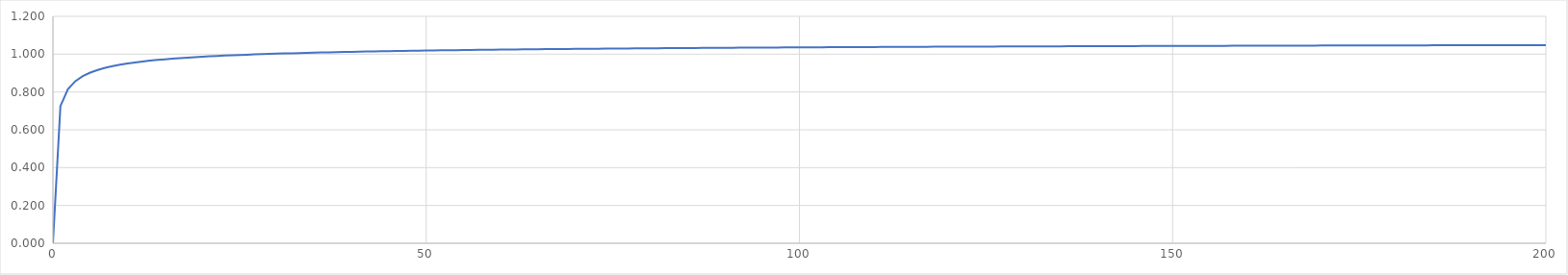
| Category | Series 0 |
|---|---|
| 1e-08 | 0 |
| 1.0 | 0.725 |
| 2.0 | 0.814 |
| 3.0 | 0.857 |
| 4.0 | 0.884 |
| 5.0 | 0.903 |
| 6.0 | 0.917 |
| 7.0 | 0.928 |
| 8.0 | 0.937 |
| 9.0 | 0.944 |
| 10.0 | 0.951 |
| 11.0 | 0.956 |
| 12.0 | 0.961 |
| 13.0 | 0.966 |
| 14.0 | 0.969 |
| 15.0 | 0.973 |
| 16.0 | 0.976 |
| 17.0 | 0.979 |
| 18.0 | 0.982 |
| 19.0 | 0.984 |
| 20.0 | 0.986 |
| 21.0 | 0.988 |
| 22.0 | 0.99 |
| 23.0 | 0.992 |
| 24.0 | 0.994 |
| 25.0 | 0.996 |
| 26.0 | 0.997 |
| 27.0 | 0.999 |
| 28.0 | 1 |
| 29.0 | 1.001 |
| 30.0 | 1.003 |
| 31.0 | 1.004 |
| 32.0 | 1.005 |
| 33.0 | 1.006 |
| 34.0 | 1.007 |
| 35.0 | 1.008 |
| 36.0 | 1.009 |
| 37.0 | 1.01 |
| 38.0 | 1.011 |
| 39.0 | 1.012 |
| 40.0 | 1.012 |
| 41.0 | 1.013 |
| 42.0 | 1.014 |
| 43.0 | 1.015 |
| 44.0 | 1.015 |
| 45.0 | 1.016 |
| 46.0 | 1.017 |
| 47.0 | 1.017 |
| 48.0 | 1.018 |
| 49.0 | 1.018 |
| 50.0 | 1.019 |
| 51.0 | 1.02 |
| 52.0 | 1.02 |
| 53.0 | 1.021 |
| 54.0 | 1.021 |
| 55.0 | 1.022 |
| 56.0 | 1.022 |
| 57.0 | 1.023 |
| 58.0 | 1.023 |
| 59.0 | 1.024 |
| 60.0 | 1.024 |
| 61.0 | 1.024 |
| 62.0 | 1.025 |
| 63.0 | 1.025 |
| 64.0 | 1.026 |
| 65.0 | 1.026 |
| 66.0 | 1.026 |
| 67.0 | 1.027 |
| 68.0 | 1.027 |
| 69.0 | 1.028 |
| 70.0 | 1.028 |
| 71.0 | 1.028 |
| 72.0 | 1.029 |
| 73.0 | 1.029 |
| 74.0 | 1.029 |
| 75.0 | 1.03 |
| 76.0 | 1.03 |
| 77.0 | 1.03 |
| 78.0 | 1.031 |
| 79.0 | 1.031 |
| 80.0 | 1.031 |
| 81.0 | 1.031 |
| 82.0 | 1.032 |
| 83.0 | 1.032 |
| 84.0 | 1.032 |
| 85.0 | 1.032 |
| 86.0 | 1.033 |
| 87.0 | 1.033 |
| 88.0 | 1.033 |
| 89.0 | 1.033 |
| 90.0 | 1.034 |
| 91.0 | 1.034 |
| 92.0 | 1.034 |
| 93.0 | 1.034 |
| 94.0 | 1.035 |
| 95.0 | 1.035 |
| 96.0 | 1.035 |
| 97.0 | 1.035 |
| 98.0 | 1.036 |
| 99.0 | 1.036 |
| 100.0 | 1.036 |
| 101.0 | 1.036 |
| 102.0 | 1.036 |
| 103.0 | 1.037 |
| 104.0 | 1.037 |
| 105.0 | 1.037 |
| 106.0 | 1.037 |
| 107.0 | 1.037 |
| 108.0 | 1.037 |
| 109.0 | 1.038 |
| 110.0 | 1.038 |
| 111.0 | 1.038 |
| 112.0 | 1.038 |
| 113.0 | 1.038 |
| 114.0 | 1.039 |
| 115.0 | 1.039 |
| 116.0 | 1.039 |
| 117.0 | 1.039 |
| 118.0 | 1.039 |
| 119.0 | 1.039 |
| 120.0 | 1.04 |
| 121.0 | 1.04 |
| 122.0 | 1.04 |
| 123.0 | 1.04 |
| 124.0 | 1.04 |
| 125.0 | 1.04 |
| 126.0 | 1.04 |
| 127.0 | 1.041 |
| 128.0 | 1.041 |
| 129.0 | 1.041 |
| 130.0 | 1.041 |
| 131.0 | 1.041 |
| 132.0 | 1.041 |
| 133.0 | 1.041 |
| 134.0 | 1.042 |
| 135.0 | 1.042 |
| 136.0 | 1.042 |
| 137.0 | 1.042 |
| 138.0 | 1.042 |
| 139.0 | 1.042 |
| 140.0 | 1.042 |
| 141.0 | 1.042 |
| 142.0 | 1.043 |
| 143.0 | 1.043 |
| 144.0 | 1.043 |
| 145.0 | 1.043 |
| 146.0 | 1.043 |
| 147.0 | 1.043 |
| 148.0 | 1.043 |
| 149.0 | 1.043 |
| 150.0 | 1.044 |
| 151.0 | 1.044 |
| 152.0 | 1.044 |
| 153.0 | 1.044 |
| 154.0 | 1.044 |
| 155.0 | 1.044 |
| 156.0 | 1.044 |
| 157.0 | 1.044 |
| 158.0 | 1.044 |
| 159.0 | 1.044 |
| 160.0 | 1.045 |
| 161.0 | 1.045 |
| 162.0 | 1.045 |
| 163.0 | 1.045 |
| 164.0 | 1.045 |
| 165.0 | 1.045 |
| 166.0 | 1.045 |
| 167.0 | 1.045 |
| 168.0 | 1.045 |
| 169.0 | 1.045 |
| 170.0 | 1.046 |
| 171.0 | 1.046 |
| 172.0 | 1.046 |
| 173.0 | 1.046 |
| 174.0 | 1.046 |
| 175.0 | 1.046 |
| 176.0 | 1.046 |
| 177.0 | 1.046 |
| 178.0 | 1.046 |
| 179.0 | 1.046 |
| 180.0 | 1.046 |
| 181.0 | 1.047 |
| 182.0 | 1.047 |
| 183.0 | 1.047 |
| 184.0 | 1.047 |
| 185.0 | 1.047 |
| 186.0 | 1.047 |
| 187.0 | 1.047 |
| 188.0 | 1.047 |
| 189.0 | 1.047 |
| 190.0 | 1.047 |
| 191.0 | 1.047 |
| 192.0 | 1.047 |
| 193.0 | 1.048 |
| 194.0 | 1.048 |
| 195.0 | 1.048 |
| 196.0 | 1.048 |
| 197.0 | 1.048 |
| 198.0 | 1.048 |
| 199.0 | 1.048 |
| 200.0 | 1.048 |
| 201.0 | 1.048 |
| 202.0 | 1.048 |
| 203.0 | 1.048 |
| 204.0 | 1.048 |
| 205.0 | 1.048 |
| 206.0 | 1.048 |
| 207.0 | 1.049 |
| 208.0 | 1.049 |
| 209.0 | 1.049 |
| 210.0 | 1.049 |
| 211.0 | 1.049 |
| 212.0 | 1.049 |
| 213.0 | 1.049 |
| 214.0 | 1.049 |
| 215.0 | 1.049 |
| 216.0 | 1.049 |
| 217.0 | 1.049 |
| 218.0 | 1.049 |
| 219.0 | 1.049 |
| 220.0 | 1.049 |
| 221.0 | 1.049 |
| 222.0 | 1.05 |
| 223.0 | 1.05 |
| 224.0 | 1.05 |
| 225.0 | 1.05 |
| 226.0 | 1.05 |
| 227.0 | 1.05 |
| 228.0 | 1.05 |
| 229.0 | 1.05 |
| 230.0 | 1.05 |
| 231.0 | 1.05 |
| 232.0 | 1.05 |
| 233.0 | 1.05 |
| 234.0 | 1.05 |
| 235.0 | 1.05 |
| 236.0 | 1.05 |
| 237.0 | 1.05 |
| 238.0 | 1.051 |
| 239.0 | 1.051 |
| 240.0 | 1.051 |
| 241.0 | 1.051 |
| 242.0 | 1.051 |
| 243.0 | 1.051 |
| 244.0 | 1.051 |
| 245.0 | 1.051 |
| 246.0 | 1.051 |
| 247.0 | 1.051 |
| 248.0 | 1.051 |
| 249.0 | 1.051 |
| 250.0 | 1.051 |
| 251.0 | 1.051 |
| 252.0 | 1.051 |
| 253.0 | 1.051 |
| 254.0 | 1.051 |
| 255.0 | 1.051 |
| 256.0 | 1.051 |
| 257.0 | 1.052 |
| 258.0 | 1.052 |
| 259.0 | 1.052 |
| 260.0 | 1.052 |
| 261.0 | 1.052 |
| 262.0 | 1.052 |
| 263.0 | 1.052 |
| 264.0 | 1.052 |
| 265.0 | 1.052 |
| 266.0 | 1.052 |
| 267.0 | 1.052 |
| 268.0 | 1.052 |
| 269.0 | 1.052 |
| 270.0 | 1.052 |
| 271.0 | 1.052 |
| 272.0 | 1.052 |
| 273.0 | 1.052 |
| 274.0 | 1.052 |
| 275.0 | 1.052 |
| 276.0 | 1.052 |
| 277.0 | 1.052 |
| 278.0 | 1.053 |
| 279.0 | 1.053 |
| 280.0 | 1.053 |
| 281.0 | 1.053 |
| 282.0 | 1.053 |
| 283.0 | 1.053 |
| 284.0 | 1.053 |
| 285.0 | 1.053 |
| 286.0 | 1.053 |
| 287.0 | 1.053 |
| 288.0 | 1.053 |
| 289.0 | 1.053 |
| 290.0 | 1.053 |
| 291.0 | 1.053 |
| 292.0 | 1.053 |
| 293.0 | 1.053 |
| 294.0 | 1.053 |
| 295.0 | 1.053 |
| 296.0 | 1.053 |
| 297.0 | 1.053 |
| 298.0 | 1.053 |
| 299.0 | 1.053 |
| 300.0 | 1.053 |
| 301.0 | 1.054 |
| 302.0 | 1.054 |
| 303.0 | 1.054 |
| 304.0 | 1.054 |
| 305.0 | 1.054 |
| 306.0 | 1.054 |
| 307.0 | 1.054 |
| 308.0 | 1.054 |
| 309.0 | 1.054 |
| 310.0 | 1.054 |
| 311.0 | 1.054 |
| 312.0 | 1.054 |
| 313.0 | 1.054 |
| 314.0 | 1.054 |
| 315.0 | 1.054 |
| 316.0 | 1.054 |
| 317.0 | 1.054 |
| 318.0 | 1.054 |
| 319.0 | 1.054 |
| 320.0 | 1.054 |
| 321.0 | 1.054 |
| 322.0 | 1.054 |
| 323.0 | 1.054 |
| 324.0 | 1.054 |
| 325.0 | 1.054 |
| 326.0 | 1.054 |
| 327.0 | 1.054 |
| 328.0 | 1.055 |
| 329.0 | 1.055 |
| 330.0 | 1.055 |
| 331.0 | 1.055 |
| 332.0 | 1.055 |
| 333.0 | 1.055 |
| 334.0 | 1.055 |
| 335.0 | 1.055 |
| 336.0 | 1.055 |
| 337.0 | 1.055 |
| 338.0 | 1.055 |
| 339.0 | 1.055 |
| 340.0 | 1.055 |
| 341.0 | 1.055 |
| 342.0 | 1.055 |
| 343.0 | 1.055 |
| 344.0 | 1.055 |
| 345.0 | 1.055 |
| 346.0 | 1.055 |
| 347.0 | 1.055 |
| 348.0 | 1.055 |
| 349.0 | 1.055 |
| 350.0 | 1.055 |
| 351.0 | 1.055 |
| 352.0 | 1.055 |
| 353.0 | 1.055 |
| 354.0 | 1.055 |
| 355.0 | 1.055 |
| 356.0 | 1.055 |
| 357.0 | 1.055 |
| 358.0 | 1.056 |
| 359.0 | 1.056 |
| 360.0 | 1.056 |
| 361.0 | 1.056 |
| 362.0 | 1.056 |
| 363.0 | 1.056 |
| 364.0 | 1.056 |
| 365.0 | 1.056 |
| 366.0 | 1.056 |
| 367.0 | 1.056 |
| 368.0 | 1.056 |
| 369.0 | 1.056 |
| 370.0 | 1.056 |
| 371.0 | 1.056 |
| 372.0 | 1.056 |
| 373.0 | 1.056 |
| 374.0 | 1.056 |
| 375.0 | 1.056 |
| 376.0 | 1.056 |
| 377.0 | 1.056 |
| 378.0 | 1.056 |
| 379.0 | 1.056 |
| 380.0 | 1.056 |
| 381.0 | 1.056 |
| 382.0 | 1.056 |
| 383.0 | 1.056 |
| 384.0 | 1.056 |
| 385.0 | 1.056 |
| 386.0 | 1.056 |
| 387.0 | 1.056 |
| 388.0 | 1.056 |
| 389.0 | 1.056 |
| 390.0 | 1.056 |
| 391.0 | 1.056 |
| 392.0 | 1.056 |
| 393.0 | 1.057 |
| 394.0 | 1.057 |
| 395.0 | 1.057 |
| 396.0 | 1.057 |
| 397.0 | 1.057 |
| 398.0 | 1.057 |
| 399.0 | 1.057 |
| 400.0 | 1.057 |
| 401.0 | 1.057 |
| 402.0 | 1.057 |
| 403.0 | 1.057 |
| 404.0 | 1.057 |
| 405.0 | 1.057 |
| 406.0 | 1.057 |
| 407.0 | 1.057 |
| 408.0 | 1.057 |
| 409.0 | 1.057 |
| 410.0 | 1.057 |
| 411.0 | 1.057 |
| 412.0 | 1.057 |
| 413.0 | 1.057 |
| 414.0 | 1.057 |
| 415.0 | 1.057 |
| 416.0 | 1.057 |
| 417.0 | 1.057 |
| 418.0 | 1.057 |
| 419.0 | 1.057 |
| 420.0 | 1.057 |
| 421.0 | 1.057 |
| 422.0 | 1.057 |
| 423.0 | 1.057 |
| 424.0 | 1.057 |
| 425.0 | 1.057 |
| 426.0 | 1.057 |
| 427.0 | 1.057 |
| 428.0 | 1.057 |
| 429.0 | 1.057 |
| 430.0 | 1.057 |
| 431.0 | 1.057 |
| 432.0 | 1.057 |
| 433.0 | 1.058 |
| 434.0 | 1.058 |
| 435.0 | 1.058 |
| 436.0 | 1.058 |
| 437.0 | 1.058 |
| 438.0 | 1.058 |
| 439.0 | 1.058 |
| 440.0 | 1.058 |
| 441.0 | 1.058 |
| 442.0 | 1.058 |
| 443.0 | 1.058 |
| 444.0 | 1.058 |
| 445.0 | 1.058 |
| 446.0 | 1.058 |
| 447.0 | 1.058 |
| 448.0 | 1.058 |
| 449.0 | 1.058 |
| 450.0 | 1.058 |
| 451.0 | 1.058 |
| 452.0 | 1.058 |
| 453.0 | 1.058 |
| 454.0 | 1.058 |
| 455.0 | 1.058 |
| 456.0 | 1.058 |
| 457.0 | 1.058 |
| 458.0 | 1.058 |
| 459.0 | 1.058 |
| 460.0 | 1.058 |
| 461.0 | 1.058 |
| 462.0 | 1.058 |
| 463.0 | 1.058 |
| 464.0 | 1.058 |
| 465.0 | 1.058 |
| 466.0 | 1.058 |
| 467.0 | 1.058 |
| 468.0 | 1.058 |
| 469.0 | 1.058 |
| 470.0 | 1.058 |
| 471.0 | 1.058 |
| 472.0 | 1.058 |
| 473.0 | 1.058 |
| 474.0 | 1.058 |
| 475.0 | 1.058 |
| 476.0 | 1.058 |
| 477.0 | 1.058 |
| 478.0 | 1.058 |
| 479.0 | 1.059 |
| 480.0 | 1.059 |
| 481.0 | 1.059 |
| 482.0 | 1.059 |
| 483.0 | 1.059 |
| 484.0 | 1.059 |
| 485.0 | 1.059 |
| 486.0 | 1.059 |
| 487.0 | 1.059 |
| 488.0 | 1.059 |
| 489.0 | 1.059 |
| 490.0 | 1.059 |
| 491.0 | 1.059 |
| 492.0 | 1.059 |
| 493.0 | 1.059 |
| 494.0 | 1.059 |
| 495.0 | 1.059 |
| 496.0 | 1.059 |
| 497.0 | 1.059 |
| 498.0 | 1.059 |
| 499.0 | 1.059 |
| 500.0 | 1.059 |
| 501.0 | 1.059 |
| 502.0 | 1.059 |
| 503.0 | 1.059 |
| 504.0 | 1.059 |
| 505.0 | 1.059 |
| 506.0 | 1.059 |
| 507.0 | 1.059 |
| 508.0 | 1.059 |
| 509.0 | 1.059 |
| 510.0 | 1.059 |
| 511.0 | 1.059 |
| 512.0 | 1.059 |
| 513.0 | 1.059 |
| 514.0 | 1.059 |
| 515.0 | 1.059 |
| 516.0 | 1.059 |
| 517.0 | 1.059 |
| 518.0 | 1.059 |
| 519.0 | 1.059 |
| 520.0 | 1.059 |
| 521.0 | 1.059 |
| 522.0 | 1.059 |
| 523.0 | 1.059 |
| 524.0 | 1.059 |
| 525.0 | 1.059 |
| 526.0 | 1.059 |
| 527.0 | 1.059 |
| 528.0 | 1.059 |
| 529.0 | 1.059 |
| 530.0 | 1.059 |
| 531.0 | 1.059 |
| 532.0 | 1.059 |
| 533.0 | 1.06 |
| 534.0 | 1.06 |
| 535.0 | 1.06 |
| 536.0 | 1.06 |
| 537.0 | 1.06 |
| 538.0 | 1.06 |
| 539.0 | 1.06 |
| 540.0 | 1.06 |
| 541.0 | 1.06 |
| 542.0 | 1.06 |
| 543.0 | 1.06 |
| 544.0 | 1.06 |
| 545.0 | 1.06 |
| 546.0 | 1.06 |
| 547.0 | 1.06 |
| 548.0 | 1.06 |
| 549.0 | 1.06 |
| 550.0 | 1.06 |
| 551.0 | 1.06 |
| 552.0 | 1.06 |
| 553.0 | 1.06 |
| 554.0 | 1.06 |
| 555.0 | 1.06 |
| 556.0 | 1.06 |
| 557.0 | 1.06 |
| 558.0 | 1.06 |
| 559.0 | 1.06 |
| 560.0 | 1.06 |
| 561.0 | 1.06 |
| 562.0 | 1.06 |
| 563.0 | 1.06 |
| 564.0 | 1.06 |
| 565.0 | 1.06 |
| 566.0 | 1.06 |
| 567.0 | 1.06 |
| 568.0 | 1.06 |
| 569.0 | 1.06 |
| 570.0 | 1.06 |
| 571.0 | 1.06 |
| 572.0 | 1.06 |
| 573.0 | 1.06 |
| 574.0 | 1.06 |
| 575.0 | 1.06 |
| 576.0 | 1.06 |
| 577.0 | 1.06 |
| 578.0 | 1.06 |
| 579.0 | 1.06 |
| 580.0 | 1.06 |
| 581.0 | 1.06 |
| 582.0 | 1.06 |
| 583.0 | 1.06 |
| 584.0 | 1.06 |
| 585.0 | 1.06 |
| 586.0 | 1.06 |
| 587.0 | 1.06 |
| 588.0 | 1.06 |
| 589.0 | 1.06 |
| 590.0 | 1.06 |
| 591.0 | 1.06 |
| 592.0 | 1.06 |
| 593.0 | 1.06 |
| 594.0 | 1.06 |
| 595.0 | 1.06 |
| 596.0 | 1.061 |
| 597.0 | 1.061 |
| 598.0 | 1.061 |
| 599.0 | 1.061 |
| 600.0 | 1.061 |
| 601.0 | 1.061 |
| 602.0 | 1.061 |
| 603.0 | 1.061 |
| 604.0 | 1.061 |
| 605.0 | 1.061 |
| 606.0 | 1.061 |
| 607.0 | 1.061 |
| 608.0 | 1.061 |
| 609.0 | 1.061 |
| 610.0 | 1.061 |
| 611.0 | 1.061 |
| 612.0 | 1.061 |
| 613.0 | 1.061 |
| 614.0 | 1.061 |
| 615.0 | 1.061 |
| 616.0 | 1.061 |
| 617.0 | 1.061 |
| 618.0 | 1.061 |
| 619.0 | 1.061 |
| 620.0 | 1.061 |
| 621.0 | 1.061 |
| 622.0 | 1.061 |
| 623.0 | 1.061 |
| 624.0 | 1.061 |
| 625.0 | 1.061 |
| 626.0 | 1.061 |
| 627.0 | 1.061 |
| 628.0 | 1.061 |
| 629.0 | 1.061 |
| 630.0 | 1.061 |
| 631.0 | 1.061 |
| 632.0 | 1.061 |
| 633.0 | 1.061 |
| 634.0 | 1.061 |
| 635.0 | 1.061 |
| 636.0 | 1.061 |
| 637.0 | 1.061 |
| 638.0 | 1.061 |
| 639.0 | 1.061 |
| 640.0 | 1.061 |
| 641.0 | 1.061 |
| 642.0 | 1.061 |
| 643.0 | 1.061 |
| 644.0 | 1.061 |
| 645.0 | 1.061 |
| 646.0 | 1.061 |
| 647.0 | 1.061 |
| 648.0 | 1.061 |
| 649.0 | 1.061 |
| 650.0 | 1.061 |
| 651.0 | 1.061 |
| 652.0 | 1.061 |
| 653.0 | 1.061 |
| 654.0 | 1.061 |
| 655.0 | 1.061 |
| 656.0 | 1.061 |
| 657.0 | 1.061 |
| 658.0 | 1.061 |
| 659.0 | 1.061 |
| 660.0 | 1.061 |
| 661.0 | 1.061 |
| 662.0 | 1.061 |
| 663.0 | 1.061 |
| 664.0 | 1.061 |
| 665.0 | 1.061 |
| 666.0 | 1.061 |
| 667.0 | 1.061 |
| 668.0 | 1.061 |
| 669.0 | 1.061 |
| 670.0 | 1.061 |
| 671.0 | 1.061 |
| 672.0 | 1.062 |
| 673.0 | 1.062 |
| 674.0 | 1.062 |
| 675.0 | 1.062 |
| 676.0 | 1.062 |
| 677.0 | 1.062 |
| 678.0 | 1.062 |
| 679.0 | 1.062 |
| 680.0 | 1.062 |
| 681.0 | 1.062 |
| 682.0 | 1.062 |
| 683.0 | 1.062 |
| 684.0 | 1.062 |
| 685.0 | 1.062 |
| 686.0 | 1.062 |
| 687.0 | 1.062 |
| 688.0 | 1.062 |
| 689.0 | 1.062 |
| 690.0 | 1.062 |
| 691.0 | 1.062 |
| 692.0 | 1.062 |
| 693.0 | 1.062 |
| 694.0 | 1.062 |
| 695.0 | 1.062 |
| 696.0 | 1.062 |
| 697.0 | 1.062 |
| 698.0 | 1.062 |
| 699.0 | 1.062 |
| 700.0 | 1.062 |
| 701.0 | 1.062 |
| 702.0 | 1.062 |
| 703.0 | 1.062 |
| 704.0 | 1.062 |
| 705.0 | 1.062 |
| 706.0 | 1.062 |
| 707.0 | 1.062 |
| 708.0 | 1.062 |
| 709.0 | 1.062 |
| 710.0 | 1.062 |
| 711.0 | 1.062 |
| 712.0 | 1.062 |
| 713.0 | 1.062 |
| 714.0 | 1.062 |
| 715.0 | 1.062 |
| 716.0 | 1.062 |
| 717.0 | 1.062 |
| 718.0 | 1.062 |
| 719.0 | 1.062 |
| 720.0 | 1.062 |
| 721.0 | 1.062 |
| 722.0 | 1.062 |
| 723.0 | 1.062 |
| 724.0 | 1.062 |
| 725.0 | 1.062 |
| 726.0 | 1.062 |
| 727.0 | 1.062 |
| 728.0 | 1.062 |
| 729.0 | 1.062 |
| 730.0 | 1.062 |
| 731.0 | 1.062 |
| 732.0 | 1.062 |
| 733.0 | 1.062 |
| 734.0 | 1.062 |
| 735.0 | 1.062 |
| 736.0 | 1.062 |
| 737.0 | 1.062 |
| 738.0 | 1.062 |
| 739.0 | 1.062 |
| 740.0 | 1.062 |
| 741.0 | 1.062 |
| 742.0 | 1.062 |
| 743.0 | 1.062 |
| 744.0 | 1.062 |
| 745.0 | 1.062 |
| 746.0 | 1.062 |
| 747.0 | 1.062 |
| 748.0 | 1.062 |
| 749.0 | 1.062 |
| 750.0 | 1.062 |
| 751.0 | 1.062 |
| 752.0 | 1.062 |
| 753.0 | 1.062 |
| 754.0 | 1.062 |
| 755.0 | 1.062 |
| 756.0 | 1.062 |
| 757.0 | 1.062 |
| 758.0 | 1.062 |
| 759.0 | 1.062 |
| 760.0 | 1.062 |
| 761.0 | 1.062 |
| 762.0 | 1.062 |
| 763.0 | 1.063 |
| 764.0 | 1.063 |
| 765.0 | 1.063 |
| 766.0 | 1.063 |
| 767.0 | 1.063 |
| 768.0 | 1.063 |
| 769.0 | 1.063 |
| 770.0 | 1.063 |
| 771.0 | 1.063 |
| 772.0 | 1.063 |
| 773.0 | 1.063 |
| 774.0 | 1.063 |
| 775.0 | 1.063 |
| 776.0 | 1.063 |
| 777.0 | 1.063 |
| 778.0 | 1.063 |
| 779.0 | 1.063 |
| 780.0 | 1.063 |
| 781.0 | 1.063 |
| 782.0 | 1.063 |
| 783.0 | 1.063 |
| 784.0 | 1.063 |
| 785.0 | 1.063 |
| 786.0 | 1.063 |
| 787.0 | 1.063 |
| 788.0 | 1.063 |
| 789.0 | 1.063 |
| 790.0 | 1.063 |
| 791.0 | 1.063 |
| 792.0 | 1.063 |
| 793.0 | 1.063 |
| 794.0 | 1.063 |
| 795.0 | 1.063 |
| 796.0 | 1.063 |
| 797.0 | 1.063 |
| 798.0 | 1.063 |
| 799.0 | 1.063 |
| 800.0 | 1.063 |
| 801.0 | 1.063 |
| 802.0 | 1.063 |
| 803.0 | 1.063 |
| 804.0 | 1.063 |
| 805.0 | 1.063 |
| 806.0 | 1.063 |
| 807.0 | 1.063 |
| 808.0 | 1.063 |
| 809.0 | 1.063 |
| 810.0 | 1.063 |
| 811.0 | 1.063 |
| 812.0 | 1.063 |
| 813.0 | 1.063 |
| 814.0 | 1.063 |
| 815.0 | 1.063 |
| 816.0 | 1.063 |
| 817.0 | 1.063 |
| 818.0 | 1.063 |
| 819.0 | 1.063 |
| 820.0 | 1.063 |
| 821.0 | 1.063 |
| 822.0 | 1.063 |
| 823.0 | 1.063 |
| 824.0 | 1.063 |
| 825.0 | 1.063 |
| 826.0 | 1.063 |
| 827.0 | 1.063 |
| 828.0 | 1.063 |
| 829.0 | 1.063 |
| 830.0 | 1.063 |
| 831.0 | 1.063 |
| 832.0 | 1.063 |
| 833.0 | 1.063 |
| 834.0 | 1.063 |
| 835.0 | 1.063 |
| 836.0 | 1.063 |
| 837.0 | 1.063 |
| 838.0 | 1.063 |
| 839.0 | 1.063 |
| 840.0 | 1.063 |
| 841.0 | 1.063 |
| 842.0 | 1.063 |
| 843.0 | 1.063 |
| 844.0 | 1.063 |
| 845.0 | 1.063 |
| 846.0 | 1.063 |
| 847.0 | 1.063 |
| 848.0 | 1.063 |
| 849.0 | 1.063 |
| 850.0 | 1.063 |
| 851.0 | 1.063 |
| 852.0 | 1.063 |
| 853.0 | 1.063 |
| 854.0 | 1.063 |
| 855.0 | 1.063 |
| 856.0 | 1.063 |
| 857.0 | 1.063 |
| 858.0 | 1.063 |
| 859.0 | 1.063 |
| 860.0 | 1.063 |
| 861.0 | 1.063 |
| 862.0 | 1.063 |
| 863.0 | 1.063 |
| 864.0 | 1.063 |
| 865.0 | 1.063 |
| 866.0 | 1.063 |
| 867.0 | 1.063 |
| 868.0 | 1.063 |
| 869.0 | 1.063 |
| 870.0 | 1.063 |
| 871.0 | 1.063 |
| 872.0 | 1.063 |
| 873.0 | 1.064 |
| 874.0 | 1.064 |
| 875.0 | 1.064 |
| 876.0 | 1.064 |
| 877.0 | 1.064 |
| 878.0 | 1.064 |
| 879.0 | 1.064 |
| 880.0 | 1.064 |
| 881.0 | 1.064 |
| 882.0 | 1.064 |
| 883.0 | 1.064 |
| 884.0 | 1.064 |
| 885.0 | 1.064 |
| 886.0 | 1.064 |
| 887.0 | 1.064 |
| 888.0 | 1.064 |
| 889.0 | 1.064 |
| 890.0 | 1.064 |
| 891.0 | 1.064 |
| 892.0 | 1.064 |
| 893.0 | 1.064 |
| 894.0 | 1.064 |
| 895.0 | 1.064 |
| 896.0 | 1.064 |
| 897.0 | 1.064 |
| 898.0 | 1.064 |
| 899.0 | 1.064 |
| 900.0 | 1.064 |
| 901.0 | 1.064 |
| 902.0 | 1.064 |
| 903.0 | 1.064 |
| 904.0 | 1.064 |
| 905.0 | 1.064 |
| 906.0 | 1.064 |
| 907.0 | 1.064 |
| 908.0 | 1.064 |
| 909.0 | 1.064 |
| 910.0 | 1.064 |
| 911.0 | 1.064 |
| 912.0 | 1.064 |
| 913.0 | 1.064 |
| 914.0 | 1.064 |
| 915.0 | 1.064 |
| 916.0 | 1.064 |
| 917.0 | 1.064 |
| 918.0 | 1.064 |
| 919.0 | 1.064 |
| 920.0 | 1.064 |
| 921.0 | 1.064 |
| 922.0 | 1.064 |
| 923.0 | 1.064 |
| 924.0 | 1.064 |
| 925.0 | 1.064 |
| 926.0 | 1.064 |
| 927.0 | 1.064 |
| 928.0 | 1.064 |
| 929.0 | 1.064 |
| 930.0 | 1.064 |
| 931.0 | 1.064 |
| 932.0 | 1.064 |
| 933.0 | 1.064 |
| 934.0 | 1.064 |
| 935.0 | 1.064 |
| 936.0 | 1.064 |
| 937.0 | 1.064 |
| 938.0 | 1.064 |
| 939.0 | 1.064 |
| 940.0 | 1.064 |
| 941.0 | 1.064 |
| 942.0 | 1.064 |
| 943.0 | 1.064 |
| 944.0 | 1.064 |
| 945.0 | 1.064 |
| 946.0 | 1.064 |
| 947.0 | 1.064 |
| 948.0 | 1.064 |
| 949.0 | 1.064 |
| 950.0 | 1.064 |
| 951.0 | 1.064 |
| 952.0 | 1.064 |
| 953.0 | 1.064 |
| 954.0 | 1.064 |
| 955.0 | 1.064 |
| 956.0 | 1.064 |
| 957.0 | 1.064 |
| 958.0 | 1.064 |
| 959.0 | 1.064 |
| 960.0 | 1.064 |
| 961.0 | 1.064 |
| 962.0 | 1.064 |
| 963.0 | 1.064 |
| 964.0 | 1.064 |
| 965.0 | 1.064 |
| 966.0 | 1.064 |
| 967.0 | 1.064 |
| 968.0 | 1.064 |
| 969.0 | 1.064 |
| 970.0 | 1.064 |
| 971.0 | 1.064 |
| 972.0 | 1.064 |
| 973.0 | 1.064 |
| 974.0 | 1.064 |
| 975.0 | 1.064 |
| 976.0 | 1.064 |
| 977.0 | 1.064 |
| 978.0 | 1.064 |
| 979.0 | 1.064 |
| 980.0 | 1.064 |
| 981.0 | 1.064 |
| 982.0 | 1.064 |
| 983.0 | 1.064 |
| 984.0 | 1.064 |
| 985.0 | 1.064 |
| 986.0 | 1.064 |
| 987.0 | 1.064 |
| 988.0 | 1.064 |
| 989.0 | 1.064 |
| 990.0 | 1.064 |
| 991.0 | 1.064 |
| 992.0 | 1.064 |
| 993.0 | 1.064 |
| 994.0 | 1.064 |
| 995.0 | 1.064 |
| 996.0 | 1.064 |
| 997.0 | 1.064 |
| 998.0 | 1.064 |
| 999.0 | 1.064 |
| 1000.0 | 1.064 |
| 1001.0 | 1.064 |
| 1002.0 | 1.064 |
| 1003.0 | 1.064 |
| 1004.0 | 1.064 |
| 1005.0 | 1.064 |
| 1006.0 | 1.064 |
| 1007.0 | 1.064 |
| 1008.0 | 1.064 |
| 1009.0 | 1.065 |
| 1010.0 | 1.065 |
| 1011.0 | 1.065 |
| 1012.0 | 1.065 |
| 1013.0 | 1.065 |
| 1014.0 | 1.065 |
| 1015.0 | 1.065 |
| 1016.0 | 1.065 |
| 1017.0 | 1.065 |
| 1018.0 | 1.065 |
| 1019.0 | 1.065 |
| 1020.0 | 1.065 |
| 1021.0 | 1.065 |
| 1022.0 | 1.065 |
| 1023.0 | 1.065 |
| 1024.0 | 1.065 |
| 1025.0 | 1.065 |
| 1026.0 | 1.065 |
| 1027.0 | 1.065 |
| 1028.0 | 1.065 |
| 1029.0 | 1.065 |
| 1030.0 | 1.065 |
| 1031.0 | 1.065 |
| 1032.0 | 1.065 |
| 1033.0 | 1.065 |
| 1034.0 | 1.065 |
| 1035.0 | 1.065 |
| 1036.0 | 1.065 |
| 1037.0 | 1.065 |
| 1038.0 | 1.065 |
| 1039.0 | 1.065 |
| 1040.0 | 1.065 |
| 1041.0 | 1.065 |
| 1042.0 | 1.065 |
| 1043.0 | 1.065 |
| 1044.0 | 1.065 |
| 1045.0 | 1.065 |
| 1046.0 | 1.065 |
| 1047.0 | 1.065 |
| 1048.0 | 1.065 |
| 1049.0 | 1.065 |
| 1050.0 | 1.065 |
| 1051.0 | 1.065 |
| 1052.0 | 1.065 |
| 1053.0 | 1.065 |
| 1054.0 | 1.065 |
| 1055.0 | 1.065 |
| 1056.0 | 1.065 |
| 1057.0 | 1.065 |
| 1058.0 | 1.065 |
| 1059.0 | 1.065 |
| 1060.0 | 1.065 |
| 1061.0 | 1.065 |
| 1062.0 | 1.065 |
| 1063.0 | 1.065 |
| 1064.0 | 1.065 |
| 1065.0 | 1.065 |
| 1066.0 | 1.065 |
| 1067.0 | 1.065 |
| 1068.0 | 1.065 |
| 1069.0 | 1.065 |
| 1070.0 | 1.065 |
| 1071.0 | 1.065 |
| 1072.0 | 1.065 |
| 1073.0 | 1.065 |
| 1074.0 | 1.065 |
| 1075.0 | 1.065 |
| 1076.0 | 1.065 |
| 1077.0 | 1.065 |
| 1078.0 | 1.065 |
| 1079.0 | 1.065 |
| 1080.0 | 1.065 |
| 1081.0 | 1.065 |
| 1082.0 | 1.065 |
| 1083.0 | 1.065 |
| 1084.0 | 1.065 |
| 1085.0 | 1.065 |
| 1086.0 | 1.065 |
| 1087.0 | 1.065 |
| 1088.0 | 1.065 |
| 1089.0 | 1.065 |
| 1090.0 | 1.065 |
| 1091.0 | 1.065 |
| 1092.0 | 1.065 |
| 1093.0 | 1.065 |
| 1094.0 | 1.065 |
| 1095.0 | 1.065 |
| 1096.0 | 1.065 |
| 1097.0 | 1.065 |
| 1098.0 | 1.065 |
| 1099.0 | 1.065 |
| 1100.0 | 1.065 |
| 1101.0 | 1.065 |
| 1102.0 | 1.065 |
| 1103.0 | 1.065 |
| 1104.0 | 1.065 |
| 1105.0 | 1.065 |
| 1106.0 | 1.065 |
| 1107.0 | 1.065 |
| 1108.0 | 1.065 |
| 1109.0 | 1.065 |
| 1110.0 | 1.065 |
| 1111.0 | 1.065 |
| 1112.0 | 1.065 |
| 1113.0 | 1.065 |
| 1114.0 | 1.065 |
| 1115.0 | 1.065 |
| 1116.0 | 1.065 |
| 1117.0 | 1.065 |
| 1118.0 | 1.065 |
| 1119.0 | 1.065 |
| 1120.0 | 1.065 |
| 1121.0 | 1.065 |
| 1122.0 | 1.065 |
| 1123.0 | 1.065 |
| 1124.0 | 1.065 |
| 1125.0 | 1.065 |
| 1126.0 | 1.065 |
| 1127.0 | 1.065 |
| 1128.0 | 1.065 |
| 1129.0 | 1.065 |
| 1130.0 | 1.065 |
| 1131.0 | 1.065 |
| 1132.0 | 1.065 |
| 1133.0 | 1.065 |
| 1134.0 | 1.065 |
| 1135.0 | 1.065 |
| 1136.0 | 1.065 |
| 1137.0 | 1.065 |
| 1138.0 | 1.065 |
| 1139.0 | 1.065 |
| 1140.0 | 1.065 |
| 1141.0 | 1.065 |
| 1142.0 | 1.065 |
| 1143.0 | 1.065 |
| 1144.0 | 1.065 |
| 1145.0 | 1.065 |
| 1146.0 | 1.065 |
| 1147.0 | 1.065 |
| 1148.0 | 1.065 |
| 1149.0 | 1.065 |
| 1150.0 | 1.065 |
| 1151.0 | 1.065 |
| 1152.0 | 1.065 |
| 1153.0 | 1.065 |
| 1154.0 | 1.065 |
| 1155.0 | 1.065 |
| 1156.0 | 1.065 |
| 1157.0 | 1.065 |
| 1158.0 | 1.065 |
| 1159.0 | 1.065 |
| 1160.0 | 1.065 |
| 1161.0 | 1.065 |
| 1162.0 | 1.065 |
| 1163.0 | 1.065 |
| 1164.0 | 1.065 |
| 1165.0 | 1.065 |
| 1166.0 | 1.065 |
| 1167.0 | 1.065 |
| 1168.0 | 1.065 |
| 1169.0 | 1.065 |
| 1170.0 | 1.065 |
| 1171.0 | 1.065 |
| 1172.0 | 1.065 |
| 1173.0 | 1.065 |
| 1174.0 | 1.065 |
| 1175.0 | 1.065 |
| 1176.0 | 1.065 |
| 1177.0 | 1.065 |
| 1178.0 | 1.065 |
| 1179.0 | 1.065 |
| 1180.0 | 1.066 |
| 1181.0 | 1.066 |
| 1182.0 | 1.066 |
| 1183.0 | 1.066 |
| 1184.0 | 1.066 |
| 1185.0 | 1.066 |
| 1186.0 | 1.066 |
| 1187.0 | 1.066 |
| 1188.0 | 1.066 |
| 1189.0 | 1.066 |
| 1190.0 | 1.066 |
| 1191.0 | 1.066 |
| 1192.0 | 1.066 |
| 1193.0 | 1.066 |
| 1194.0 | 1.066 |
| 1195.0 | 1.066 |
| 1196.0 | 1.066 |
| 1197.0 | 1.066 |
| 1198.0 | 1.066 |
| 1199.0 | 1.066 |
| 1200.0 | 1.066 |
| 1201.0 | 1.066 |
| 1202.0 | 1.066 |
| 1203.0 | 1.066 |
| 1204.0 | 1.066 |
| 1205.0 | 1.066 |
| 1206.0 | 1.066 |
| 1207.0 | 1.066 |
| 1208.0 | 1.066 |
| 1209.0 | 1.066 |
| 1210.0 | 1.066 |
| 1211.0 | 1.066 |
| 1212.0 | 1.066 |
| 1213.0 | 1.066 |
| 1214.0 | 1.066 |
| 1215.0 | 1.066 |
| 1216.0 | 1.066 |
| 1217.0 | 1.066 |
| 1218.0 | 1.066 |
| 1219.0 | 1.066 |
| 1220.0 | 1.066 |
| 1221.0 | 1.066 |
| 1222.0 | 1.066 |
| 1223.0 | 1.066 |
| 1224.0 | 1.066 |
| 1225.0 | 1.066 |
| 1226.0 | 1.066 |
| 1227.0 | 1.066 |
| 1228.0 | 1.066 |
| 1229.0 | 1.066 |
| 1230.0 | 1.066 |
| 1231.0 | 1.066 |
| 1232.0 | 1.066 |
| 1233.0 | 1.066 |
| 1234.0 | 1.066 |
| 1235.0 | 1.066 |
| 1236.0 | 1.066 |
| 1237.0 | 1.066 |
| 1238.0 | 1.066 |
| 1239.0 | 1.066 |
| 1240.0 | 1.066 |
| 1241.0 | 1.066 |
| 1242.0 | 1.066 |
| 1243.0 | 1.066 |
| 1244.0 | 1.066 |
| 1245.0 | 1.066 |
| 1246.0 | 1.066 |
| 1247.0 | 1.066 |
| 1248.0 | 1.066 |
| 1249.0 | 1.066 |
| 1250.0 | 1.066 |
| 1251.0 | 1.066 |
| 1252.0 | 1.066 |
| 1253.0 | 1.066 |
| 1254.0 | 1.066 |
| 1255.0 | 1.066 |
| 1256.0 | 1.066 |
| 1257.0 | 1.066 |
| 1258.0 | 1.066 |
| 1259.0 | 1.066 |
| 1260.0 | 1.066 |
| 1261.0 | 1.066 |
| 1262.0 | 1.066 |
| 1263.0 | 1.066 |
| 1264.0 | 1.066 |
| 1265.0 | 1.066 |
| 1266.0 | 1.066 |
| 1267.0 | 1.066 |
| 1268.0 | 1.066 |
| 1269.0 | 1.066 |
| 1270.0 | 1.066 |
| 1271.0 | 1.066 |
| 1272.0 | 1.066 |
| 1273.0 | 1.066 |
| 1274.0 | 1.066 |
| 1275.0 | 1.066 |
| 1276.0 | 1.066 |
| 1277.0 | 1.066 |
| 1278.0 | 1.066 |
| 1279.0 | 1.066 |
| 1280.0 | 1.066 |
| 1281.0 | 1.066 |
| 1282.0 | 1.066 |
| 1283.0 | 1.066 |
| 1284.0 | 1.066 |
| 1285.0 | 1.066 |
| 1286.0 | 1.066 |
| 1287.0 | 1.066 |
| 1288.0 | 1.066 |
| 1289.0 | 1.066 |
| 1290.0 | 1.066 |
| 1291.0 | 1.066 |
| 1292.0 | 1.066 |
| 1293.0 | 1.066 |
| 1294.0 | 1.066 |
| 1295.0 | 1.066 |
| 1296.0 | 1.066 |
| 1297.0 | 1.066 |
| 1298.0 | 1.066 |
| 1299.0 | 1.066 |
| 1300.0 | 1.066 |
| 1301.0 | 1.066 |
| 1302.0 | 1.066 |
| 1303.0 | 1.066 |
| 1304.0 | 1.066 |
| 1305.0 | 1.066 |
| 1306.0 | 1.066 |
| 1307.0 | 1.066 |
| 1308.0 | 1.066 |
| 1309.0 | 1.066 |
| 1310.0 | 1.066 |
| 1311.0 | 1.066 |
| 1312.0 | 1.066 |
| 1313.0 | 1.066 |
| 1314.0 | 1.066 |
| 1315.0 | 1.066 |
| 1316.0 | 1.066 |
| 1317.0 | 1.066 |
| 1318.0 | 1.066 |
| 1319.0 | 1.066 |
| 1320.0 | 1.066 |
| 1321.0 | 1.066 |
| 1322.0 | 1.066 |
| 1323.0 | 1.066 |
| 1324.0 | 1.066 |
| 1325.0 | 1.066 |
| 1326.0 | 1.066 |
| 1327.0 | 1.066 |
| 1328.0 | 1.066 |
| 1329.0 | 1.066 |
| 1330.0 | 1.066 |
| 1331.0 | 1.066 |
| 1332.0 | 1.066 |
| 1333.0 | 1.066 |
| 1334.0 | 1.066 |
| 1335.0 | 1.066 |
| 1336.0 | 1.066 |
| 1337.0 | 1.066 |
| 1338.0 | 1.066 |
| 1339.0 | 1.066 |
| 1340.0 | 1.066 |
| 1341.0 | 1.066 |
| 1342.0 | 1.066 |
| 1343.0 | 1.066 |
| 1344.0 | 1.066 |
| 1345.0 | 1.066 |
| 1346.0 | 1.066 |
| 1347.0 | 1.066 |
| 1348.0 | 1.066 |
| 1349.0 | 1.066 |
| 1350.0 | 1.066 |
| 1351.0 | 1.066 |
| 1352.0 | 1.066 |
| 1353.0 | 1.066 |
| 1354.0 | 1.066 |
| 1355.0 | 1.066 |
| 1356.0 | 1.066 |
| 1357.0 | 1.066 |
| 1358.0 | 1.066 |
| 1359.0 | 1.066 |
| 1360.0 | 1.066 |
| 1361.0 | 1.066 |
| 1362.0 | 1.066 |
| 1363.0 | 1.066 |
| 1364.0 | 1.066 |
| 1365.0 | 1.066 |
| 1366.0 | 1.066 |
| 1367.0 | 1.066 |
| 1368.0 | 1.066 |
| 1369.0 | 1.066 |
| 1370.0 | 1.066 |
| 1371.0 | 1.066 |
| 1372.0 | 1.066 |
| 1373.0 | 1.066 |
| 1374.0 | 1.066 |
| 1375.0 | 1.066 |
| 1376.0 | 1.066 |
| 1377.0 | 1.066 |
| 1378.0 | 1.066 |
| 1379.0 | 1.066 |
| 1380.0 | 1.066 |
| 1381.0 | 1.066 |
| 1382.0 | 1.066 |
| 1383.0 | 1.066 |
| 1384.0 | 1.066 |
| 1385.0 | 1.066 |
| 1386.0 | 1.066 |
| 1387.0 | 1.066 |
| 1388.0 | 1.066 |
| 1389.0 | 1.066 |
| 1390.0 | 1.066 |
| 1391.0 | 1.066 |
| 1392.0 | 1.066 |
| 1393.0 | 1.066 |
| 1394.0 | 1.066 |
| 1395.0 | 1.066 |
| 1396.0 | 1.066 |
| 1397.0 | 1.066 |
| 1398.0 | 1.067 |
| 1399.0 | 1.067 |
| 1400.0 | 1.067 |
| 1401.0 | 1.067 |
| 1402.0 | 1.067 |
| 1403.0 | 1.067 |
| 1404.0 | 1.067 |
| 1405.0 | 1.067 |
| 1406.0 | 1.067 |
| 1407.0 | 1.067 |
| 1408.0 | 1.067 |
| 1409.0 | 1.067 |
| 1410.0 | 1.067 |
| 1411.0 | 1.067 |
| 1412.0 | 1.067 |
| 1413.0 | 1.067 |
| 1414.0 | 1.067 |
| 1415.0 | 1.067 |
| 1416.0 | 1.067 |
| 1417.0 | 1.067 |
| 1418.0 | 1.067 |
| 1419.0 | 1.067 |
| 1420.0 | 1.067 |
| 1421.0 | 1.067 |
| 1422.0 | 1.067 |
| 1423.0 | 1.067 |
| 1424.0 | 1.067 |
| 1425.0 | 1.067 |
| 1426.0 | 1.067 |
| 1427.0 | 1.067 |
| 1428.0 | 1.067 |
| 1429.0 | 1.067 |
| 1430.0 | 1.067 |
| 1431.0 | 1.067 |
| 1432.0 | 1.067 |
| 1433.0 | 1.067 |
| 1434.0 | 1.067 |
| 1435.0 | 1.067 |
| 1436.0 | 1.067 |
| 1437.0 | 1.067 |
| 1438.0 | 1.067 |
| 1439.0 | 1.067 |
| 1440.0 | 1.067 |
| 1441.0 | 1.067 |
| 1442.0 | 1.067 |
| 1443.0 | 1.067 |
| 1444.0 | 1.067 |
| 1445.0 | 1.067 |
| 1446.0 | 1.067 |
| 1447.0 | 1.067 |
| 1448.0 | 1.067 |
| 1449.0 | 1.067 |
| 1450.0 | 1.067 |
| 1451.0 | 1.067 |
| 1452.0 | 1.067 |
| 1453.0 | 1.067 |
| 1454.0 | 1.067 |
| 1455.0 | 1.067 |
| 1456.0 | 1.067 |
| 1457.0 | 1.067 |
| 1458.0 | 1.067 |
| 1459.0 | 1.067 |
| 1460.0 | 1.067 |
| 1461.0 | 1.067 |
| 1462.0 | 1.067 |
| 1463.0 | 1.067 |
| 1464.0 | 1.067 |
| 1465.0 | 1.067 |
| 1466.0 | 1.067 |
| 1467.0 | 1.067 |
| 1468.0 | 1.067 |
| 1469.0 | 1.067 |
| 1470.0 | 1.067 |
| 1471.0 | 1.067 |
| 1472.0 | 1.067 |
| 1473.0 | 1.067 |
| 1474.0 | 1.067 |
| 1475.0 | 1.067 |
| 1476.0 | 1.067 |
| 1477.0 | 1.067 |
| 1478.0 | 1.067 |
| 1479.0 | 1.067 |
| 1480.0 | 1.067 |
| 1481.0 | 1.067 |
| 1482.0 | 1.067 |
| 1483.0 | 1.067 |
| 1484.0 | 1.067 |
| 1485.0 | 1.067 |
| 1486.0 | 1.067 |
| 1487.0 | 1.067 |
| 1488.0 | 1.067 |
| 1489.0 | 1.067 |
| 1490.0 | 1.067 |
| 1491.0 | 1.067 |
| 1492.0 | 1.067 |
| 1493.0 | 1.067 |
| 1494.0 | 1.067 |
| 1495.0 | 1.067 |
| 1496.0 | 1.067 |
| 1497.0 | 1.067 |
| 1498.0 | 1.067 |
| 1499.0 | 1.067 |
| 1500.0 | 1.067 |
| 1501.0 | 1.067 |
| 1502.0 | 1.067 |
| 1503.0 | 1.067 |
| 1504.0 | 1.067 |
| 1505.0 | 1.067 |
| 1506.0 | 1.067 |
| 1507.0 | 1.067 |
| 1508.0 | 1.067 |
| 1509.0 | 1.067 |
| 1510.0 | 1.067 |
| 1511.0 | 1.067 |
| 1512.0 | 1.067 |
| 1513.0 | 1.067 |
| 1514.0 | 1.067 |
| 1515.0 | 1.067 |
| 1516.0 | 1.067 |
| 1517.0 | 1.067 |
| 1518.0 | 1.067 |
| 1519.0 | 1.067 |
| 1520.0 | 1.067 |
| 1521.0 | 1.067 |
| 1522.0 | 1.067 |
| 1523.0 | 1.067 |
| 1524.0 | 1.067 |
| 1525.0 | 1.067 |
| 1526.0 | 1.067 |
| 1527.0 | 1.067 |
| 1528.0 | 1.067 |
| 1529.0 | 1.067 |
| 1530.0 | 1.067 |
| 1531.0 | 1.067 |
| 1532.0 | 1.067 |
| 1533.0 | 1.067 |
| 1534.0 | 1.067 |
| 1535.0 | 1.067 |
| 1536.0 | 1.067 |
| 1537.0 | 1.067 |
| 1538.0 | 1.067 |
| 1539.0 | 1.067 |
| 1540.0 | 1.067 |
| 1541.0 | 1.067 |
| 1542.0 | 1.067 |
| 1543.0 | 1.067 |
| 1544.0 | 1.067 |
| 1545.0 | 1.067 |
| 1546.0 | 1.067 |
| 1547.0 | 1.067 |
| 1548.0 | 1.067 |
| 1549.0 | 1.067 |
| 1550.0 | 1.067 |
| 1551.0 | 1.067 |
| 1552.0 | 1.067 |
| 1553.0 | 1.067 |
| 1554.0 | 1.067 |
| 1555.0 | 1.067 |
| 1556.0 | 1.067 |
| 1557.0 | 1.067 |
| 1558.0 | 1.067 |
| 1559.0 | 1.067 |
| 1560.0 | 1.067 |
| 1561.0 | 1.067 |
| 1562.0 | 1.067 |
| 1563.0 | 1.067 |
| 1564.0 | 1.067 |
| 1565.0 | 1.067 |
| 1566.0 | 1.067 |
| 1567.0 | 1.067 |
| 1568.0 | 1.067 |
| 1569.0 | 1.067 |
| 1570.0 | 1.067 |
| 1571.0 | 1.067 |
| 1572.0 | 1.067 |
| 1573.0 | 1.067 |
| 1574.0 | 1.067 |
| 1575.0 | 1.067 |
| 1576.0 | 1.067 |
| 1577.0 | 1.067 |
| 1578.0 | 1.067 |
| 1579.0 | 1.067 |
| 1580.0 | 1.067 |
| 1581.0 | 1.067 |
| 1582.0 | 1.067 |
| 1583.0 | 1.067 |
| 1584.0 | 1.067 |
| 1585.0 | 1.067 |
| 1586.0 | 1.067 |
| 1587.0 | 1.067 |
| 1588.0 | 1.067 |
| 1589.0 | 1.067 |
| 1590.0 | 1.067 |
| 1591.0 | 1.067 |
| 1592.0 | 1.067 |
| 1593.0 | 1.067 |
| 1594.0 | 1.067 |
| 1595.0 | 1.067 |
| 1596.0 | 1.067 |
| 1597.0 | 1.067 |
| 1598.0 | 1.067 |
| 1599.0 | 1.067 |
| 1600.0 | 1.067 |
| 1601.0 | 1.067 |
| 1602.0 | 1.067 |
| 1603.0 | 1.067 |
| 1604.0 | 1.067 |
| 1605.0 | 1.067 |
| 1606.0 | 1.067 |
| 1607.0 | 1.067 |
| 1608.0 | 1.067 |
| 1609.0 | 1.067 |
| 1610.0 | 1.067 |
| 1611.0 | 1.067 |
| 1612.0 | 1.067 |
| 1613.0 | 1.067 |
| 1614.0 | 1.067 |
| 1615.0 | 1.067 |
| 1616.0 | 1.067 |
| 1617.0 | 1.067 |
| 1618.0 | 1.067 |
| 1619.0 | 1.067 |
| 1620.0 | 1.067 |
| 1621.0 | 1.067 |
| 1622.0 | 1.067 |
| 1623.0 | 1.067 |
| 1624.0 | 1.067 |
| 1625.0 | 1.067 |
| 1626.0 | 1.067 |
| 1627.0 | 1.067 |
| 1628.0 | 1.067 |
| 1629.0 | 1.067 |
| 1630.0 | 1.067 |
| 1631.0 | 1.067 |
| 1632.0 | 1.067 |
| 1633.0 | 1.067 |
| 1634.0 | 1.067 |
| 1635.0 | 1.067 |
| 1636.0 | 1.067 |
| 1637.0 | 1.067 |
| 1638.0 | 1.067 |
| 1639.0 | 1.067 |
| 1640.0 | 1.067 |
| 1641.0 | 1.067 |
| 1642.0 | 1.067 |
| 1643.0 | 1.067 |
| 1644.0 | 1.067 |
| 1645.0 | 1.067 |
| 1646.0 | 1.067 |
| 1647.0 | 1.067 |
| 1648.0 | 1.067 |
| 1649.0 | 1.067 |
| 1650.0 | 1.067 |
| 1651.0 | 1.067 |
| 1652.0 | 1.067 |
| 1653.0 | 1.067 |
| 1654.0 | 1.067 |
| 1655.0 | 1.067 |
| 1656.0 | 1.067 |
| 1657.0 | 1.067 |
| 1658.0 | 1.067 |
| 1659.0 | 1.067 |
| 1660.0 | 1.067 |
| 1661.0 | 1.067 |
| 1662.0 | 1.067 |
| 1663.0 | 1.067 |
| 1664.0 | 1.067 |
| 1665.0 | 1.067 |
| 1666.0 | 1.067 |
| 1667.0 | 1.067 |
| 1668.0 | 1.067 |
| 1669.0 | 1.067 |
| 1670.0 | 1.067 |
| 1671.0 | 1.067 |
| 1672.0 | 1.067 |
| 1673.0 | 1.067 |
| 1674.0 | 1.067 |
| 1675.0 | 1.067 |
| 1676.0 | 1.067 |
| 1677.0 | 1.067 |
| 1678.0 | 1.067 |
| 1679.0 | 1.067 |
| 1680.0 | 1.067 |
| 1681.0 | 1.068 |
| 1682.0 | 1.068 |
| 1683.0 | 1.068 |
| 1684.0 | 1.068 |
| 1685.0 | 1.068 |
| 1686.0 | 1.068 |
| 1687.0 | 1.068 |
| 1688.0 | 1.068 |
| 1689.0 | 1.068 |
| 1690.0 | 1.068 |
| 1691.0 | 1.068 |
| 1692.0 | 1.068 |
| 1693.0 | 1.068 |
| 1694.0 | 1.068 |
| 1695.0 | 1.068 |
| 1696.0 | 1.068 |
| 1697.0 | 1.068 |
| 1698.0 | 1.068 |
| 1699.0 | 1.068 |
| 1700.0 | 1.068 |
| 1701.0 | 1.068 |
| 1702.0 | 1.068 |
| 1703.0 | 1.068 |
| 1704.0 | 1.068 |
| 1705.0 | 1.068 |
| 1706.0 | 1.068 |
| 1707.0 | 1.068 |
| 1708.0 | 1.068 |
| 1709.0 | 1.068 |
| 1710.0 | 1.068 |
| 1711.0 | 1.068 |
| 1712.0 | 1.068 |
| 1713.0 | 1.068 |
| 1714.0 | 1.068 |
| 1715.0 | 1.068 |
| 1716.0 | 1.068 |
| 1717.0 | 1.068 |
| 1718.0 | 1.068 |
| 1719.0 | 1.068 |
| 1720.0 | 1.068 |
| 1721.0 | 1.068 |
| 1722.0 | 1.068 |
| 1723.0 | 1.068 |
| 1724.0 | 1.068 |
| 1725.0 | 1.068 |
| 1726.0 | 1.068 |
| 1727.0 | 1.068 |
| 1728.0 | 1.068 |
| 1729.0 | 1.068 |
| 1730.0 | 1.068 |
| 1731.0 | 1.068 |
| 1732.0 | 1.068 |
| 1733.0 | 1.068 |
| 1734.0 | 1.068 |
| 1735.0 | 1.068 |
| 1736.0 | 1.068 |
| 1737.0 | 1.068 |
| 1738.0 | 1.068 |
| 1739.0 | 1.068 |
| 1740.0 | 1.068 |
| 1741.0 | 1.068 |
| 1742.0 | 1.068 |
| 1743.0 | 1.068 |
| 1744.0 | 1.068 |
| 1745.0 | 1.068 |
| 1746.0 | 1.068 |
| 1747.0 | 1.068 |
| 1748.0 | 1.068 |
| 1749.0 | 1.068 |
| 1750.0 | 1.068 |
| 1751.0 | 1.068 |
| 1752.0 | 1.068 |
| 1753.0 | 1.068 |
| 1754.0 | 1.068 |
| 1755.0 | 1.068 |
| 1756.0 | 1.068 |
| 1757.0 | 1.068 |
| 1758.0 | 1.068 |
| 1759.0 | 1.068 |
| 1760.0 | 1.068 |
| 1761.0 | 1.068 |
| 1762.0 | 1.068 |
| 1763.0 | 1.068 |
| 1764.0 | 1.068 |
| 1765.0 | 1.068 |
| 1766.0 | 1.068 |
| 1767.0 | 1.068 |
| 1768.0 | 1.068 |
| 1769.0 | 1.068 |
| 1770.0 | 1.068 |
| 1771.0 | 1.068 |
| 1772.0 | 1.068 |
| 1773.0 | 1.068 |
| 1774.0 | 1.068 |
| 1775.0 | 1.068 |
| 1776.0 | 1.068 |
| 1777.0 | 1.068 |
| 1778.0 | 1.068 |
| 1779.0 | 1.068 |
| 1780.0 | 1.068 |
| 1781.0 | 1.068 |
| 1782.0 | 1.068 |
| 1783.0 | 1.068 |
| 1784.0 | 1.068 |
| 1785.0 | 1.068 |
| 1786.0 | 1.068 |
| 1787.0 | 1.068 |
| 1788.0 | 1.068 |
| 1789.0 | 1.068 |
| 1790.0 | 1.068 |
| 1791.0 | 1.068 |
| 1792.0 | 1.068 |
| 1793.0 | 1.068 |
| 1794.0 | 1.068 |
| 1795.0 | 1.068 |
| 1796.0 | 1.068 |
| 1797.0 | 1.068 |
| 1798.0 | 1.068 |
| 1799.0 | 1.068 |
| 1800.0 | 1.068 |
| 1801.0 | 1.068 |
| 1802.0 | 1.068 |
| 1803.0 | 1.068 |
| 1804.0 | 1.068 |
| 1805.0 | 1.068 |
| 1806.0 | 1.068 |
| 1807.0 | 1.068 |
| 1808.0 | 1.068 |
| 1809.0 | 1.068 |
| 1810.0 | 1.068 |
| 1811.0 | 1.068 |
| 1812.0 | 1.068 |
| 1813.0 | 1.068 |
| 1814.0 | 1.068 |
| 1815.0 | 1.068 |
| 1816.0 | 1.068 |
| 1817.0 | 1.068 |
| 1818.0 | 1.068 |
| 1819.0 | 1.068 |
| 1820.0 | 1.068 |
| 1821.0 | 1.068 |
| 1822.0 | 1.068 |
| 1823.0 | 1.068 |
| 1824.0 | 1.068 |
| 1825.0 | 1.068 |
| 1826.0 | 1.068 |
| 1827.0 | 1.068 |
| 1828.0 | 1.068 |
| 1829.0 | 1.068 |
| 1830.0 | 1.068 |
| 1831.0 | 1.068 |
| 1832.0 | 1.068 |
| 1833.0 | 1.068 |
| 1834.0 | 1.068 |
| 1835.0 | 1.068 |
| 1836.0 | 1.068 |
| 1837.0 | 1.068 |
| 1838.0 | 1.068 |
| 1839.0 | 1.068 |
| 1840.0 | 1.068 |
| 1841.0 | 1.068 |
| 1842.0 | 1.068 |
| 1843.0 | 1.068 |
| 1844.0 | 1.068 |
| 1845.0 | 1.068 |
| 1846.0 | 1.068 |
| 1847.0 | 1.068 |
| 1848.0 | 1.068 |
| 1849.0 | 1.068 |
| 1850.0 | 1.068 |
| 1851.0 | 1.068 |
| 1852.0 | 1.068 |
| 1853.0 | 1.068 |
| 1854.0 | 1.068 |
| 1855.0 | 1.068 |
| 1856.0 | 1.068 |
| 1857.0 | 1.068 |
| 1858.0 | 1.068 |
| 1859.0 | 1.068 |
| 1860.0 | 1.068 |
| 1861.0 | 1.068 |
| 1862.0 | 1.068 |
| 1863.0 | 1.068 |
| 1864.0 | 1.068 |
| 1865.0 | 1.068 |
| 1866.0 | 1.068 |
| 1867.0 | 1.068 |
| 1868.0 | 1.068 |
| 1869.0 | 1.068 |
| 1870.0 | 1.068 |
| 1871.0 | 1.068 |
| 1872.0 | 1.068 |
| 1873.0 | 1.068 |
| 1874.0 | 1.068 |
| 1875.0 | 1.068 |
| 1876.0 | 1.068 |
| 1877.0 | 1.068 |
| 1878.0 | 1.068 |
| 1879.0 | 1.068 |
| 1880.0 | 1.068 |
| 1881.0 | 1.068 |
| 1882.0 | 1.068 |
| 1883.0 | 1.068 |
| 1884.0 | 1.068 |
| 1885.0 | 1.068 |
| 1886.0 | 1.068 |
| 1887.0 | 1.068 |
| 1888.0 | 1.068 |
| 1889.0 | 1.068 |
| 1890.0 | 1.068 |
| 1891.0 | 1.068 |
| 1892.0 | 1.068 |
| 1893.0 | 1.068 |
| 1894.0 | 1.068 |
| 1895.0 | 1.068 |
| 1896.0 | 1.068 |
| 1897.0 | 1.068 |
| 1898.0 | 1.068 |
| 1899.0 | 1.068 |
| 1900.0 | 1.068 |
| 1901.0 | 1.068 |
| 1902.0 | 1.068 |
| 1903.0 | 1.068 |
| 1904.0 | 1.068 |
| 1905.0 | 1.068 |
| 1906.0 | 1.068 |
| 1907.0 | 1.068 |
| 1908.0 | 1.068 |
| 1909.0 | 1.068 |
| 1910.0 | 1.068 |
| 1911.0 | 1.068 |
| 1912.0 | 1.068 |
| 1913.0 | 1.068 |
| 1914.0 | 1.068 |
| 1915.0 | 1.068 |
| 1916.0 | 1.068 |
| 1917.0 | 1.068 |
| 1918.0 | 1.068 |
| 1919.0 | 1.068 |
| 1920.0 | 1.068 |
| 1921.0 | 1.068 |
| 1922.0 | 1.068 |
| 1923.0 | 1.068 |
| 1924.0 | 1.068 |
| 1925.0 | 1.068 |
| 1926.0 | 1.068 |
| 1927.0 | 1.068 |
| 1928.0 | 1.068 |
| 1929.0 | 1.068 |
| 1930.0 | 1.068 |
| 1931.0 | 1.068 |
| 1932.0 | 1.068 |
| 1933.0 | 1.068 |
| 1934.0 | 1.068 |
| 1935.0 | 1.068 |
| 1936.0 | 1.068 |
| 1937.0 | 1.068 |
| 1938.0 | 1.068 |
| 1939.0 | 1.068 |
| 1940.0 | 1.068 |
| 1941.0 | 1.068 |
| 1942.0 | 1.068 |
| 1943.0 | 1.068 |
| 1944.0 | 1.068 |
| 1945.0 | 1.068 |
| 1946.0 | 1.068 |
| 1947.0 | 1.068 |
| 1948.0 | 1.068 |
| 1949.0 | 1.068 |
| 1950.0 | 1.068 |
| 1951.0 | 1.068 |
| 1952.0 | 1.068 |
| 1953.0 | 1.068 |
| 1954.0 | 1.068 |
| 1955.0 | 1.068 |
| 1956.0 | 1.068 |
| 1957.0 | 1.068 |
| 1958.0 | 1.068 |
| 1959.0 | 1.068 |
| 1960.0 | 1.068 |
| 1961.0 | 1.068 |
| 1962.0 | 1.068 |
| 1963.0 | 1.068 |
| 1964.0 | 1.068 |
| 1965.0 | 1.068 |
| 1966.0 | 1.068 |
| 1967.0 | 1.068 |
| 1968.0 | 1.068 |
| 1969.0 | 1.068 |
| 1970.0 | 1.068 |
| 1971.0 | 1.068 |
| 1972.0 | 1.068 |
| 1973.0 | 1.068 |
| 1974.0 | 1.068 |
| 1975.0 | 1.068 |
| 1976.0 | 1.068 |
| 1977.0 | 1.068 |
| 1978.0 | 1.068 |
| 1979.0 | 1.068 |
| 1980.0 | 1.068 |
| 1981.0 | 1.068 |
| 1982.0 | 1.068 |
| 1983.0 | 1.068 |
| 1984.0 | 1.068 |
| 1985.0 | 1.068 |
| 1986.0 | 1.068 |
| 1987.0 | 1.068 |
| 1988.0 | 1.068 |
| 1989.0 | 1.068 |
| 1990.0 | 1.068 |
| 1991.0 | 1.068 |
| 1992.0 | 1.068 |
| 1993.0 | 1.068 |
| 1994.0 | 1.068 |
| 1995.0 | 1.068 |
| 1996.0 | 1.068 |
| 1997.0 | 1.068 |
| 1998.0 | 1.068 |
| 1999.0 | 1.068 |
| 2000.0 | 1.068 |
| 2001.0 | 1.068 |
| 2002.0 | 1.068 |
| 2003.0 | 1.068 |
| 2004.0 | 1.068 |
| 2005.0 | 1.068 |
| 2006.0 | 1.068 |
| 2007.0 | 1.068 |
| 2008.0 | 1.068 |
| 2009.0 | 1.068 |
| 2010.0 | 1.068 |
| 2011.0 | 1.068 |
| 2012.0 | 1.068 |
| 2013.0 | 1.068 |
| 2014.0 | 1.068 |
| 2015.0 | 1.068 |
| 2016.0 | 1.068 |
| 2017.0 | 1.068 |
| 2018.0 | 1.068 |
| 2019.0 | 1.068 |
| 2020.0 | 1.068 |
| 2021.0 | 1.068 |
| 2022.0 | 1.068 |
| 2023.0 | 1.068 |
| 2024.0 | 1.068 |
| 2025.0 | 1.068 |
| 2026.0 | 1.068 |
| 2027.0 | 1.068 |
| 2028.0 | 1.068 |
| 2029.0 | 1.068 |
| 2030.0 | 1.068 |
| 2031.0 | 1.068 |
| 2032.0 | 1.068 |
| 2033.0 | 1.068 |
| 2034.0 | 1.068 |
| 2035.0 | 1.068 |
| 2036.0 | 1.068 |
| 2037.0 | 1.068 |
| 2038.0 | 1.068 |
| 2039.0 | 1.068 |
| 2040.0 | 1.068 |
| 2041.0 | 1.068 |
| 2042.0 | 1.068 |
| 2043.0 | 1.068 |
| 2044.0 | 1.068 |
| 2045.0 | 1.068 |
| 2046.0 | 1.068 |
| 2047.0 | 1.068 |
| 2048.0 | 1.068 |
| 2049.0 | 1.068 |
| 2050.0 | 1.068 |
| 2051.0 | 1.068 |
| 2052.0 | 1.068 |
| 2053.0 | 1.068 |
| 2054.0 | 1.068 |
| 2055.0 | 1.068 |
| 2056.0 | 1.068 |
| 2057.0 | 1.068 |
| 2058.0 | 1.068 |
| 2059.0 | 1.068 |
| 2060.0 | 1.069 |
| 2061.0 | 1.069 |
| 2062.0 | 1.069 |
| 2063.0 | 1.069 |
| 2064.0 | 1.069 |
| 2065.0 | 1.069 |
| 2066.0 | 1.069 |
| 2067.0 | 1.069 |
| 2068.0 | 1.069 |
| 2069.0 | 1.069 |
| 2070.0 | 1.069 |
| 2071.0 | 1.069 |
| 2072.0 | 1.069 |
| 2073.0 | 1.069 |
| 2074.0 | 1.069 |
| 2075.0 | 1.069 |
| 2076.0 | 1.069 |
| 2077.0 | 1.069 |
| 2078.0 | 1.069 |
| 2079.0 | 1.069 |
| 2080.0 | 1.069 |
| 2081.0 | 1.069 |
| 2082.0 | 1.069 |
| 2083.0 | 1.069 |
| 2084.0 | 1.069 |
| 2085.0 | 1.069 |
| 2086.0 | 1.069 |
| 2087.0 | 1.069 |
| 2088.0 | 1.069 |
| 2089.0 | 1.069 |
| 2090.0 | 1.069 |
| 2091.0 | 1.069 |
| 2092.0 | 1.069 |
| 2093.0 | 1.069 |
| 2094.0 | 1.069 |
| 2095.0 | 1.069 |
| 2096.0 | 1.069 |
| 2097.0 | 1.069 |
| 2098.0 | 1.069 |
| 2099.0 | 1.069 |
| 2100.0 | 1.069 |
| 2101.0 | 1.069 |
| 2102.0 | 1.069 |
| 2103.0 | 1.069 |
| 2104.0 | 1.069 |
| 2105.0 | 1.069 |
| 2106.0 | 1.069 |
| 2107.0 | 1.069 |
| 2108.0 | 1.069 |
| 2109.0 | 1.069 |
| 2110.0 | 1.069 |
| 2111.0 | 1.069 |
| 2112.0 | 1.069 |
| 2113.0 | 1.069 |
| 2114.0 | 1.069 |
| 2115.0 | 1.069 |
| 2116.0 | 1.069 |
| 2117.0 | 1.069 |
| 2118.0 | 1.069 |
| 2119.0 | 1.069 |
| 2120.0 | 1.069 |
| 2121.0 | 1.069 |
| 2122.0 | 1.069 |
| 2123.0 | 1.069 |
| 2124.0 | 1.069 |
| 2125.0 | 1.069 |
| 2126.0 | 1.069 |
| 2127.0 | 1.069 |
| 2128.0 | 1.069 |
| 2129.0 | 1.069 |
| 2130.0 | 1.069 |
| 2131.0 | 1.069 |
| 2132.0 | 1.069 |
| 2133.0 | 1.069 |
| 2134.0 | 1.069 |
| 2135.0 | 1.069 |
| 2136.0 | 1.069 |
| 2137.0 | 1.069 |
| 2138.0 | 1.069 |
| 2139.0 | 1.069 |
| 2140.0 | 1.069 |
| 2141.0 | 1.069 |
| 2142.0 | 1.069 |
| 2143.0 | 1.069 |
| 2144.0 | 1.069 |
| 2145.0 | 1.069 |
| 2146.0 | 1.069 |
| 2147.0 | 1.069 |
| 2148.0 | 1.069 |
| 2149.0 | 1.069 |
| 2150.0 | 1.069 |
| 2151.0 | 1.069 |
| 2152.0 | 1.069 |
| 2153.0 | 1.069 |
| 2154.0 | 1.069 |
| 2155.0 | 1.069 |
| 2156.0 | 1.069 |
| 2157.0 | 1.069 |
| 2158.0 | 1.069 |
| 2159.0 | 1.069 |
| 2160.0 | 1.069 |
| 2161.0 | 1.069 |
| 2162.0 | 1.069 |
| 2163.0 | 1.069 |
| 2164.0 | 1.069 |
| 2165.0 | 1.069 |
| 2166.0 | 1.069 |
| 2167.0 | 1.069 |
| 2168.0 | 1.069 |
| 2169.0 | 1.069 |
| 2170.0 | 1.069 |
| 2171.0 | 1.069 |
| 2172.0 | 1.069 |
| 2173.0 | 1.069 |
| 2174.0 | 1.069 |
| 2175.0 | 1.069 |
| 2176.0 | 1.069 |
| 2177.0 | 1.069 |
| 2178.0 | 1.069 |
| 2179.0 | 1.069 |
| 2180.0 | 1.069 |
| 2181.0 | 1.069 |
| 2182.0 | 1.069 |
| 2183.0 | 1.069 |
| 2184.0 | 1.069 |
| 2185.0 | 1.069 |
| 2186.0 | 1.069 |
| 2187.0 | 1.069 |
| 2188.0 | 1.069 |
| 2189.0 | 1.069 |
| 2190.0 | 1.069 |
| 2191.0 | 1.069 |
| 2192.0 | 1.069 |
| 2193.0 | 1.069 |
| 2194.0 | 1.069 |
| 2195.0 | 1.069 |
| 2196.0 | 1.069 |
| 2197.0 | 1.069 |
| 2198.0 | 1.069 |
| 2199.0 | 1.069 |
| 2200.0 | 1.069 |
| 2201.0 | 1.069 |
| 2202.0 | 1.069 |
| 2203.0 | 1.069 |
| 2204.0 | 1.069 |
| 2205.0 | 1.069 |
| 2206.0 | 1.069 |
| 2207.0 | 1.069 |
| 2208.0 | 1.069 |
| 2209.0 | 1.069 |
| 2210.0 | 1.069 |
| 2211.0 | 1.069 |
| 2212.0 | 1.069 |
| 2213.0 | 1.069 |
| 2214.0 | 1.069 |
| 2215.0 | 1.069 |
| 2216.0 | 1.069 |
| 2217.0 | 1.069 |
| 2218.0 | 1.069 |
| 2219.0 | 1.069 |
| 2220.0 | 1.069 |
| 2221.0 | 1.069 |
| 2222.0 | 1.069 |
| 2223.0 | 1.069 |
| 2224.0 | 1.069 |
| 2225.0 | 1.069 |
| 2226.0 | 1.069 |
| 2227.0 | 1.069 |
| 2228.0 | 1.069 |
| 2229.0 | 1.069 |
| 2230.0 | 1.069 |
| 2231.0 | 1.069 |
| 2232.0 | 1.069 |
| 2233.0 | 1.069 |
| 2234.0 | 1.069 |
| 2235.0 | 1.069 |
| 2236.0 | 1.069 |
| 2237.0 | 1.069 |
| 2238.0 | 1.069 |
| 2239.0 | 1.069 |
| 2240.0 | 1.069 |
| 2241.0 | 1.069 |
| 2242.0 | 1.069 |
| 2243.0 | 1.069 |
| 2244.0 | 1.069 |
| 2245.0 | 1.069 |
| 2246.0 | 1.069 |
| 2247.0 | 1.069 |
| 2248.0 | 1.069 |
| 2249.0 | 1.069 |
| 2250.0 | 1.069 |
| 2251.0 | 1.069 |
| 2252.0 | 1.069 |
| 2253.0 | 1.069 |
| 2254.0 | 1.069 |
| 2255.0 | 1.069 |
| 2256.0 | 1.069 |
| 2257.0 | 1.069 |
| 2258.0 | 1.069 |
| 2259.0 | 1.069 |
| 2260.0 | 1.069 |
| 2261.0 | 1.069 |
| 2262.0 | 1.069 |
| 2263.0 | 1.069 |
| 2264.0 | 1.069 |
| 2265.0 | 1.069 |
| 2266.0 | 1.069 |
| 2267.0 | 1.069 |
| 2268.0 | 1.069 |
| 2269.0 | 1.069 |
| 2270.0 | 1.069 |
| 2271.0 | 1.069 |
| 2272.0 | 1.069 |
| 2273.0 | 1.069 |
| 2274.0 | 1.069 |
| 2275.0 | 1.069 |
| 2276.0 | 1.069 |
| 2277.0 | 1.069 |
| 2278.0 | 1.069 |
| 2279.0 | 1.069 |
| 2280.0 | 1.069 |
| 2281.0 | 1.069 |
| 2282.0 | 1.069 |
| 2283.0 | 1.069 |
| 2284.0 | 1.069 |
| 2285.0 | 1.069 |
| 2286.0 | 1.069 |
| 2287.0 | 1.069 |
| 2288.0 | 1.069 |
| 2289.0 | 1.069 |
| 2290.0 | 1.069 |
| 2291.0 | 1.069 |
| 2292.0 | 1.069 |
| 2293.0 | 1.069 |
| 2294.0 | 1.069 |
| 2295.0 | 1.069 |
| 2296.0 | 1.069 |
| 2297.0 | 1.069 |
| 2298.0 | 1.069 |
| 2299.0 | 1.069 |
| 2300.0 | 1.069 |
| 2301.0 | 1.069 |
| 2302.0 | 1.069 |
| 2303.0 | 1.069 |
| 2304.0 | 1.069 |
| 2305.0 | 1.069 |
| 2306.0 | 1.069 |
| 2307.0 | 1.069 |
| 2308.0 | 1.069 |
| 2309.0 | 1.069 |
| 2310.0 | 1.069 |
| 2311.0 | 1.069 |
| 2312.0 | 1.069 |
| 2313.0 | 1.069 |
| 2314.0 | 1.069 |
| 2315.0 | 1.069 |
| 2316.0 | 1.069 |
| 2317.0 | 1.069 |
| 2318.0 | 1.069 |
| 2319.0 | 1.069 |
| 2320.0 | 1.069 |
| 2321.0 | 1.069 |
| 2322.0 | 1.069 |
| 2323.0 | 1.069 |
| 2324.0 | 1.069 |
| 2325.0 | 1.069 |
| 2326.0 | 1.069 |
| 2327.0 | 1.069 |
| 2328.0 | 1.069 |
| 2329.0 | 1.069 |
| 2330.0 | 1.069 |
| 2331.0 | 1.069 |
| 2332.0 | 1.069 |
| 2333.0 | 1.069 |
| 2334.0 | 1.069 |
| 2335.0 | 1.069 |
| 2336.0 | 1.069 |
| 2337.0 | 1.069 |
| 2338.0 | 1.069 |
| 2339.0 | 1.069 |
| 2340.0 | 1.069 |
| 2341.0 | 1.069 |
| 2342.0 | 1.069 |
| 2343.0 | 1.069 |
| 2344.0 | 1.069 |
| 2345.0 | 1.069 |
| 2346.0 | 1.069 |
| 2347.0 | 1.069 |
| 2348.0 | 1.069 |
| 2349.0 | 1.069 |
| 2350.0 | 1.069 |
| 2351.0 | 1.069 |
| 2352.0 | 1.069 |
| 2353.0 | 1.069 |
| 2354.0 | 1.069 |
| 2355.0 | 1.069 |
| 2356.0 | 1.069 |
| 2357.0 | 1.069 |
| 2358.0 | 1.069 |
| 2359.0 | 1.069 |
| 2360.0 | 1.069 |
| 2361.0 | 1.069 |
| 2362.0 | 1.069 |
| 2363.0 | 1.069 |
| 2364.0 | 1.069 |
| 2365.0 | 1.069 |
| 2366.0 | 1.069 |
| 2367.0 | 1.069 |
| 2368.0 | 1.069 |
| 2369.0 | 1.069 |
| 2370.0 | 1.069 |
| 2371.0 | 1.069 |
| 2372.0 | 1.069 |
| 2373.0 | 1.069 |
| 2374.0 | 1.069 |
| 2375.0 | 1.069 |
| 2376.0 | 1.069 |
| 2377.0 | 1.069 |
| 2378.0 | 1.069 |
| 2379.0 | 1.069 |
| 2380.0 | 1.069 |
| 2381.0 | 1.069 |
| 2382.0 | 1.069 |
| 2383.0 | 1.069 |
| 2384.0 | 1.069 |
| 2385.0 | 1.069 |
| 2386.0 | 1.069 |
| 2387.0 | 1.069 |
| 2388.0 | 1.069 |
| 2389.0 | 1.069 |
| 2390.0 | 1.069 |
| 2391.0 | 1.069 |
| 2392.0 | 1.069 |
| 2393.0 | 1.069 |
| 2394.0 | 1.069 |
| 2395.0 | 1.069 |
| 2396.0 | 1.069 |
| 2397.0 | 1.069 |
| 2398.0 | 1.069 |
| 2399.0 | 1.069 |
| 2400.0 | 1.069 |
| 2401.0 | 1.069 |
| 2402.0 | 1.069 |
| 2403.0 | 1.069 |
| 2404.0 | 1.069 |
| 2405.0 | 1.069 |
| 2406.0 | 1.069 |
| 2407.0 | 1.069 |
| 2408.0 | 1.069 |
| 2409.0 | 1.069 |
| 2410.0 | 1.069 |
| 2411.0 | 1.069 |
| 2412.0 | 1.069 |
| 2413.0 | 1.069 |
| 2414.0 | 1.069 |
| 2415.0 | 1.069 |
| 2416.0 | 1.069 |
| 2417.0 | 1.069 |
| 2418.0 | 1.069 |
| 2419.0 | 1.069 |
| 2420.0 | 1.069 |
| 2421.0 | 1.069 |
| 2422.0 | 1.069 |
| 2423.0 | 1.069 |
| 2424.0 | 1.069 |
| 2425.0 | 1.069 |
| 2426.0 | 1.069 |
| 2427.0 | 1.069 |
| 2428.0 | 1.069 |
| 2429.0 | 1.069 |
| 2430.0 | 1.069 |
| 2431.0 | 1.069 |
| 2432.0 | 1.069 |
| 2433.0 | 1.069 |
| 2434.0 | 1.069 |
| 2435.0 | 1.069 |
| 2436.0 | 1.069 |
| 2437.0 | 1.069 |
| 2438.0 | 1.069 |
| 2439.0 | 1.069 |
| 2440.0 | 1.069 |
| 2441.0 | 1.069 |
| 2442.0 | 1.069 |
| 2443.0 | 1.069 |
| 2444.0 | 1.069 |
| 2445.0 | 1.069 |
| 2446.0 | 1.069 |
| 2447.0 | 1.069 |
| 2448.0 | 1.069 |
| 2449.0 | 1.069 |
| 2450.0 | 1.069 |
| 2451.0 | 1.069 |
| 2452.0 | 1.069 |
| 2453.0 | 1.069 |
| 2454.0 | 1.069 |
| 2455.0 | 1.069 |
| 2456.0 | 1.069 |
| 2457.0 | 1.069 |
| 2458.0 | 1.069 |
| 2459.0 | 1.069 |
| 2460.0 | 1.069 |
| 2461.0 | 1.069 |
| 2462.0 | 1.069 |
| 2463.0 | 1.069 |
| 2464.0 | 1.069 |
| 2465.0 | 1.069 |
| 2466.0 | 1.069 |
| 2467.0 | 1.069 |
| 2468.0 | 1.069 |
| 2469.0 | 1.069 |
| 2470.0 | 1.069 |
| 2471.0 | 1.069 |
| 2472.0 | 1.069 |
| 2473.0 | 1.069 |
| 2474.0 | 1.069 |
| 2475.0 | 1.069 |
| 2476.0 | 1.069 |
| 2477.0 | 1.069 |
| 2478.0 | 1.069 |
| 2479.0 | 1.069 |
| 2480.0 | 1.069 |
| 2481.0 | 1.069 |
| 2482.0 | 1.069 |
| 2483.0 | 1.069 |
| 2484.0 | 1.069 |
| 2485.0 | 1.069 |
| 2486.0 | 1.069 |
| 2487.0 | 1.069 |
| 2488.0 | 1.069 |
| 2489.0 | 1.069 |
| 2490.0 | 1.069 |
| 2491.0 | 1.069 |
| 2492.0 | 1.069 |
| 2493.0 | 1.069 |
| 2494.0 | 1.069 |
| 2495.0 | 1.069 |
| 2496.0 | 1.069 |
| 2497.0 | 1.069 |
| 2498.0 | 1.069 |
| 2499.0 | 1.069 |
| 2500.0 | 1.069 |
| 2501.0 | 1.069 |
| 2502.0 | 1.069 |
| 2503.0 | 1.069 |
| 2504.0 | 1.069 |
| 2505.0 | 1.069 |
| 2506.0 | 1.069 |
| 2507.0 | 1.069 |
| 2508.0 | 1.069 |
| 2509.0 | 1.069 |
| 2510.0 | 1.069 |
| 2511.0 | 1.069 |
| 2512.0 | 1.069 |
| 2513.0 | 1.069 |
| 2514.0 | 1.069 |
| 2515.0 | 1.069 |
| 2516.0 | 1.069 |
| 2517.0 | 1.069 |
| 2518.0 | 1.069 |
| 2519.0 | 1.069 |
| 2520.0 | 1.069 |
| 2521.0 | 1.069 |
| 2522.0 | 1.069 |
| 2523.0 | 1.069 |
| 2524.0 | 1.069 |
| 2525.0 | 1.069 |
| 2526.0 | 1.069 |
| 2527.0 | 1.069 |
| 2528.0 | 1.069 |
| 2529.0 | 1.069 |
| 2530.0 | 1.069 |
| 2531.0 | 1.069 |
| 2532.0 | 1.069 |
| 2533.0 | 1.069 |
| 2534.0 | 1.069 |
| 2535.0 | 1.069 |
| 2536.0 | 1.069 |
| 2537.0 | 1.069 |
| 2538.0 | 1.069 |
| 2539.0 | 1.069 |
| 2540.0 | 1.069 |
| 2541.0 | 1.069 |
| 2542.0 | 1.069 |
| 2543.0 | 1.069 |
| 2544.0 | 1.069 |
| 2545.0 | 1.069 |
| 2546.0 | 1.069 |
| 2547.0 | 1.069 |
| 2548.0 | 1.069 |
| 2549.0 | 1.069 |
| 2550.0 | 1.069 |
| 2551.0 | 1.069 |
| 2552.0 | 1.069 |
| 2553.0 | 1.069 |
| 2554.0 | 1.069 |
| 2555.0 | 1.069 |
| 2556.0 | 1.069 |
| 2557.0 | 1.069 |
| 2558.0 | 1.069 |
| 2559.0 | 1.069 |
| 2560.0 | 1.069 |
| 2561.0 | 1.069 |
| 2562.0 | 1.069 |
| 2563.0 | 1.069 |
| 2564.0 | 1.069 |
| 2565.0 | 1.069 |
| 2566.0 | 1.069 |
| 2567.0 | 1.069 |
| 2568.0 | 1.069 |
| 2569.0 | 1.069 |
| 2570.0 | 1.069 |
| 2571.0 | 1.069 |
| 2572.0 | 1.069 |
| 2573.0 | 1.069 |
| 2574.0 | 1.069 |
| 2575.0 | 1.069 |
| 2576.0 | 1.069 |
| 2577.0 | 1.069 |
| 2578.0 | 1.069 |
| 2579.0 | 1.069 |
| 2580.0 | 1.069 |
| 2581.0 | 1.069 |
| 2582.0 | 1.069 |
| 2583.0 | 1.07 |
| 2584.0 | 1.07 |
| 2585.0 | 1.07 |
| 2586.0 | 1.07 |
| 2587.0 | 1.07 |
| 2588.0 | 1.07 |
| 2589.0 | 1.07 |
| 2590.0 | 1.07 |
| 2591.0 | 1.07 |
| 2592.0 | 1.07 |
| 2593.0 | 1.07 |
| 2594.0 | 1.07 |
| 2595.0 | 1.07 |
| 2596.0 | 1.07 |
| 2597.0 | 1.07 |
| 2598.0 | 1.07 |
| 2599.0 | 1.07 |
| 2600.0 | 1.07 |
| 2601.0 | 1.07 |
| 2602.0 | 1.07 |
| 2603.0 | 1.07 |
| 2604.0 | 1.07 |
| 2605.0 | 1.07 |
| 2606.0 | 1.07 |
| 2607.0 | 1.07 |
| 2608.0 | 1.07 |
| 2609.0 | 1.07 |
| 2610.0 | 1.07 |
| 2611.0 | 1.07 |
| 2612.0 | 1.07 |
| 2613.0 | 1.07 |
| 2614.0 | 1.07 |
| 2615.0 | 1.07 |
| 2616.0 | 1.07 |
| 2617.0 | 1.07 |
| 2618.0 | 1.07 |
| 2619.0 | 1.07 |
| 2620.0 | 1.07 |
| 2621.0 | 1.07 |
| 2622.0 | 1.07 |
| 2623.0 | 1.07 |
| 2624.0 | 1.07 |
| 2625.0 | 1.07 |
| 2626.0 | 1.07 |
| 2627.0 | 1.07 |
| 2628.0 | 1.07 |
| 2629.0 | 1.07 |
| 2630.0 | 1.07 |
| 2631.0 | 1.07 |
| 2632.0 | 1.07 |
| 2633.0 | 1.07 |
| 2634.0 | 1.07 |
| 2635.0 | 1.07 |
| 2636.0 | 1.07 |
| 2637.0 | 1.07 |
| 2638.0 | 1.07 |
| 2639.0 | 1.07 |
| 2640.0 | 1.07 |
| 2641.0 | 1.07 |
| 2642.0 | 1.07 |
| 2643.0 | 1.07 |
| 2644.0 | 1.07 |
| 2645.0 | 1.07 |
| 2646.0 | 1.07 |
| 2647.0 | 1.07 |
| 2648.0 | 1.07 |
| 2649.0 | 1.07 |
| 2650.0 | 1.07 |
| 2651.0 | 1.07 |
| 2652.0 | 1.07 |
| 2653.0 | 1.07 |
| 2654.0 | 1.07 |
| 2655.0 | 1.07 |
| 2656.0 | 1.07 |
| 2657.0 | 1.07 |
| 2658.0 | 1.07 |
| 2659.0 | 1.07 |
| 2660.0 | 1.07 |
| 2661.0 | 1.07 |
| 2662.0 | 1.07 |
| 2663.0 | 1.07 |
| 2664.0 | 1.07 |
| 2665.0 | 1.07 |
| 2666.0 | 1.07 |
| 2667.0 | 1.07 |
| 2668.0 | 1.07 |
| 2669.0 | 1.07 |
| 2670.0 | 1.07 |
| 2671.0 | 1.07 |
| 2672.0 | 1.07 |
| 2673.0 | 1.07 |
| 2674.0 | 1.07 |
| 2675.0 | 1.07 |
| 2676.0 | 1.07 |
| 2677.0 | 1.07 |
| 2678.0 | 1.07 |
| 2679.0 | 1.07 |
| 2680.0 | 1.07 |
| 2681.0 | 1.07 |
| 2682.0 | 1.07 |
| 2683.0 | 1.07 |
| 2684.0 | 1.07 |
| 2685.0 | 1.07 |
| 2686.0 | 1.07 |
| 2687.0 | 1.07 |
| 2688.0 | 1.07 |
| 2689.0 | 1.07 |
| 2690.0 | 1.07 |
| 2691.0 | 1.07 |
| 2692.0 | 1.07 |
| 2693.0 | 1.07 |
| 2694.0 | 1.07 |
| 2695.0 | 1.07 |
| 2696.0 | 1.07 |
| 2697.0 | 1.07 |
| 2698.0 | 1.07 |
| 2699.0 | 1.07 |
| 2700.0 | 1.07 |
| 2701.0 | 1.07 |
| 2702.0 | 1.07 |
| 2703.0 | 1.07 |
| 2704.0 | 1.07 |
| 2705.0 | 1.07 |
| 2706.0 | 1.07 |
| 2707.0 | 1.07 |
| 2708.0 | 1.07 |
| 2709.0 | 1.07 |
| 2710.0 | 1.07 |
| 2711.0 | 1.07 |
| 2712.0 | 1.07 |
| 2713.0 | 1.07 |
| 2714.0 | 1.07 |
| 2715.0 | 1.07 |
| 2716.0 | 1.07 |
| 2717.0 | 1.07 |
| 2718.0 | 1.07 |
| 2719.0 | 1.07 |
| 2720.0 | 1.07 |
| 2721.0 | 1.07 |
| 2722.0 | 1.07 |
| 2723.0 | 1.07 |
| 2724.0 | 1.07 |
| 2725.0 | 1.07 |
| 2726.0 | 1.07 |
| 2727.0 | 1.07 |
| 2728.0 | 1.07 |
| 2729.0 | 1.07 |
| 2730.0 | 1.07 |
| 2731.0 | 1.07 |
| 2732.0 | 1.07 |
| 2733.0 | 1.07 |
| 2734.0 | 1.07 |
| 2735.0 | 1.07 |
| 2736.0 | 1.07 |
| 2737.0 | 1.07 |
| 2738.0 | 1.07 |
| 2739.0 | 1.07 |
| 2740.0 | 1.07 |
| 2741.0 | 1.07 |
| 2742.0 | 1.07 |
| 2743.0 | 1.07 |
| 2744.0 | 1.07 |
| 2745.0 | 1.07 |
| 2746.0 | 1.07 |
| 2747.0 | 1.07 |
| 2748.0 | 1.07 |
| 2749.0 | 1.07 |
| 2750.0 | 1.07 |
| 2751.0 | 1.07 |
| 2752.0 | 1.07 |
| 2753.0 | 1.07 |
| 2754.0 | 1.07 |
| 2755.0 | 1.07 |
| 2756.0 | 1.07 |
| 2757.0 | 1.07 |
| 2758.0 | 1.07 |
| 2759.0 | 1.07 |
| 2760.0 | 1.07 |
| 2761.0 | 1.07 |
| 2762.0 | 1.07 |
| 2763.0 | 1.07 |
| 2764.0 | 1.07 |
| 2765.0 | 1.07 |
| 2766.0 | 1.07 |
| 2767.0 | 1.07 |
| 2768.0 | 1.07 |
| 2769.0 | 1.07 |
| 2770.0 | 1.07 |
| 2771.0 | 1.07 |
| 2772.0 | 1.07 |
| 2773.0 | 1.07 |
| 2774.0 | 1.07 |
| 2775.0 | 1.07 |
| 2776.0 | 1.07 |
| 2777.0 | 1.07 |
| 2778.0 | 1.07 |
| 2779.0 | 1.07 |
| 2780.0 | 1.07 |
| 2781.0 | 1.07 |
| 2782.0 | 1.07 |
| 2783.0 | 1.07 |
| 2784.0 | 1.07 |
| 2785.0 | 1.07 |
| 2786.0 | 1.07 |
| 2787.0 | 1.07 |
| 2788.0 | 1.07 |
| 2789.0 | 1.07 |
| 2790.0 | 1.07 |
| 2791.0 | 1.07 |
| 2792.0 | 1.07 |
| 2793.0 | 1.07 |
| 2794.0 | 1.07 |
| 2795.0 | 1.07 |
| 2796.0 | 1.07 |
| 2797.0 | 1.07 |
| 2798.0 | 1.07 |
| 2799.0 | 1.07 |
| 2800.0 | 1.07 |
| 2801.0 | 1.07 |
| 2802.0 | 1.07 |
| 2803.0 | 1.07 |
| 2804.0 | 1.07 |
| 2805.0 | 1.07 |
| 2806.0 | 1.07 |
| 2807.0 | 1.07 |
| 2808.0 | 1.07 |
| 2809.0 | 1.07 |
| 2810.0 | 1.07 |
| 2811.0 | 1.07 |
| 2812.0 | 1.07 |
| 2813.0 | 1.07 |
| 2814.0 | 1.07 |
| 2815.0 | 1.07 |
| 2816.0 | 1.07 |
| 2817.0 | 1.07 |
| 2818.0 | 1.07 |
| 2819.0 | 1.07 |
| 2820.0 | 1.07 |
| 2821.0 | 1.07 |
| 2822.0 | 1.07 |
| 2823.0 | 1.07 |
| 2824.0 | 1.07 |
| 2825.0 | 1.07 |
| 2826.0 | 1.07 |
| 2827.0 | 1.07 |
| 2828.0 | 1.07 |
| 2829.0 | 1.07 |
| 2830.0 | 1.07 |
| 2831.0 | 1.07 |
| 2832.0 | 1.07 |
| 2833.0 | 1.07 |
| 2834.0 | 1.07 |
| 2835.0 | 1.07 |
| 2836.0 | 1.07 |
| 2837.0 | 1.07 |
| 2838.0 | 1.07 |
| 2839.0 | 1.07 |
| 2840.0 | 1.07 |
| 2841.0 | 1.07 |
| 2842.0 | 1.07 |
| 2843.0 | 1.07 |
| 2844.0 | 1.07 |
| 2845.0 | 1.07 |
| 2846.0 | 1.07 |
| 2847.0 | 1.07 |
| 2848.0 | 1.07 |
| 2849.0 | 1.07 |
| 2850.0 | 1.07 |
| 2851.0 | 1.07 |
| 2852.0 | 1.07 |
| 2853.0 | 1.07 |
| 2854.0 | 1.07 |
| 2855.0 | 1.07 |
| 2856.0 | 1.07 |
| 2857.0 | 1.07 |
| 2858.0 | 1.07 |
| 2859.0 | 1.07 |
| 2860.0 | 1.07 |
| 2861.0 | 1.07 |
| 2862.0 | 1.07 |
| 2863.0 | 1.07 |
| 2864.0 | 1.07 |
| 2865.0 | 1.07 |
| 2866.0 | 1.07 |
| 2867.0 | 1.07 |
| 2868.0 | 1.07 |
| 2869.0 | 1.07 |
| 2870.0 | 1.07 |
| 2871.0 | 1.07 |
| 2872.0 | 1.07 |
| 2873.0 | 1.07 |
| 2874.0 | 1.07 |
| 2875.0 | 1.07 |
| 2876.0 | 1.07 |
| 2877.0 | 1.07 |
| 2878.0 | 1.07 |
| 2879.0 | 1.07 |
| 2880.0 | 1.07 |
| 2881.0 | 1.07 |
| 2882.0 | 1.07 |
| 2883.0 | 1.07 |
| 2884.0 | 1.07 |
| 2885.0 | 1.07 |
| 2886.0 | 1.07 |
| 2887.0 | 1.07 |
| 2888.0 | 1.07 |
| 2889.0 | 1.07 |
| 2890.0 | 1.07 |
| 2891.0 | 1.07 |
| 2892.0 | 1.07 |
| 2893.0 | 1.07 |
| 2894.0 | 1.07 |
| 2895.0 | 1.07 |
| 2896.0 | 1.07 |
| 2897.0 | 1.07 |
| 2898.0 | 1.07 |
| 2899.0 | 1.07 |
| 2900.0 | 1.07 |
| 2901.0 | 1.07 |
| 2902.0 | 1.07 |
| 2903.0 | 1.07 |
| 2904.0 | 1.07 |
| 2905.0 | 1.07 |
| 2906.0 | 1.07 |
| 2907.0 | 1.07 |
| 2908.0 | 1.07 |
| 2909.0 | 1.07 |
| 2910.0 | 1.07 |
| 2911.0 | 1.07 |
| 2912.0 | 1.07 |
| 2913.0 | 1.07 |
| 2914.0 | 1.07 |
| 2915.0 | 1.07 |
| 2916.0 | 1.07 |
| 2917.0 | 1.07 |
| 2918.0 | 1.07 |
| 2919.0 | 1.07 |
| 2920.0 | 1.07 |
| 2921.0 | 1.07 |
| 2922.0 | 1.07 |
| 2923.0 | 1.07 |
| 2924.0 | 1.07 |
| 2925.0 | 1.07 |
| 2926.0 | 1.07 |
| 2927.0 | 1.07 |
| 2928.0 | 1.07 |
| 2929.0 | 1.07 |
| 2930.0 | 1.07 |
| 2931.0 | 1.07 |
| 2932.0 | 1.07 |
| 2933.0 | 1.07 |
| 2934.0 | 1.07 |
| 2935.0 | 1.07 |
| 2936.0 | 1.07 |
| 2937.0 | 1.07 |
| 2938.0 | 1.07 |
| 2939.0 | 1.07 |
| 2940.0 | 1.07 |
| 2941.0 | 1.07 |
| 2942.0 | 1.07 |
| 2943.0 | 1.07 |
| 2944.0 | 1.07 |
| 2945.0 | 1.07 |
| 2946.0 | 1.07 |
| 2947.0 | 1.07 |
| 2948.0 | 1.07 |
| 2949.0 | 1.07 |
| 2950.0 | 1.07 |
| 2951.0 | 1.07 |
| 2952.0 | 1.07 |
| 2953.0 | 1.07 |
| 2954.0 | 1.07 |
| 2955.0 | 1.07 |
| 2956.0 | 1.07 |
| 2957.0 | 1.07 |
| 2958.0 | 1.07 |
| 2959.0 | 1.07 |
| 2960.0 | 1.07 |
| 2961.0 | 1.07 |
| 2962.0 | 1.07 |
| 2963.0 | 1.07 |
| 2964.0 | 1.07 |
| 2965.0 | 1.07 |
| 2966.0 | 1.07 |
| 2967.0 | 1.07 |
| 2968.0 | 1.07 |
| 2969.0 | 1.07 |
| 2970.0 | 1.07 |
| 2971.0 | 1.07 |
| 2972.0 | 1.07 |
| 2973.0 | 1.07 |
| 2974.0 | 1.07 |
| 2975.0 | 1.07 |
| 2976.0 | 1.07 |
| 2977.0 | 1.07 |
| 2978.0 | 1.07 |
| 2979.0 | 1.07 |
| 2980.0 | 1.07 |
| 2981.0 | 1.07 |
| 2982.0 | 1.07 |
| 2983.0 | 1.07 |
| 2984.0 | 1.07 |
| 2985.0 | 1.07 |
| 2986.0 | 1.07 |
| 2987.0 | 1.07 |
| 2988.0 | 1.07 |
| 2989.0 | 1.07 |
| 2990.0 | 1.07 |
| 2991.0 | 1.07 |
| 2992.0 | 1.07 |
| 2993.0 | 1.07 |
| 2994.0 | 1.07 |
| 2995.0 | 1.07 |
| 2996.0 | 1.07 |
| 2997.0 | 1.07 |
| 2998.0 | 1.07 |
| 2999.0 | 1.07 |
| 3000.0 | 1.07 |
| 3001.0 | 1.07 |
| 3002.0 | 1.07 |
| 3003.0 | 1.07 |
| 3004.0 | 1.07 |
| 3005.0 | 1.07 |
| 3006.0 | 1.07 |
| 3007.0 | 1.07 |
| 3008.0 | 1.07 |
| 3009.0 | 1.07 |
| 3010.0 | 1.07 |
| 3011.0 | 1.07 |
| 3012.0 | 1.07 |
| 3013.0 | 1.07 |
| 3014.0 | 1.07 |
| 3015.0 | 1.07 |
| 3016.0 | 1.07 |
| 3017.0 | 1.07 |
| 3018.0 | 1.07 |
| 3019.0 | 1.07 |
| 3020.0 | 1.07 |
| 3021.0 | 1.07 |
| 3022.0 | 1.07 |
| 3023.0 | 1.07 |
| 3024.0 | 1.07 |
| 3025.0 | 1.07 |
| 3026.0 | 1.07 |
| 3027.0 | 1.07 |
| 3028.0 | 1.07 |
| 3029.0 | 1.07 |
| 3030.0 | 1.07 |
| 3031.0 | 1.07 |
| 3032.0 | 1.07 |
| 3033.0 | 1.07 |
| 3034.0 | 1.07 |
| 3035.0 | 1.07 |
| 3036.0 | 1.07 |
| 3037.0 | 1.07 |
| 3038.0 | 1.07 |
| 3039.0 | 1.07 |
| 3040.0 | 1.07 |
| 3041.0 | 1.07 |
| 3042.0 | 1.07 |
| 3043.0 | 1.07 |
| 3044.0 | 1.07 |
| 3045.0 | 1.07 |
| 3046.0 | 1.07 |
| 3047.0 | 1.07 |
| 3048.0 | 1.07 |
| 3049.0 | 1.07 |
| 3050.0 | 1.07 |
| 3051.0 | 1.07 |
| 3052.0 | 1.07 |
| 3053.0 | 1.07 |
| 3054.0 | 1.07 |
| 3055.0 | 1.07 |
| 3056.0 | 1.07 |
| 3057.0 | 1.07 |
| 3058.0 | 1.07 |
| 3059.0 | 1.07 |
| 3060.0 | 1.07 |
| 3061.0 | 1.07 |
| 3062.0 | 1.07 |
| 3063.0 | 1.07 |
| 3064.0 | 1.07 |
| 3065.0 | 1.07 |
| 3066.0 | 1.07 |
| 3067.0 | 1.07 |
| 3068.0 | 1.07 |
| 3069.0 | 1.07 |
| 3070.0 | 1.07 |
| 3071.0 | 1.07 |
| 3072.0 | 1.07 |
| 3073.0 | 1.07 |
| 3074.0 | 1.07 |
| 3075.0 | 1.07 |
| 3076.0 | 1.07 |
| 3077.0 | 1.07 |
| 3078.0 | 1.07 |
| 3079.0 | 1.07 |
| 3080.0 | 1.07 |
| 3081.0 | 1.07 |
| 3082.0 | 1.07 |
| 3083.0 | 1.07 |
| 3084.0 | 1.07 |
| 3085.0 | 1.07 |
| 3086.0 | 1.07 |
| 3087.0 | 1.07 |
| 3088.0 | 1.07 |
| 3089.0 | 1.07 |
| 3090.0 | 1.07 |
| 3091.0 | 1.07 |
| 3092.0 | 1.07 |
| 3093.0 | 1.07 |
| 3094.0 | 1.07 |
| 3095.0 | 1.07 |
| 3096.0 | 1.07 |
| 3097.0 | 1.07 |
| 3098.0 | 1.07 |
| 3099.0 | 1.07 |
| 3100.0 | 1.07 |
| 3101.0 | 1.07 |
| 3102.0 | 1.07 |
| 3103.0 | 1.07 |
| 3104.0 | 1.07 |
| 3105.0 | 1.07 |
| 3106.0 | 1.07 |
| 3107.0 | 1.07 |
| 3108.0 | 1.07 |
| 3109.0 | 1.07 |
| 3110.0 | 1.07 |
| 3111.0 | 1.07 |
| 3112.0 | 1.07 |
| 3113.0 | 1.07 |
| 3114.0 | 1.07 |
| 3115.0 | 1.07 |
| 3116.0 | 1.07 |
| 3117.0 | 1.07 |
| 3118.0 | 1.07 |
| 3119.0 | 1.07 |
| 3120.0 | 1.07 |
| 3121.0 | 1.07 |
| 3122.0 | 1.07 |
| 3123.0 | 1.07 |
| 3124.0 | 1.07 |
| 3125.0 | 1.07 |
| 3126.0 | 1.07 |
| 3127.0 | 1.07 |
| 3128.0 | 1.07 |
| 3129.0 | 1.07 |
| 3130.0 | 1.07 |
| 3131.0 | 1.07 |
| 3132.0 | 1.07 |
| 3133.0 | 1.07 |
| 3134.0 | 1.07 |
| 3135.0 | 1.07 |
| 3136.0 | 1.07 |
| 3137.0 | 1.07 |
| 3138.0 | 1.07 |
| 3139.0 | 1.07 |
| 3140.0 | 1.07 |
| 3141.0 | 1.07 |
| 3142.0 | 1.07 |
| 3143.0 | 1.07 |
| 3144.0 | 1.07 |
| 3145.0 | 1.07 |
| 3146.0 | 1.07 |
| 3147.0 | 1.07 |
| 3148.0 | 1.07 |
| 3149.0 | 1.07 |
| 3150.0 | 1.07 |
| 3151.0 | 1.07 |
| 3152.0 | 1.07 |
| 3153.0 | 1.07 |
| 3154.0 | 1.07 |
| 3155.0 | 1.07 |
| 3156.0 | 1.07 |
| 3157.0 | 1.07 |
| 3158.0 | 1.07 |
| 3159.0 | 1.07 |
| 3160.0 | 1.07 |
| 3161.0 | 1.07 |
| 3162.0 | 1.07 |
| 3163.0 | 1.07 |
| 3164.0 | 1.07 |
| 3165.0 | 1.07 |
| 3166.0 | 1.07 |
| 3167.0 | 1.07 |
| 3168.0 | 1.07 |
| 3169.0 | 1.07 |
| 3170.0 | 1.07 |
| 3171.0 | 1.07 |
| 3172.0 | 1.07 |
| 3173.0 | 1.07 |
| 3174.0 | 1.07 |
| 3175.0 | 1.07 |
| 3176.0 | 1.07 |
| 3177.0 | 1.07 |
| 3178.0 | 1.07 |
| 3179.0 | 1.07 |
| 3180.0 | 1.07 |
| 3181.0 | 1.07 |
| 3182.0 | 1.07 |
| 3183.0 | 1.07 |
| 3184.0 | 1.07 |
| 3185.0 | 1.07 |
| 3186.0 | 1.07 |
| 3187.0 | 1.07 |
| 3188.0 | 1.07 |
| 3189.0 | 1.07 |
| 3190.0 | 1.07 |
| 3191.0 | 1.07 |
| 3192.0 | 1.07 |
| 3193.0 | 1.07 |
| 3194.0 | 1.07 |
| 3195.0 | 1.07 |
| 3196.0 | 1.07 |
| 3197.0 | 1.07 |
| 3198.0 | 1.07 |
| 3199.0 | 1.07 |
| 3200.0 | 1.07 |
| 3201.0 | 1.07 |
| 3202.0 | 1.07 |
| 3203.0 | 1.07 |
| 3204.0 | 1.07 |
| 3205.0 | 1.07 |
| 3206.0 | 1.07 |
| 3207.0 | 1.07 |
| 3208.0 | 1.07 |
| 3209.0 | 1.07 |
| 3210.0 | 1.07 |
| 3211.0 | 1.07 |
| 3212.0 | 1.07 |
| 3213.0 | 1.07 |
| 3214.0 | 1.07 |
| 3215.0 | 1.07 |
| 3216.0 | 1.07 |
| 3217.0 | 1.07 |
| 3218.0 | 1.07 |
| 3219.0 | 1.07 |
| 3220.0 | 1.07 |
| 3221.0 | 1.07 |
| 3222.0 | 1.07 |
| 3223.0 | 1.07 |
| 3224.0 | 1.07 |
| 3225.0 | 1.07 |
| 3226.0 | 1.07 |
| 3227.0 | 1.07 |
| 3228.0 | 1.07 |
| 3229.0 | 1.07 |
| 3230.0 | 1.07 |
| 3231.0 | 1.07 |
| 3232.0 | 1.07 |
| 3233.0 | 1.07 |
| 3234.0 | 1.07 |
| 3235.0 | 1.07 |
| 3236.0 | 1.07 |
| 3237.0 | 1.07 |
| 3238.0 | 1.07 |
| 3239.0 | 1.07 |
| 3240.0 | 1.07 |
| 3241.0 | 1.07 |
| 3242.0 | 1.07 |
| 3243.0 | 1.07 |
| 3244.0 | 1.07 |
| 3245.0 | 1.07 |
| 3246.0 | 1.07 |
| 3247.0 | 1.07 |
| 3248.0 | 1.07 |
| 3249.0 | 1.07 |
| 3250.0 | 1.07 |
| 3251.0 | 1.07 |
| 3252.0 | 1.07 |
| 3253.0 | 1.07 |
| 3254.0 | 1.07 |
| 3255.0 | 1.07 |
| 3256.0 | 1.07 |
| 3257.0 | 1.07 |
| 3258.0 | 1.07 |
| 3259.0 | 1.07 |
| 3260.0 | 1.07 |
| 3261.0 | 1.07 |
| 3262.0 | 1.07 |
| 3263.0 | 1.07 |
| 3264.0 | 1.07 |
| 3265.0 | 1.07 |
| 3266.0 | 1.07 |
| 3267.0 | 1.07 |
| 3268.0 | 1.07 |
| 3269.0 | 1.07 |
| 3270.0 | 1.07 |
| 3271.0 | 1.07 |
| 3272.0 | 1.07 |
| 3273.0 | 1.07 |
| 3274.0 | 1.07 |
| 3275.0 | 1.07 |
| 3276.0 | 1.07 |
| 3277.0 | 1.07 |
| 3278.0 | 1.07 |
| 3279.0 | 1.07 |
| 3280.0 | 1.07 |
| 3281.0 | 1.07 |
| 3282.0 | 1.07 |
| 3283.0 | 1.07 |
| 3284.0 | 1.07 |
| 3285.0 | 1.07 |
| 3286.0 | 1.07 |
| 3287.0 | 1.07 |
| 3288.0 | 1.07 |
| 3289.0 | 1.07 |
| 3290.0 | 1.07 |
| 3291.0 | 1.07 |
| 3292.0 | 1.07 |
| 3293.0 | 1.07 |
| 3294.0 | 1.07 |
| 3295.0 | 1.07 |
| 3296.0 | 1.07 |
| 3297.0 | 1.07 |
| 3298.0 | 1.07 |
| 3299.0 | 1.07 |
| 3300.0 | 1.07 |
| 3301.0 | 1.07 |
| 3302.0 | 1.07 |
| 3303.0 | 1.07 |
| 3304.0 | 1.07 |
| 3305.0 | 1.07 |
| 3306.0 | 1.07 |
| 3307.0 | 1.07 |
| 3308.0 | 1.07 |
| 3309.0 | 1.07 |
| 3310.0 | 1.07 |
| 3311.0 | 1.07 |
| 3312.0 | 1.07 |
| 3313.0 | 1.07 |
| 3314.0 | 1.07 |
| 3315.0 | 1.07 |
| 3316.0 | 1.07 |
| 3317.0 | 1.07 |
| 3318.0 | 1.07 |
| 3319.0 | 1.07 |
| 3320.0 | 1.07 |
| 3321.0 | 1.07 |
| 3322.0 | 1.07 |
| 3323.0 | 1.07 |
| 3324.0 | 1.07 |
| 3325.0 | 1.07 |
| 3326.0 | 1.07 |
| 3327.0 | 1.07 |
| 3328.0 | 1.07 |
| 3329.0 | 1.07 |
| 3330.0 | 1.07 |
| 3331.0 | 1.07 |
| 3332.0 | 1.07 |
| 3333.0 | 1.07 |
| 3334.0 | 1.071 |
| 3335.0 | 1.071 |
| 3336.0 | 1.071 |
| 3337.0 | 1.071 |
| 3338.0 | 1.071 |
| 3339.0 | 1.071 |
| 3340.0 | 1.071 |
| 3341.0 | 1.071 |
| 3342.0 | 1.071 |
| 3343.0 | 1.071 |
| 3344.0 | 1.071 |
| 3345.0 | 1.071 |
| 3346.0 | 1.071 |
| 3347.0 | 1.071 |
| 3348.0 | 1.071 |
| 3349.0 | 1.071 |
| 3350.0 | 1.071 |
| 3351.0 | 1.071 |
| 3352.0 | 1.071 |
| 3353.0 | 1.071 |
| 3354.0 | 1.071 |
| 3355.0 | 1.071 |
| 3356.0 | 1.071 |
| 3357.0 | 1.071 |
| 3358.0 | 1.071 |
| 3359.0 | 1.071 |
| 3360.0 | 1.071 |
| 3361.0 | 1.071 |
| 3362.0 | 1.071 |
| 3363.0 | 1.071 |
| 3364.0 | 1.071 |
| 3365.0 | 1.071 |
| 3366.0 | 1.071 |
| 3367.0 | 1.071 |
| 3368.0 | 1.071 |
| 3369.0 | 1.071 |
| 3370.0 | 1.071 |
| 3371.0 | 1.071 |
| 3372.0 | 1.071 |
| 3373.0 | 1.071 |
| 3374.0 | 1.071 |
| 3375.0 | 1.071 |
| 3376.0 | 1.071 |
| 3377.0 | 1.071 |
| 3378.0 | 1.071 |
| 3379.0 | 1.071 |
| 3380.0 | 1.071 |
| 3381.0 | 1.071 |
| 3382.0 | 1.071 |
| 3383.0 | 1.071 |
| 3384.0 | 1.071 |
| 3385.0 | 1.071 |
| 3386.0 | 1.071 |
| 3387.0 | 1.071 |
| 3388.0 | 1.071 |
| 3389.0 | 1.071 |
| 3390.0 | 1.071 |
| 3391.0 | 1.071 |
| 3392.0 | 1.071 |
| 3393.0 | 1.071 |
| 3394.0 | 1.071 |
| 3395.0 | 1.071 |
| 3396.0 | 1.071 |
| 3397.0 | 1.071 |
| 3398.0 | 1.071 |
| 3399.0 | 1.071 |
| 3400.0 | 1.071 |
| 3401.0 | 1.071 |
| 3402.0 | 1.071 |
| 3403.0 | 1.071 |
| 3404.0 | 1.071 |
| 3405.0 | 1.071 |
| 3406.0 | 1.071 |
| 3407.0 | 1.071 |
| 3408.0 | 1.071 |
| 3409.0 | 1.071 |
| 3410.0 | 1.071 |
| 3411.0 | 1.071 |
| 3412.0 | 1.071 |
| 3413.0 | 1.071 |
| 3414.0 | 1.071 |
| 3415.0 | 1.071 |
| 3416.0 | 1.071 |
| 3417.0 | 1.071 |
| 3418.0 | 1.071 |
| 3419.0 | 1.071 |
| 3420.0 | 1.071 |
| 3421.0 | 1.071 |
| 3422.0 | 1.071 |
| 3423.0 | 1.071 |
| 3424.0 | 1.071 |
| 3425.0 | 1.071 |
| 3426.0 | 1.071 |
| 3427.0 | 1.071 |
| 3428.0 | 1.071 |
| 3429.0 | 1.071 |
| 3430.0 | 1.071 |
| 3431.0 | 1.071 |
| 3432.0 | 1.071 |
| 3433.0 | 1.071 |
| 3434.0 | 1.071 |
| 3435.0 | 1.071 |
| 3436.0 | 1.071 |
| 3437.0 | 1.071 |
| 3438.0 | 1.071 |
| 3439.0 | 1.071 |
| 3440.0 | 1.071 |
| 3441.0 | 1.071 |
| 3442.0 | 1.071 |
| 3443.0 | 1.071 |
| 3444.0 | 1.071 |
| 3445.0 | 1.071 |
| 3446.0 | 1.071 |
| 3447.0 | 1.071 |
| 3448.0 | 1.071 |
| 3449.0 | 1.071 |
| 3450.0 | 1.071 |
| 3451.0 | 1.071 |
| 3452.0 | 1.071 |
| 3453.0 | 1.071 |
| 3454.0 | 1.071 |
| 3455.0 | 1.071 |
| 3456.0 | 1.071 |
| 3457.0 | 1.071 |
| 3458.0 | 1.071 |
| 3459.0 | 1.071 |
| 3460.0 | 1.071 |
| 3461.0 | 1.071 |
| 3462.0 | 1.071 |
| 3463.0 | 1.071 |
| 3464.0 | 1.071 |
| 3465.0 | 1.071 |
| 3466.0 | 1.071 |
| 3467.0 | 1.071 |
| 3468.0 | 1.071 |
| 3469.0 | 1.071 |
| 3470.0 | 1.071 |
| 3471.0 | 1.071 |
| 3472.0 | 1.071 |
| 3473.0 | 1.071 |
| 3474.0 | 1.071 |
| 3475.0 | 1.071 |
| 3476.0 | 1.071 |
| 3477.0 | 1.071 |
| 3478.0 | 1.071 |
| 3479.0 | 1.071 |
| 3480.0 | 1.071 |
| 3481.0 | 1.071 |
| 3482.0 | 1.071 |
| 3483.0 | 1.071 |
| 3484.0 | 1.071 |
| 3485.0 | 1.071 |
| 3486.0 | 1.071 |
| 3487.0 | 1.071 |
| 3488.0 | 1.071 |
| 3489.0 | 1.071 |
| 3490.0 | 1.071 |
| 3491.0 | 1.071 |
| 3492.0 | 1.071 |
| 3493.0 | 1.071 |
| 3494.0 | 1.071 |
| 3495.0 | 1.071 |
| 3496.0 | 1.071 |
| 3497.0 | 1.071 |
| 3498.0 | 1.071 |
| 3499.0 | 1.071 |
| 3500.0 | 1.071 |
| 3501.0 | 1.071 |
| 3502.0 | 1.071 |
| 3503.0 | 1.071 |
| 3504.0 | 1.071 |
| 3505.0 | 1.071 |
| 3506.0 | 1.071 |
| 3507.0 | 1.071 |
| 3508.0 | 1.071 |
| 3509.0 | 1.071 |
| 3510.0 | 1.071 |
| 3511.0 | 1.071 |
| 3512.0 | 1.071 |
| 3513.0 | 1.071 |
| 3514.0 | 1.071 |
| 3515.0 | 1.071 |
| 3516.0 | 1.071 |
| 3517.0 | 1.071 |
| 3518.0 | 1.071 |
| 3519.0 | 1.071 |
| 3520.0 | 1.071 |
| 3521.0 | 1.071 |
| 3522.0 | 1.071 |
| 3523.0 | 1.071 |
| 3524.0 | 1.071 |
| 3525.0 | 1.071 |
| 3526.0 | 1.071 |
| 3527.0 | 1.071 |
| 3528.0 | 1.071 |
| 3529.0 | 1.071 |
| 3530.0 | 1.071 |
| 3531.0 | 1.071 |
| 3532.0 | 1.071 |
| 3533.0 | 1.071 |
| 3534.0 | 1.071 |
| 3535.0 | 1.071 |
| 3536.0 | 1.071 |
| 3537.0 | 1.071 |
| 3538.0 | 1.071 |
| 3539.0 | 1.071 |
| 3540.0 | 1.071 |
| 3541.0 | 1.071 |
| 3542.0 | 1.071 |
| 3543.0 | 1.071 |
| 3544.0 | 1.071 |
| 3545.0 | 1.071 |
| 3546.0 | 1.071 |
| 3547.0 | 1.071 |
| 3548.0 | 1.071 |
| 3549.0 | 1.071 |
| 3550.0 | 1.071 |
| 3551.0 | 1.071 |
| 3552.0 | 1.071 |
| 3553.0 | 1.071 |
| 3554.0 | 1.071 |
| 3555.0 | 1.071 |
| 3556.0 | 1.071 |
| 3557.0 | 1.071 |
| 3558.0 | 1.071 |
| 3559.0 | 1.071 |
| 3560.0 | 1.071 |
| 3561.0 | 1.071 |
| 3562.0 | 1.071 |
| 3563.0 | 1.071 |
| 3564.0 | 1.071 |
| 3565.0 | 1.071 |
| 3566.0 | 1.071 |
| 3567.0 | 1.071 |
| 3568.0 | 1.071 |
| 3569.0 | 1.071 |
| 3570.0 | 1.071 |
| 3571.0 | 1.071 |
| 3572.0 | 1.071 |
| 3573.0 | 1.071 |
| 3574.0 | 1.071 |
| 3575.0 | 1.071 |
| 3576.0 | 1.071 |
| 3577.0 | 1.071 |
| 3578.0 | 1.071 |
| 3579.0 | 1.071 |
| 3580.0 | 1.071 |
| 3581.0 | 1.071 |
| 3582.0 | 1.071 |
| 3583.0 | 1.071 |
| 3584.0 | 1.071 |
| 3585.0 | 1.071 |
| 3586.0 | 1.071 |
| 3587.0 | 1.071 |
| 3588.0 | 1.071 |
| 3589.0 | 1.071 |
| 3590.0 | 1.071 |
| 3591.0 | 1.071 |
| 3592.0 | 1.071 |
| 3593.0 | 1.071 |
| 3594.0 | 1.071 |
| 3595.0 | 1.071 |
| 3596.0 | 1.071 |
| 3597.0 | 1.071 |
| 3598.0 | 1.071 |
| 3599.0 | 1.071 |
| 3600.0 | 1.071 |
| 3601.0 | 1.071 |
| 3602.0 | 1.071 |
| 3603.0 | 1.071 |
| 3604.0 | 1.071 |
| 3605.0 | 1.071 |
| 3606.0 | 1.071 |
| 3607.0 | 1.071 |
| 3608.0 | 1.071 |
| 3609.0 | 1.071 |
| 3610.0 | 1.071 |
| 3611.0 | 1.071 |
| 3612.0 | 1.071 |
| 3613.0 | 1.071 |
| 3614.0 | 1.071 |
| 3615.0 | 1.071 |
| 3616.0 | 1.071 |
| 3617.0 | 1.071 |
| 3618.0 | 1.071 |
| 3619.0 | 1.071 |
| 3620.0 | 1.071 |
| 3621.0 | 1.071 |
| 3622.0 | 1.071 |
| 3623.0 | 1.071 |
| 3624.0 | 1.071 |
| 3625.0 | 1.071 |
| 3626.0 | 1.071 |
| 3627.0 | 1.071 |
| 3628.0 | 1.071 |
| 3629.0 | 1.071 |
| 3630.0 | 1.071 |
| 3631.0 | 1.071 |
| 3632.0 | 1.071 |
| 3633.0 | 1.071 |
| 3634.0 | 1.071 |
| 3635.0 | 1.071 |
| 3636.0 | 1.071 |
| 3637.0 | 1.071 |
| 3638.0 | 1.071 |
| 3639.0 | 1.071 |
| 3640.0 | 1.071 |
| 3641.0 | 1.071 |
| 3642.0 | 1.071 |
| 3643.0 | 1.071 |
| 3644.0 | 1.071 |
| 3645.0 | 1.071 |
| 3646.0 | 1.071 |
| 3647.0 | 1.071 |
| 3648.0 | 1.071 |
| 3649.0 | 1.071 |
| 3650.0 | 1.071 |
| 3651.0 | 1.071 |
| 3652.0 | 1.071 |
| 3653.0 | 1.071 |
| 3654.0 | 1.071 |
| 3655.0 | 1.071 |
| 3656.0 | 1.071 |
| 3657.0 | 1.071 |
| 3658.0 | 1.071 |
| 3659.0 | 1.071 |
| 3660.0 | 1.071 |
| 3661.0 | 1.071 |
| 3662.0 | 1.071 |
| 3663.0 | 1.071 |
| 3664.0 | 1.071 |
| 3665.0 | 1.071 |
| 3666.0 | 1.071 |
| 3667.0 | 1.071 |
| 3668.0 | 1.071 |
| 3669.0 | 1.071 |
| 3670.0 | 1.071 |
| 3671.0 | 1.071 |
| 3672.0 | 1.071 |
| 3673.0 | 1.071 |
| 3674.0 | 1.071 |
| 3675.0 | 1.071 |
| 3676.0 | 1.071 |
| 3677.0 | 1.071 |
| 3678.0 | 1.071 |
| 3679.0 | 1.071 |
| 3680.0 | 1.071 |
| 3681.0 | 1.071 |
| 3682.0 | 1.071 |
| 3683.0 | 1.071 |
| 3684.0 | 1.071 |
| 3685.0 | 1.071 |
| 3686.0 | 1.071 |
| 3687.0 | 1.071 |
| 3688.0 | 1.071 |
| 3689.0 | 1.071 |
| 3690.0 | 1.071 |
| 3691.0 | 1.071 |
| 3692.0 | 1.071 |
| 3693.0 | 1.071 |
| 3694.0 | 1.071 |
| 3695.0 | 1.071 |
| 3696.0 | 1.071 |
| 3697.0 | 1.071 |
| 3698.0 | 1.071 |
| 3699.0 | 1.071 |
| 3700.0 | 1.071 |
| 3701.0 | 1.071 |
| 3702.0 | 1.071 |
| 3703.0 | 1.071 |
| 3704.0 | 1.071 |
| 3705.0 | 1.071 |
| 3706.0 | 1.071 |
| 3707.0 | 1.071 |
| 3708.0 | 1.071 |
| 3709.0 | 1.071 |
| 3710.0 | 1.071 |
| 3711.0 | 1.071 |
| 3712.0 | 1.071 |
| 3713.0 | 1.071 |
| 3714.0 | 1.071 |
| 3715.0 | 1.071 |
| 3716.0 | 1.071 |
| 3717.0 | 1.071 |
| 3718.0 | 1.071 |
| 3719.0 | 1.071 |
| 3720.0 | 1.071 |
| 3721.0 | 1.071 |
| 3722.0 | 1.071 |
| 3723.0 | 1.071 |
| 3724.0 | 1.071 |
| 3725.0 | 1.071 |
| 3726.0 | 1.071 |
| 3727.0 | 1.071 |
| 3728.0 | 1.071 |
| 3729.0 | 1.071 |
| 3730.0 | 1.071 |
| 3731.0 | 1.071 |
| 3732.0 | 1.071 |
| 3733.0 | 1.071 |
| 3734.0 | 1.071 |
| 3735.0 | 1.071 |
| 3736.0 | 1.071 |
| 3737.0 | 1.071 |
| 3738.0 | 1.071 |
| 3739.0 | 1.071 |
| 3740.0 | 1.071 |
| 3741.0 | 1.071 |
| 3742.0 | 1.071 |
| 3743.0 | 1.071 |
| 3744.0 | 1.071 |
| 3745.0 | 1.071 |
| 3746.0 | 1.071 |
| 3747.0 | 1.071 |
| 3748.0 | 1.071 |
| 3749.0 | 1.071 |
| 3750.0 | 1.071 |
| 3751.0 | 1.071 |
| 3752.0 | 1.071 |
| 3753.0 | 1.071 |
| 3754.0 | 1.071 |
| 3755.0 | 1.071 |
| 3756.0 | 1.071 |
| 3757.0 | 1.071 |
| 3758.0 | 1.071 |
| 3759.0 | 1.071 |
| 3760.0 | 1.071 |
| 3761.0 | 1.071 |
| 3762.0 | 1.071 |
| 3763.0 | 1.071 |
| 3764.0 | 1.071 |
| 3765.0 | 1.071 |
| 3766.0 | 1.071 |
| 3767.0 | 1.071 |
| 3768.0 | 1.071 |
| 3769.0 | 1.071 |
| 3770.0 | 1.071 |
| 3771.0 | 1.071 |
| 3772.0 | 1.071 |
| 3773.0 | 1.071 |
| 3774.0 | 1.071 |
| 3775.0 | 1.071 |
| 3776.0 | 1.071 |
| 3777.0 | 1.071 |
| 3778.0 | 1.071 |
| 3779.0 | 1.071 |
| 3780.0 | 1.071 |
| 3781.0 | 1.071 |
| 3782.0 | 1.071 |
| 3783.0 | 1.071 |
| 3784.0 | 1.071 |
| 3785.0 | 1.071 |
| 3786.0 | 1.071 |
| 3787.0 | 1.071 |
| 3788.0 | 1.071 |
| 3789.0 | 1.071 |
| 3790.0 | 1.071 |
| 3791.0 | 1.071 |
| 3792.0 | 1.071 |
| 3793.0 | 1.071 |
| 3794.0 | 1.071 |
| 3795.0 | 1.071 |
| 3796.0 | 1.071 |
| 3797.0 | 1.071 |
| 3798.0 | 1.071 |
| 3799.0 | 1.071 |
| 3800.0 | 1.071 |
| 3801.0 | 1.071 |
| 3802.0 | 1.071 |
| 3803.0 | 1.071 |
| 3804.0 | 1.071 |
| 3805.0 | 1.071 |
| 3806.0 | 1.071 |
| 3807.0 | 1.071 |
| 3808.0 | 1.071 |
| 3809.0 | 1.071 |
| 3810.0 | 1.071 |
| 3811.0 | 1.071 |
| 3812.0 | 1.071 |
| 3813.0 | 1.071 |
| 3814.0 | 1.071 |
| 3815.0 | 1.071 |
| 3816.0 | 1.071 |
| 3817.0 | 1.071 |
| 3818.0 | 1.071 |
| 3819.0 | 1.071 |
| 3820.0 | 1.071 |
| 3821.0 | 1.071 |
| 3822.0 | 1.071 |
| 3823.0 | 1.071 |
| 3824.0 | 1.071 |
| 3825.0 | 1.071 |
| 3826.0 | 1.071 |
| 3827.0 | 1.071 |
| 3828.0 | 1.071 |
| 3829.0 | 1.071 |
| 3830.0 | 1.071 |
| 3831.0 | 1.071 |
| 3832.0 | 1.071 |
| 3833.0 | 1.071 |
| 3834.0 | 1.071 |
| 3835.0 | 1.071 |
| 3836.0 | 1.071 |
| 3837.0 | 1.071 |
| 3838.0 | 1.071 |
| 3839.0 | 1.071 |
| 3840.0 | 1.071 |
| 3841.0 | 1.071 |
| 3842.0 | 1.071 |
| 3843.0 | 1.071 |
| 3844.0 | 1.071 |
| 3845.0 | 1.071 |
| 3846.0 | 1.071 |
| 3847.0 | 1.071 |
| 3848.0 | 1.071 |
| 3849.0 | 1.071 |
| 3850.0 | 1.071 |
| 3851.0 | 1.071 |
| 3852.0 | 1.071 |
| 3853.0 | 1.071 |
| 3854.0 | 1.071 |
| 3855.0 | 1.071 |
| 3856.0 | 1.071 |
| 3857.0 | 1.071 |
| 3858.0 | 1.071 |
| 3859.0 | 1.071 |
| 3860.0 | 1.071 |
| 3861.0 | 1.071 |
| 3862.0 | 1.071 |
| 3863.0 | 1.071 |
| 3864.0 | 1.071 |
| 3865.0 | 1.071 |
| 3866.0 | 1.071 |
| 3867.0 | 1.071 |
| 3868.0 | 1.071 |
| 3869.0 | 1.071 |
| 3870.0 | 1.071 |
| 3871.0 | 1.071 |
| 3872.0 | 1.071 |
| 3873.0 | 1.071 |
| 3874.0 | 1.071 |
| 3875.0 | 1.071 |
| 3876.0 | 1.071 |
| 3877.0 | 1.071 |
| 3878.0 | 1.071 |
| 3879.0 | 1.071 |
| 3880.0 | 1.071 |
| 3881.0 | 1.071 |
| 3882.0 | 1.071 |
| 3883.0 | 1.071 |
| 3884.0 | 1.071 |
| 3885.0 | 1.071 |
| 3886.0 | 1.071 |
| 3887.0 | 1.071 |
| 3888.0 | 1.071 |
| 3889.0 | 1.071 |
| 3890.0 | 1.071 |
| 3891.0 | 1.071 |
| 3892.0 | 1.071 |
| 3893.0 | 1.071 |
| 3894.0 | 1.071 |
| 3895.0 | 1.071 |
| 3896.0 | 1.071 |
| 3897.0 | 1.071 |
| 3898.0 | 1.071 |
| 3899.0 | 1.071 |
| 3900.0 | 1.071 |
| 3901.0 | 1.071 |
| 3902.0 | 1.071 |
| 3903.0 | 1.071 |
| 3904.0 | 1.071 |
| 3905.0 | 1.071 |
| 3906.0 | 1.071 |
| 3907.0 | 1.071 |
| 3908.0 | 1.071 |
| 3909.0 | 1.071 |
| 3910.0 | 1.071 |
| 3911.0 | 1.071 |
| 3912.0 | 1.071 |
| 3913.0 | 1.071 |
| 3914.0 | 1.071 |
| 3915.0 | 1.071 |
| 3916.0 | 1.071 |
| 3917.0 | 1.071 |
| 3918.0 | 1.071 |
| 3919.0 | 1.071 |
| 3920.0 | 1.071 |
| 3921.0 | 1.071 |
| 3922.0 | 1.071 |
| 3923.0 | 1.071 |
| 3924.0 | 1.071 |
| 3925.0 | 1.071 |
| 3926.0 | 1.071 |
| 3927.0 | 1.071 |
| 3928.0 | 1.071 |
| 3929.0 | 1.071 |
| 3930.0 | 1.071 |
| 3931.0 | 1.071 |
| 3932.0 | 1.071 |
| 3933.0 | 1.071 |
| 3934.0 | 1.071 |
| 3935.0 | 1.071 |
| 3936.0 | 1.071 |
| 3937.0 | 1.071 |
| 3938.0 | 1.071 |
| 3939.0 | 1.071 |
| 3940.0 | 1.071 |
| 3941.0 | 1.071 |
| 3942.0 | 1.071 |
| 3943.0 | 1.071 |
| 3944.0 | 1.071 |
| 3945.0 | 1.071 |
| 3946.0 | 1.071 |
| 3947.0 | 1.071 |
| 3948.0 | 1.071 |
| 3949.0 | 1.071 |
| 3950.0 | 1.071 |
| 3951.0 | 1.071 |
| 3952.0 | 1.071 |
| 3953.0 | 1.071 |
| 3954.0 | 1.071 |
| 3955.0 | 1.071 |
| 3956.0 | 1.071 |
| 3957.0 | 1.071 |
| 3958.0 | 1.071 |
| 3959.0 | 1.071 |
| 3960.0 | 1.071 |
| 3961.0 | 1.071 |
| 3962.0 | 1.071 |
| 3963.0 | 1.071 |
| 3964.0 | 1.071 |
| 3965.0 | 1.071 |
| 3966.0 | 1.071 |
| 3967.0 | 1.071 |
| 3968.0 | 1.071 |
| 3969.0 | 1.071 |
| 3970.0 | 1.071 |
| 3971.0 | 1.071 |
| 3972.0 | 1.071 |
| 3973.0 | 1.071 |
| 3974.0 | 1.071 |
| 3975.0 | 1.071 |
| 3976.0 | 1.071 |
| 3977.0 | 1.071 |
| 3978.0 | 1.071 |
| 3979.0 | 1.071 |
| 3980.0 | 1.071 |
| 3981.0 | 1.071 |
| 3982.0 | 1.071 |
| 3983.0 | 1.071 |
| 3984.0 | 1.071 |
| 3985.0 | 1.071 |
| 3986.0 | 1.071 |
| 3987.0 | 1.071 |
| 3988.0 | 1.071 |
| 3989.0 | 1.071 |
| 3990.0 | 1.071 |
| 3991.0 | 1.071 |
| 3992.0 | 1.071 |
| 3993.0 | 1.071 |
| 3994.0 | 1.071 |
| 3995.0 | 1.071 |
| 3996.0 | 1.071 |
| 3997.0 | 1.071 |
| 3998.0 | 1.071 |
| 3999.0 | 1.071 |
| 4000.0 | 1.071 |
| 4001.0 | 1.071 |
| 4002.0 | 1.071 |
| 4003.0 | 1.071 |
| 4004.0 | 1.071 |
| 4005.0 | 1.071 |
| 4006.0 | 1.071 |
| 4007.0 | 1.071 |
| 4008.0 | 1.071 |
| 4009.0 | 1.071 |
| 4010.0 | 1.071 |
| 4011.0 | 1.071 |
| 4012.0 | 1.071 |
| 4013.0 | 1.071 |
| 4014.0 | 1.071 |
| 4015.0 | 1.071 |
| 4016.0 | 1.071 |
| 4017.0 | 1.071 |
| 4018.0 | 1.071 |
| 4019.0 | 1.071 |
| 4020.0 | 1.071 |
| 4021.0 | 1.071 |
| 4022.0 | 1.071 |
| 4023.0 | 1.071 |
| 4024.0 | 1.071 |
| 4025.0 | 1.071 |
| 4026.0 | 1.071 |
| 4027.0 | 1.071 |
| 4028.0 | 1.071 |
| 4029.0 | 1.071 |
| 4030.0 | 1.071 |
| 4031.0 | 1.071 |
| 4032.0 | 1.071 |
| 4033.0 | 1.071 |
| 4034.0 | 1.071 |
| 4035.0 | 1.071 |
| 4036.0 | 1.071 |
| 4037.0 | 1.071 |
| 4038.0 | 1.071 |
| 4039.0 | 1.071 |
| 4040.0 | 1.071 |
| 4041.0 | 1.071 |
| 4042.0 | 1.071 |
| 4043.0 | 1.071 |
| 4044.0 | 1.071 |
| 4045.0 | 1.071 |
| 4046.0 | 1.071 |
| 4047.0 | 1.071 |
| 4048.0 | 1.071 |
| 4049.0 | 1.071 |
| 4050.0 | 1.071 |
| 4051.0 | 1.071 |
| 4052.0 | 1.071 |
| 4053.0 | 1.071 |
| 4054.0 | 1.071 |
| 4055.0 | 1.071 |
| 4056.0 | 1.071 |
| 4057.0 | 1.071 |
| 4058.0 | 1.071 |
| 4059.0 | 1.071 |
| 4060.0 | 1.071 |
| 4061.0 | 1.071 |
| 4062.0 | 1.071 |
| 4063.0 | 1.071 |
| 4064.0 | 1.071 |
| 4065.0 | 1.071 |
| 4066.0 | 1.071 |
| 4067.0 | 1.071 |
| 4068.0 | 1.071 |
| 4069.0 | 1.071 |
| 4070.0 | 1.071 |
| 4071.0 | 1.071 |
| 4072.0 | 1.071 |
| 4073.0 | 1.071 |
| 4074.0 | 1.071 |
| 4075.0 | 1.071 |
| 4076.0 | 1.071 |
| 4077.0 | 1.071 |
| 4078.0 | 1.071 |
| 4079.0 | 1.071 |
| 4080.0 | 1.071 |
| 4081.0 | 1.071 |
| 4082.0 | 1.071 |
| 4083.0 | 1.071 |
| 4084.0 | 1.071 |
| 4085.0 | 1.071 |
| 4086.0 | 1.071 |
| 4087.0 | 1.071 |
| 4088.0 | 1.071 |
| 4089.0 | 1.071 |
| 4090.0 | 1.071 |
| 4091.0 | 1.071 |
| 4092.0 | 1.071 |
| 4093.0 | 1.071 |
| 4094.0 | 1.071 |
| 4095.0 | 1.071 |
| 4096.0 | 1.071 |
| 4097.0 | 1.071 |
| 4098.0 | 1.071 |
| 4099.0 | 1.071 |
| 4100.0 | 1.071 |
| 4101.0 | 1.071 |
| 4102.0 | 1.071 |
| 4103.0 | 1.071 |
| 4104.0 | 1.071 |
| 4105.0 | 1.071 |
| 4106.0 | 1.071 |
| 4107.0 | 1.071 |
| 4108.0 | 1.071 |
| 4109.0 | 1.071 |
| 4110.0 | 1.071 |
| 4111.0 | 1.071 |
| 4112.0 | 1.071 |
| 4113.0 | 1.071 |
| 4114.0 | 1.071 |
| 4115.0 | 1.071 |
| 4116.0 | 1.071 |
| 4117.0 | 1.071 |
| 4118.0 | 1.071 |
| 4119.0 | 1.071 |
| 4120.0 | 1.071 |
| 4121.0 | 1.071 |
| 4122.0 | 1.071 |
| 4123.0 | 1.071 |
| 4124.0 | 1.071 |
| 4125.0 | 1.071 |
| 4126.0 | 1.071 |
| 4127.0 | 1.071 |
| 4128.0 | 1.071 |
| 4129.0 | 1.071 |
| 4130.0 | 1.071 |
| 4131.0 | 1.071 |
| 4132.0 | 1.071 |
| 4133.0 | 1.071 |
| 4134.0 | 1.071 |
| 4135.0 | 1.071 |
| 4136.0 | 1.071 |
| 4137.0 | 1.071 |
| 4138.0 | 1.071 |
| 4139.0 | 1.071 |
| 4140.0 | 1.071 |
| 4141.0 | 1.071 |
| 4142.0 | 1.071 |
| 4143.0 | 1.071 |
| 4144.0 | 1.071 |
| 4145.0 | 1.071 |
| 4146.0 | 1.071 |
| 4147.0 | 1.071 |
| 4148.0 | 1.071 |
| 4149.0 | 1.071 |
| 4150.0 | 1.071 |
| 4151.0 | 1.071 |
| 4152.0 | 1.071 |
| 4153.0 | 1.071 |
| 4154.0 | 1.071 |
| 4155.0 | 1.071 |
| 4156.0 | 1.071 |
| 4157.0 | 1.071 |
| 4158.0 | 1.071 |
| 4159.0 | 1.071 |
| 4160.0 | 1.071 |
| 4161.0 | 1.071 |
| 4162.0 | 1.071 |
| 4163.0 | 1.071 |
| 4164.0 | 1.071 |
| 4165.0 | 1.071 |
| 4166.0 | 1.071 |
| 4167.0 | 1.071 |
| 4168.0 | 1.071 |
| 4169.0 | 1.071 |
| 4170.0 | 1.071 |
| 4171.0 | 1.071 |
| 4172.0 | 1.071 |
| 4173.0 | 1.071 |
| 4174.0 | 1.071 |
| 4175.0 | 1.071 |
| 4176.0 | 1.071 |
| 4177.0 | 1.071 |
| 4178.0 | 1.071 |
| 4179.0 | 1.071 |
| 4180.0 | 1.071 |
| 4181.0 | 1.071 |
| 4182.0 | 1.071 |
| 4183.0 | 1.071 |
| 4184.0 | 1.071 |
| 4185.0 | 1.071 |
| 4186.0 | 1.071 |
| 4187.0 | 1.071 |
| 4188.0 | 1.071 |
| 4189.0 | 1.071 |
| 4190.0 | 1.071 |
| 4191.0 | 1.071 |
| 4192.0 | 1.071 |
| 4193.0 | 1.071 |
| 4194.0 | 1.071 |
| 4195.0 | 1.071 |
| 4196.0 | 1.071 |
| 4197.0 | 1.071 |
| 4198.0 | 1.071 |
| 4199.0 | 1.071 |
| 4200.0 | 1.071 |
| 4201.0 | 1.071 |
| 4202.0 | 1.071 |
| 4203.0 | 1.071 |
| 4204.0 | 1.071 |
| 4205.0 | 1.071 |
| 4206.0 | 1.071 |
| 4207.0 | 1.071 |
| 4208.0 | 1.071 |
| 4209.0 | 1.071 |
| 4210.0 | 1.071 |
| 4211.0 | 1.071 |
| 4212.0 | 1.071 |
| 4213.0 | 1.071 |
| 4214.0 | 1.071 |
| 4215.0 | 1.071 |
| 4216.0 | 1.071 |
| 4217.0 | 1.071 |
| 4218.0 | 1.071 |
| 4219.0 | 1.071 |
| 4220.0 | 1.071 |
| 4221.0 | 1.071 |
| 4222.0 | 1.071 |
| 4223.0 | 1.071 |
| 4224.0 | 1.071 |
| 4225.0 | 1.071 |
| 4226.0 | 1.071 |
| 4227.0 | 1.071 |
| 4228.0 | 1.071 |
| 4229.0 | 1.071 |
| 4230.0 | 1.071 |
| 4231.0 | 1.071 |
| 4232.0 | 1.071 |
| 4233.0 | 1.071 |
| 4234.0 | 1.071 |
| 4235.0 | 1.071 |
| 4236.0 | 1.071 |
| 4237.0 | 1.071 |
| 4238.0 | 1.071 |
| 4239.0 | 1.071 |
| 4240.0 | 1.071 |
| 4241.0 | 1.071 |
| 4242.0 | 1.071 |
| 4243.0 | 1.071 |
| 4244.0 | 1.071 |
| 4245.0 | 1.071 |
| 4246.0 | 1.071 |
| 4247.0 | 1.071 |
| 4248.0 | 1.071 |
| 4249.0 | 1.071 |
| 4250.0 | 1.071 |
| 4251.0 | 1.071 |
| 4252.0 | 1.071 |
| 4253.0 | 1.071 |
| 4254.0 | 1.071 |
| 4255.0 | 1.071 |
| 4256.0 | 1.071 |
| 4257.0 | 1.071 |
| 4258.0 | 1.071 |
| 4259.0 | 1.071 |
| 4260.0 | 1.071 |
| 4261.0 | 1.071 |
| 4262.0 | 1.071 |
| 4263.0 | 1.071 |
| 4264.0 | 1.071 |
| 4265.0 | 1.071 |
| 4266.0 | 1.071 |
| 4267.0 | 1.071 |
| 4268.0 | 1.071 |
| 4269.0 | 1.071 |
| 4270.0 | 1.071 |
| 4271.0 | 1.071 |
| 4272.0 | 1.071 |
| 4273.0 | 1.071 |
| 4274.0 | 1.071 |
| 4275.0 | 1.071 |
| 4276.0 | 1.071 |
| 4277.0 | 1.071 |
| 4278.0 | 1.071 |
| 4279.0 | 1.071 |
| 4280.0 | 1.071 |
| 4281.0 | 1.071 |
| 4282.0 | 1.071 |
| 4283.0 | 1.071 |
| 4284.0 | 1.071 |
| 4285.0 | 1.071 |
| 4286.0 | 1.071 |
| 4287.0 | 1.071 |
| 4288.0 | 1.071 |
| 4289.0 | 1.071 |
| 4290.0 | 1.071 |
| 4291.0 | 1.071 |
| 4292.0 | 1.071 |
| 4293.0 | 1.071 |
| 4294.0 | 1.071 |
| 4295.0 | 1.071 |
| 4296.0 | 1.071 |
| 4297.0 | 1.071 |
| 4298.0 | 1.071 |
| 4299.0 | 1.071 |
| 4300.0 | 1.071 |
| 4301.0 | 1.071 |
| 4302.0 | 1.071 |
| 4303.0 | 1.071 |
| 4304.0 | 1.071 |
| 4305.0 | 1.071 |
| 4306.0 | 1.071 |
| 4307.0 | 1.071 |
| 4308.0 | 1.071 |
| 4309.0 | 1.071 |
| 4310.0 | 1.071 |
| 4311.0 | 1.071 |
| 4312.0 | 1.071 |
| 4313.0 | 1.071 |
| 4314.0 | 1.071 |
| 4315.0 | 1.071 |
| 4316.0 | 1.071 |
| 4317.0 | 1.071 |
| 4318.0 | 1.071 |
| 4319.0 | 1.071 |
| 4320.0 | 1.071 |
| 4321.0 | 1.071 |
| 4322.0 | 1.071 |
| 4323.0 | 1.071 |
| 4324.0 | 1.071 |
| 4325.0 | 1.071 |
| 4326.0 | 1.071 |
| 4327.0 | 1.071 |
| 4328.0 | 1.071 |
| 4329.0 | 1.071 |
| 4330.0 | 1.071 |
| 4331.0 | 1.071 |
| 4332.0 | 1.071 |
| 4333.0 | 1.071 |
| 4334.0 | 1.071 |
| 4335.0 | 1.071 |
| 4336.0 | 1.071 |
| 4337.0 | 1.071 |
| 4338.0 | 1.071 |
| 4339.0 | 1.071 |
| 4340.0 | 1.071 |
| 4341.0 | 1.071 |
| 4342.0 | 1.071 |
| 4343.0 | 1.071 |
| 4344.0 | 1.071 |
| 4345.0 | 1.071 |
| 4346.0 | 1.071 |
| 4347.0 | 1.071 |
| 4348.0 | 1.071 |
| 4349.0 | 1.071 |
| 4350.0 | 1.071 |
| 4351.0 | 1.071 |
| 4352.0 | 1.071 |
| 4353.0 | 1.071 |
| 4354.0 | 1.071 |
| 4355.0 | 1.071 |
| 4356.0 | 1.071 |
| 4357.0 | 1.071 |
| 4358.0 | 1.071 |
| 4359.0 | 1.071 |
| 4360.0 | 1.071 |
| 4361.0 | 1.071 |
| 4362.0 | 1.071 |
| 4363.0 | 1.071 |
| 4364.0 | 1.071 |
| 4365.0 | 1.071 |
| 4366.0 | 1.071 |
| 4367.0 | 1.071 |
| 4368.0 | 1.071 |
| 4369.0 | 1.071 |
| 4370.0 | 1.071 |
| 4371.0 | 1.071 |
| 4372.0 | 1.071 |
| 4373.0 | 1.071 |
| 4374.0 | 1.071 |
| 4375.0 | 1.071 |
| 4376.0 | 1.071 |
| 4377.0 | 1.071 |
| 4378.0 | 1.071 |
| 4379.0 | 1.071 |
| 4380.0 | 1.071 |
| 4381.0 | 1.071 |
| 4382.0 | 1.071 |
| 4383.0 | 1.071 |
| 4384.0 | 1.071 |
| 4385.0 | 1.071 |
| 4386.0 | 1.071 |
| 4387.0 | 1.071 |
| 4388.0 | 1.071 |
| 4389.0 | 1.071 |
| 4390.0 | 1.071 |
| 4391.0 | 1.071 |
| 4392.0 | 1.071 |
| 4393.0 | 1.071 |
| 4394.0 | 1.071 |
| 4395.0 | 1.071 |
| 4396.0 | 1.071 |
| 4397.0 | 1.071 |
| 4398.0 | 1.071 |
| 4399.0 | 1.071 |
| 4400.0 | 1.071 |
| 4401.0 | 1.071 |
| 4402.0 | 1.071 |
| 4403.0 | 1.071 |
| 4404.0 | 1.071 |
| 4405.0 | 1.071 |
| 4406.0 | 1.071 |
| 4407.0 | 1.071 |
| 4408.0 | 1.071 |
| 4409.0 | 1.071 |
| 4410.0 | 1.071 |
| 4411.0 | 1.071 |
| 4412.0 | 1.071 |
| 4413.0 | 1.071 |
| 4414.0 | 1.071 |
| 4415.0 | 1.071 |
| 4416.0 | 1.071 |
| 4417.0 | 1.071 |
| 4418.0 | 1.071 |
| 4419.0 | 1.071 |
| 4420.0 | 1.071 |
| 4421.0 | 1.071 |
| 4422.0 | 1.071 |
| 4423.0 | 1.071 |
| 4424.0 | 1.071 |
| 4425.0 | 1.071 |
| 4426.0 | 1.071 |
| 4427.0 | 1.071 |
| 4428.0 | 1.071 |
| 4429.0 | 1.071 |
| 4430.0 | 1.071 |
| 4431.0 | 1.071 |
| 4432.0 | 1.071 |
| 4433.0 | 1.071 |
| 4434.0 | 1.071 |
| 4435.0 | 1.071 |
| 4436.0 | 1.071 |
| 4437.0 | 1.071 |
| 4438.0 | 1.071 |
| 4439.0 | 1.071 |
| 4440.0 | 1.071 |
| 4441.0 | 1.071 |
| 4442.0 | 1.071 |
| 4443.0 | 1.071 |
| 4444.0 | 1.071 |
| 4445.0 | 1.071 |
| 4446.0 | 1.071 |
| 4447.0 | 1.071 |
| 4448.0 | 1.071 |
| 4449.0 | 1.071 |
| 4450.0 | 1.071 |
| 4451.0 | 1.071 |
| 4452.0 | 1.071 |
| 4453.0 | 1.071 |
| 4454.0 | 1.071 |
| 4455.0 | 1.071 |
| 4456.0 | 1.071 |
| 4457.0 | 1.071 |
| 4458.0 | 1.071 |
| 4459.0 | 1.071 |
| 4460.0 | 1.071 |
| 4461.0 | 1.071 |
| 4462.0 | 1.071 |
| 4463.0 | 1.071 |
| 4464.0 | 1.072 |
| 4465.0 | 1.072 |
| 4466.0 | 1.072 |
| 4467.0 | 1.072 |
| 4468.0 | 1.072 |
| 4469.0 | 1.072 |
| 4470.0 | 1.072 |
| 4471.0 | 1.072 |
| 4472.0 | 1.072 |
| 4473.0 | 1.072 |
| 4474.0 | 1.072 |
| 4475.0 | 1.072 |
| 4476.0 | 1.072 |
| 4477.0 | 1.072 |
| 4478.0 | 1.072 |
| 4479.0 | 1.072 |
| 4480.0 | 1.072 |
| 4481.0 | 1.072 |
| 4482.0 | 1.072 |
| 4483.0 | 1.072 |
| 4484.0 | 1.072 |
| 4485.0 | 1.072 |
| 4486.0 | 1.072 |
| 4487.0 | 1.072 |
| 4488.0 | 1.072 |
| 4489.0 | 1.072 |
| 4490.0 | 1.072 |
| 4491.0 | 1.072 |
| 4492.0 | 1.072 |
| 4493.0 | 1.072 |
| 4494.0 | 1.072 |
| 4495.0 | 1.072 |
| 4496.0 | 1.072 |
| 4497.0 | 1.072 |
| 4498.0 | 1.072 |
| 4499.0 | 1.072 |
| 4500.0 | 1.072 |
| 4501.0 | 1.072 |
| 4502.0 | 1.072 |
| 4503.0 | 1.072 |
| 4504.0 | 1.072 |
| 4505.0 | 1.072 |
| 4506.0 | 1.072 |
| 4507.0 | 1.072 |
| 4508.0 | 1.072 |
| 4509.0 | 1.072 |
| 4510.0 | 1.072 |
| 4511.0 | 1.072 |
| 4512.0 | 1.072 |
| 4513.0 | 1.072 |
| 4514.0 | 1.072 |
| 4515.0 | 1.072 |
| 4516.0 | 1.072 |
| 4517.0 | 1.072 |
| 4518.0 | 1.072 |
| 4519.0 | 1.072 |
| 4520.0 | 1.072 |
| 4521.0 | 1.072 |
| 4522.0 | 1.072 |
| 4523.0 | 1.072 |
| 4524.0 | 1.072 |
| 4525.0 | 1.072 |
| 4526.0 | 1.072 |
| 4527.0 | 1.072 |
| 4528.0 | 1.072 |
| 4529.0 | 1.072 |
| 4530.0 | 1.072 |
| 4531.0 | 1.072 |
| 4532.0 | 1.072 |
| 4533.0 | 1.072 |
| 4534.0 | 1.072 |
| 4535.0 | 1.072 |
| 4536.0 | 1.072 |
| 4537.0 | 1.072 |
| 4538.0 | 1.072 |
| 4539.0 | 1.072 |
| 4540.0 | 1.072 |
| 4541.0 | 1.072 |
| 4542.0 | 1.072 |
| 4543.0 | 1.072 |
| 4544.0 | 1.072 |
| 4545.0 | 1.072 |
| 4546.0 | 1.072 |
| 4547.0 | 1.072 |
| 4548.0 | 1.072 |
| 4549.0 | 1.072 |
| 4550.0 | 1.072 |
| 4551.0 | 1.072 |
| 4552.0 | 1.072 |
| 4553.0 | 1.072 |
| 4554.0 | 1.072 |
| 4555.0 | 1.072 |
| 4556.0 | 1.072 |
| 4557.0 | 1.072 |
| 4558.0 | 1.072 |
| 4559.0 | 1.072 |
| 4560.0 | 1.072 |
| 4561.0 | 1.072 |
| 4562.0 | 1.072 |
| 4563.0 | 1.072 |
| 4564.0 | 1.072 |
| 4565.0 | 1.072 |
| 4566.0 | 1.072 |
| 4567.0 | 1.072 |
| 4568.0 | 1.072 |
| 4569.0 | 1.072 |
| 4570.0 | 1.072 |
| 4571.0 | 1.072 |
| 4572.0 | 1.072 |
| 4573.0 | 1.072 |
| 4574.0 | 1.072 |
| 4575.0 | 1.072 |
| 4576.0 | 1.072 |
| 4577.0 | 1.072 |
| 4578.0 | 1.072 |
| 4579.0 | 1.072 |
| 4580.0 | 1.072 |
| 4581.0 | 1.072 |
| 4582.0 | 1.072 |
| 4583.0 | 1.072 |
| 4584.0 | 1.072 |
| 4585.0 | 1.072 |
| 4586.0 | 1.072 |
| 4587.0 | 1.072 |
| 4588.0 | 1.072 |
| 4589.0 | 1.072 |
| 4590.0 | 1.072 |
| 4591.0 | 1.072 |
| 4592.0 | 1.072 |
| 4593.0 | 1.072 |
| 4594.0 | 1.072 |
| 4595.0 | 1.072 |
| 4596.0 | 1.072 |
| 4597.0 | 1.072 |
| 4598.0 | 1.072 |
| 4599.0 | 1.072 |
| 4600.0 | 1.072 |
| 4601.0 | 1.072 |
| 4602.0 | 1.072 |
| 4603.0 | 1.072 |
| 4604.0 | 1.072 |
| 4605.0 | 1.072 |
| 4606.0 | 1.072 |
| 4607.0 | 1.072 |
| 4608.0 | 1.072 |
| 4609.0 | 1.072 |
| 4610.0 | 1.072 |
| 4611.0 | 1.072 |
| 4612.0 | 1.072 |
| 4613.0 | 1.072 |
| 4614.0 | 1.072 |
| 4615.0 | 1.072 |
| 4616.0 | 1.072 |
| 4617.0 | 1.072 |
| 4618.0 | 1.072 |
| 4619.0 | 1.072 |
| 4620.0 | 1.072 |
| 4621.0 | 1.072 |
| 4622.0 | 1.072 |
| 4623.0 | 1.072 |
| 4624.0 | 1.072 |
| 4625.0 | 1.072 |
| 4626.0 | 1.072 |
| 4627.0 | 1.072 |
| 4628.0 | 1.072 |
| 4629.0 | 1.072 |
| 4630.0 | 1.072 |
| 4631.0 | 1.072 |
| 4632.0 | 1.072 |
| 4633.0 | 1.072 |
| 4634.0 | 1.072 |
| 4635.0 | 1.072 |
| 4636.0 | 1.072 |
| 4637.0 | 1.072 |
| 4638.0 | 1.072 |
| 4639.0 | 1.072 |
| 4640.0 | 1.072 |
| 4641.0 | 1.072 |
| 4642.0 | 1.072 |
| 4643.0 | 1.072 |
| 4644.0 | 1.072 |
| 4645.0 | 1.072 |
| 4646.0 | 1.072 |
| 4647.0 | 1.072 |
| 4648.0 | 1.072 |
| 4649.0 | 1.072 |
| 4650.0 | 1.072 |
| 4651.0 | 1.072 |
| 4652.0 | 1.072 |
| 4653.0 | 1.072 |
| 4654.0 | 1.072 |
| 4655.0 | 1.072 |
| 4656.0 | 1.072 |
| 4657.0 | 1.072 |
| 4658.0 | 1.072 |
| 4659.0 | 1.072 |
| 4660.0 | 1.072 |
| 4661.0 | 1.072 |
| 4662.0 | 1.072 |
| 4663.0 | 1.072 |
| 4664.0 | 1.072 |
| 4665.0 | 1.072 |
| 4666.0 | 1.072 |
| 4667.0 | 1.072 |
| 4668.0 | 1.072 |
| 4669.0 | 1.072 |
| 4670.0 | 1.072 |
| 4671.0 | 1.072 |
| 4672.0 | 1.072 |
| 4673.0 | 1.072 |
| 4674.0 | 1.072 |
| 4675.0 | 1.072 |
| 4676.0 | 1.072 |
| 4677.0 | 1.072 |
| 4678.0 | 1.072 |
| 4679.0 | 1.072 |
| 4680.0 | 1.072 |
| 4681.0 | 1.072 |
| 4682.0 | 1.072 |
| 4683.0 | 1.072 |
| 4684.0 | 1.072 |
| 4685.0 | 1.072 |
| 4686.0 | 1.072 |
| 4687.0 | 1.072 |
| 4688.0 | 1.072 |
| 4689.0 | 1.072 |
| 4690.0 | 1.072 |
| 4691.0 | 1.072 |
| 4692.0 | 1.072 |
| 4693.0 | 1.072 |
| 4694.0 | 1.072 |
| 4695.0 | 1.072 |
| 4696.0 | 1.072 |
| 4697.0 | 1.072 |
| 4698.0 | 1.072 |
| 4699.0 | 1.072 |
| 4700.0 | 1.072 |
| 4701.0 | 1.072 |
| 4702.0 | 1.072 |
| 4703.0 | 1.072 |
| 4704.0 | 1.072 |
| 4705.0 | 1.072 |
| 4706.0 | 1.072 |
| 4707.0 | 1.072 |
| 4708.0 | 1.072 |
| 4709.0 | 1.072 |
| 4710.0 | 1.072 |
| 4711.0 | 1.072 |
| 4712.0 | 1.072 |
| 4713.0 | 1.072 |
| 4714.0 | 1.072 |
| 4715.0 | 1.072 |
| 4716.0 | 1.072 |
| 4717.0 | 1.072 |
| 4718.0 | 1.072 |
| 4719.0 | 1.072 |
| 4720.0 | 1.072 |
| 4721.0 | 1.072 |
| 4722.0 | 1.072 |
| 4723.0 | 1.072 |
| 4724.0 | 1.072 |
| 4725.0 | 1.072 |
| 4726.0 | 1.072 |
| 4727.0 | 1.072 |
| 4728.0 | 1.072 |
| 4729.0 | 1.072 |
| 4730.0 | 1.072 |
| 4731.0 | 1.072 |
| 4732.0 | 1.072 |
| 4733.0 | 1.072 |
| 4734.0 | 1.072 |
| 4735.0 | 1.072 |
| 4736.0 | 1.072 |
| 4737.0 | 1.072 |
| 4738.0 | 1.072 |
| 4739.0 | 1.072 |
| 4740.0 | 1.072 |
| 4741.0 | 1.072 |
| 4742.0 | 1.072 |
| 4743.0 | 1.072 |
| 4744.0 | 1.072 |
| 4745.0 | 1.072 |
| 4746.0 | 1.072 |
| 4747.0 | 1.072 |
| 4748.0 | 1.072 |
| 4749.0 | 1.072 |
| 4750.0 | 1.072 |
| 4751.0 | 1.072 |
| 4752.0 | 1.072 |
| 4753.0 | 1.072 |
| 4754.0 | 1.072 |
| 4755.0 | 1.072 |
| 4756.0 | 1.072 |
| 4757.0 | 1.072 |
| 4758.0 | 1.072 |
| 4759.0 | 1.072 |
| 4760.0 | 1.072 |
| 4761.0 | 1.072 |
| 4762.0 | 1.072 |
| 4763.0 | 1.072 |
| 4764.0 | 1.072 |
| 4765.0 | 1.072 |
| 4766.0 | 1.072 |
| 4767.0 | 1.072 |
| 4768.0 | 1.072 |
| 4769.0 | 1.072 |
| 4770.0 | 1.072 |
| 4771.0 | 1.072 |
| 4772.0 | 1.072 |
| 4773.0 | 1.072 |
| 4774.0 | 1.072 |
| 4775.0 | 1.072 |
| 4776.0 | 1.072 |
| 4777.0 | 1.072 |
| 4778.0 | 1.072 |
| 4779.0 | 1.072 |
| 4780.0 | 1.072 |
| 4781.0 | 1.072 |
| 4782.0 | 1.072 |
| 4783.0 | 1.072 |
| 4784.0 | 1.072 |
| 4785.0 | 1.072 |
| 4786.0 | 1.072 |
| 4787.0 | 1.072 |
| 4788.0 | 1.072 |
| 4789.0 | 1.072 |
| 4790.0 | 1.072 |
| 4791.0 | 1.072 |
| 4792.0 | 1.072 |
| 4793.0 | 1.072 |
| 4794.0 | 1.072 |
| 4795.0 | 1.072 |
| 4796.0 | 1.072 |
| 4797.0 | 1.072 |
| 4798.0 | 1.072 |
| 4799.0 | 1.072 |
| 4800.0 | 1.072 |
| 4801.0 | 1.072 |
| 4802.0 | 1.072 |
| 4803.0 | 1.072 |
| 4804.0 | 1.072 |
| 4805.0 | 1.072 |
| 4806.0 | 1.072 |
| 4807.0 | 1.072 |
| 4808.0 | 1.072 |
| 4809.0 | 1.072 |
| 4810.0 | 1.072 |
| 4811.0 | 1.072 |
| 4812.0 | 1.072 |
| 4813.0 | 1.072 |
| 4814.0 | 1.072 |
| 4815.0 | 1.072 |
| 4816.0 | 1.072 |
| 4817.0 | 1.072 |
| 4818.0 | 1.072 |
| 4819.0 | 1.072 |
| 4820.0 | 1.072 |
| 4821.0 | 1.072 |
| 4822.0 | 1.072 |
| 4823.0 | 1.072 |
| 4824.0 | 1.072 |
| 4825.0 | 1.072 |
| 4826.0 | 1.072 |
| 4827.0 | 1.072 |
| 4828.0 | 1.072 |
| 4829.0 | 1.072 |
| 4830.0 | 1.072 |
| 4831.0 | 1.072 |
| 4832.0 | 1.072 |
| 4833.0 | 1.072 |
| 4834.0 | 1.072 |
| 4835.0 | 1.072 |
| 4836.0 | 1.072 |
| 4837.0 | 1.072 |
| 4838.0 | 1.072 |
| 4839.0 | 1.072 |
| 4840.0 | 1.072 |
| 4841.0 | 1.072 |
| 4842.0 | 1.072 |
| 4843.0 | 1.072 |
| 4844.0 | 1.072 |
| 4845.0 | 1.072 |
| 4846.0 | 1.072 |
| 4847.0 | 1.072 |
| 4848.0 | 1.072 |
| 4849.0 | 1.072 |
| 4850.0 | 1.072 |
| 4851.0 | 1.072 |
| 4852.0 | 1.072 |
| 4853.0 | 1.072 |
| 4854.0 | 1.072 |
| 4855.0 | 1.072 |
| 4856.0 | 1.072 |
| 4857.0 | 1.072 |
| 4858.0 | 1.072 |
| 4859.0 | 1.072 |
| 4860.0 | 1.072 |
| 4861.0 | 1.072 |
| 4862.0 | 1.072 |
| 4863.0 | 1.072 |
| 4864.0 | 1.072 |
| 4865.0 | 1.072 |
| 4866.0 | 1.072 |
| 4867.0 | 1.072 |
| 4868.0 | 1.072 |
| 4869.0 | 1.072 |
| 4870.0 | 1.072 |
| 4871.0 | 1.072 |
| 4872.0 | 1.072 |
| 4873.0 | 1.072 |
| 4874.0 | 1.072 |
| 4875.0 | 1.072 |
| 4876.0 | 1.072 |
| 4877.0 | 1.072 |
| 4878.0 | 1.072 |
| 4879.0 | 1.072 |
| 4880.0 | 1.072 |
| 4881.0 | 1.072 |
| 4882.0 | 1.072 |
| 4883.0 | 1.072 |
| 4884.0 | 1.072 |
| 4885.0 | 1.072 |
| 4886.0 | 1.072 |
| 4887.0 | 1.072 |
| 4888.0 | 1.072 |
| 4889.0 | 1.072 |
| 4890.0 | 1.072 |
| 4891.0 | 1.072 |
| 4892.0 | 1.072 |
| 4893.0 | 1.072 |
| 4894.0 | 1.072 |
| 4895.0 | 1.072 |
| 4896.0 | 1.072 |
| 4897.0 | 1.072 |
| 4898.0 | 1.072 |
| 4899.0 | 1.072 |
| 4900.0 | 1.072 |
| 4901.0 | 1.072 |
| 4902.0 | 1.072 |
| 4903.0 | 1.072 |
| 4904.0 | 1.072 |
| 4905.0 | 1.072 |
| 4906.0 | 1.072 |
| 4907.0 | 1.072 |
| 4908.0 | 1.072 |
| 4909.0 | 1.072 |
| 4910.0 | 1.072 |
| 4911.0 | 1.072 |
| 4912.0 | 1.072 |
| 4913.0 | 1.072 |
| 4914.0 | 1.072 |
| 4915.0 | 1.072 |
| 4916.0 | 1.072 |
| 4917.0 | 1.072 |
| 4918.0 | 1.072 |
| 4919.0 | 1.072 |
| 4920.0 | 1.072 |
| 4921.0 | 1.072 |
| 4922.0 | 1.072 |
| 4923.0 | 1.072 |
| 4924.0 | 1.072 |
| 4925.0 | 1.072 |
| 4926.0 | 1.072 |
| 4927.0 | 1.072 |
| 4928.0 | 1.072 |
| 4929.0 | 1.072 |
| 4930.0 | 1.072 |
| 4931.0 | 1.072 |
| 4932.0 | 1.072 |
| 4933.0 | 1.072 |
| 4934.0 | 1.072 |
| 4935.0 | 1.072 |
| 4936.0 | 1.072 |
| 4937.0 | 1.072 |
| 4938.0 | 1.072 |
| 4939.0 | 1.072 |
| 4940.0 | 1.072 |
| 4941.0 | 1.072 |
| 4942.0 | 1.072 |
| 4943.0 | 1.072 |
| 4944.0 | 1.072 |
| 4945.0 | 1.072 |
| 4946.0 | 1.072 |
| 4947.0 | 1.072 |
| 4948.0 | 1.072 |
| 4949.0 | 1.072 |
| 4950.0 | 1.072 |
| 4951.0 | 1.072 |
| 4952.0 | 1.072 |
| 4953.0 | 1.072 |
| 4954.0 | 1.072 |
| 4955.0 | 1.072 |
| 4956.0 | 1.072 |
| 4957.0 | 1.072 |
| 4958.0 | 1.072 |
| 4959.0 | 1.072 |
| 4960.0 | 1.072 |
| 4961.0 | 1.072 |
| 4962.0 | 1.072 |
| 4963.0 | 1.072 |
| 4964.0 | 1.072 |
| 4965.0 | 1.072 |
| 4966.0 | 1.072 |
| 4967.0 | 1.072 |
| 4968.0 | 1.072 |
| 4969.0 | 1.072 |
| 4970.0 | 1.072 |
| 4971.0 | 1.072 |
| 4972.0 | 1.072 |
| 4973.0 | 1.072 |
| 4974.0 | 1.072 |
| 4975.0 | 1.072 |
| 4976.0 | 1.072 |
| 4977.0 | 1.072 |
| 4978.0 | 1.072 |
| 4979.0 | 1.072 |
| 4980.0 | 1.072 |
| 4981.0 | 1.072 |
| 4982.0 | 1.072 |
| 4983.0 | 1.072 |
| 4984.0 | 1.072 |
| 4985.0 | 1.072 |
| 4986.0 | 1.072 |
| 4987.0 | 1.072 |
| 4988.0 | 1.072 |
| 4989.0 | 1.072 |
| 4990.0 | 1.072 |
| 4991.0 | 1.072 |
| 4992.0 | 1.072 |
| 4993.0 | 1.072 |
| 4994.0 | 1.072 |
| 4995.0 | 1.072 |
| 4996.0 | 1.072 |
| 4997.0 | 1.072 |
| 4998.0 | 1.072 |
| 4999.0 | 1.072 |
| 5000.0 | 1.072 |
| 5001.0 | 1.072 |
| 5002.0 | 1.072 |
| 5003.0 | 1.072 |
| 5004.0 | 1.072 |
| 5005.0 | 1.072 |
| 5006.0 | 1.072 |
| 5007.0 | 1.072 |
| 5008.0 | 1.072 |
| 5009.0 | 1.072 |
| 5010.0 | 1.072 |
| 5011.0 | 1.072 |
| 5012.0 | 1.072 |
| 5013.0 | 1.072 |
| 5014.0 | 1.072 |
| 5015.0 | 1.072 |
| 5016.0 | 1.072 |
| 5017.0 | 1.072 |
| 5018.0 | 1.072 |
| 5019.0 | 1.072 |
| 5020.0 | 1.072 |
| 5021.0 | 1.072 |
| 5022.0 | 1.072 |
| 5023.0 | 1.072 |
| 5024.0 | 1.072 |
| 5025.0 | 1.072 |
| 5026.0 | 1.072 |
| 5027.0 | 1.072 |
| 5028.0 | 1.072 |
| 5029.0 | 1.072 |
| 5030.0 | 1.072 |
| 5031.0 | 1.072 |
| 5032.0 | 1.072 |
| 5033.0 | 1.072 |
| 5034.0 | 1.072 |
| 5035.0 | 1.072 |
| 5036.0 | 1.072 |
| 5037.0 | 1.072 |
| 5038.0 | 1.072 |
| 5039.0 | 1.072 |
| 5040.0 | 1.072 |
| 5041.0 | 1.072 |
| 5042.0 | 1.072 |
| 5043.0 | 1.072 |
| 5044.0 | 1.072 |
| 5045.0 | 1.072 |
| 5046.0 | 1.072 |
| 5047.0 | 1.072 |
| 5048.0 | 1.072 |
| 5049.0 | 1.072 |
| 5050.0 | 1.072 |
| 5051.0 | 1.072 |
| 5052.0 | 1.072 |
| 5053.0 | 1.072 |
| 5054.0 | 1.072 |
| 5055.0 | 1.072 |
| 5056.0 | 1.072 |
| 5057.0 | 1.072 |
| 5058.0 | 1.072 |
| 5059.0 | 1.072 |
| 5060.0 | 1.072 |
| 5061.0 | 1.072 |
| 5062.0 | 1.072 |
| 5063.0 | 1.072 |
| 5064.0 | 1.072 |
| 5065.0 | 1.072 |
| 5066.0 | 1.072 |
| 5067.0 | 1.072 |
| 5068.0 | 1.072 |
| 5069.0 | 1.072 |
| 5070.0 | 1.072 |
| 5071.0 | 1.072 |
| 5072.0 | 1.072 |
| 5073.0 | 1.072 |
| 5074.0 | 1.072 |
| 5075.0 | 1.072 |
| 5076.0 | 1.072 |
| 5077.0 | 1.072 |
| 5078.0 | 1.072 |
| 5079.0 | 1.072 |
| 5080.0 | 1.072 |
| 5081.0 | 1.072 |
| 5082.0 | 1.072 |
| 5083.0 | 1.072 |
| 5084.0 | 1.072 |
| 5085.0 | 1.072 |
| 5086.0 | 1.072 |
| 5087.0 | 1.072 |
| 5088.0 | 1.072 |
| 5089.0 | 1.072 |
| 5090.0 | 1.072 |
| 5091.0 | 1.072 |
| 5092.0 | 1.072 |
| 5093.0 | 1.072 |
| 5094.0 | 1.072 |
| 5095.0 | 1.072 |
| 5096.0 | 1.072 |
| 5097.0 | 1.072 |
| 5098.0 | 1.072 |
| 5099.0 | 1.072 |
| 5100.0 | 1.072 |
| 5101.0 | 1.072 |
| 5102.0 | 1.072 |
| 5103.0 | 1.072 |
| 5104.0 | 1.072 |
| 5105.0 | 1.072 |
| 5106.0 | 1.072 |
| 5107.0 | 1.072 |
| 5108.0 | 1.072 |
| 5109.0 | 1.072 |
| 5110.0 | 1.072 |
| 5111.0 | 1.072 |
| 5112.0 | 1.072 |
| 5113.0 | 1.072 |
| 5114.0 | 1.072 |
| 5115.0 | 1.072 |
| 5116.0 | 1.072 |
| 5117.0 | 1.072 |
| 5118.0 | 1.072 |
| 5119.0 | 1.072 |
| 5120.0 | 1.072 |
| 5121.0 | 1.072 |
| 5122.0 | 1.072 |
| 5123.0 | 1.072 |
| 5124.0 | 1.072 |
| 5125.0 | 1.072 |
| 5126.0 | 1.072 |
| 5127.0 | 1.072 |
| 5128.0 | 1.072 |
| 5129.0 | 1.072 |
| 5130.0 | 1.072 |
| 5131.0 | 1.072 |
| 5132.0 | 1.072 |
| 5133.0 | 1.072 |
| 5134.0 | 1.072 |
| 5135.0 | 1.072 |
| 5136.0 | 1.072 |
| 5137.0 | 1.072 |
| 5138.0 | 1.072 |
| 5139.0 | 1.072 |
| 5140.0 | 1.072 |
| 5141.0 | 1.072 |
| 5142.0 | 1.072 |
| 5143.0 | 1.072 |
| 5144.0 | 1.072 |
| 5145.0 | 1.072 |
| 5146.0 | 1.072 |
| 5147.0 | 1.072 |
| 5148.0 | 1.072 |
| 5149.0 | 1.072 |
| 5150.0 | 1.072 |
| 5151.0 | 1.072 |
| 5152.0 | 1.072 |
| 5153.0 | 1.072 |
| 5154.0 | 1.072 |
| 5155.0 | 1.072 |
| 5156.0 | 1.072 |
| 5157.0 | 1.072 |
| 5158.0 | 1.072 |
| 5159.0 | 1.072 |
| 5160.0 | 1.072 |
| 5161.0 | 1.072 |
| 5162.0 | 1.072 |
| 5163.0 | 1.072 |
| 5164.0 | 1.072 |
| 5165.0 | 1.072 |
| 5166.0 | 1.072 |
| 5167.0 | 1.072 |
| 5168.0 | 1.072 |
| 5169.0 | 1.072 |
| 5170.0 | 1.072 |
| 5171.0 | 1.072 |
| 5172.0 | 1.072 |
| 5173.0 | 1.072 |
| 5174.0 | 1.072 |
| 5175.0 | 1.072 |
| 5176.0 | 1.072 |
| 5177.0 | 1.072 |
| 5178.0 | 1.072 |
| 5179.0 | 1.072 |
| 5180.0 | 1.072 |
| 5181.0 | 1.072 |
| 5182.0 | 1.072 |
| 5183.0 | 1.072 |
| 5184.0 | 1.072 |
| 5185.0 | 1.072 |
| 5186.0 | 1.072 |
| 5187.0 | 1.072 |
| 5188.0 | 1.072 |
| 5189.0 | 1.072 |
| 5190.0 | 1.072 |
| 5191.0 | 1.072 |
| 5192.0 | 1.072 |
| 5193.0 | 1.072 |
| 5194.0 | 1.072 |
| 5195.0 | 1.072 |
| 5196.0 | 1.072 |
| 5197.0 | 1.072 |
| 5198.0 | 1.072 |
| 5199.0 | 1.072 |
| 5200.0 | 1.072 |
| 5201.0 | 1.072 |
| 5202.0 | 1.072 |
| 5203.0 | 1.072 |
| 5204.0 | 1.072 |
| 5205.0 | 1.072 |
| 5206.0 | 1.072 |
| 5207.0 | 1.072 |
| 5208.0 | 1.072 |
| 5209.0 | 1.072 |
| 5210.0 | 1.072 |
| 5211.0 | 1.072 |
| 5212.0 | 1.072 |
| 5213.0 | 1.072 |
| 5214.0 | 1.072 |
| 5215.0 | 1.072 |
| 5216.0 | 1.072 |
| 5217.0 | 1.072 |
| 5218.0 | 1.072 |
| 5219.0 | 1.072 |
| 5220.0 | 1.072 |
| 5221.0 | 1.072 |
| 5222.0 | 1.072 |
| 5223.0 | 1.072 |
| 5224.0 | 1.072 |
| 5225.0 | 1.072 |
| 5226.0 | 1.072 |
| 5227.0 | 1.072 |
| 5228.0 | 1.072 |
| 5229.0 | 1.072 |
| 5230.0 | 1.072 |
| 5231.0 | 1.072 |
| 5232.0 | 1.072 |
| 5233.0 | 1.072 |
| 5234.0 | 1.072 |
| 5235.0 | 1.072 |
| 5236.0 | 1.072 |
| 5237.0 | 1.072 |
| 5238.0 | 1.072 |
| 5239.0 | 1.072 |
| 5240.0 | 1.072 |
| 5241.0 | 1.072 |
| 5242.0 | 1.072 |
| 5243.0 | 1.072 |
| 5244.0 | 1.072 |
| 5245.0 | 1.072 |
| 5246.0 | 1.072 |
| 5247.0 | 1.072 |
| 5248.0 | 1.072 |
| 5249.0 | 1.072 |
| 5250.0 | 1.072 |
| 5251.0 | 1.072 |
| 5252.0 | 1.072 |
| 5253.0 | 1.072 |
| 5254.0 | 1.072 |
| 5255.0 | 1.072 |
| 5256.0 | 1.072 |
| 5257.0 | 1.072 |
| 5258.0 | 1.072 |
| 5259.0 | 1.072 |
| 5260.0 | 1.072 |
| 5261.0 | 1.072 |
| 5262.0 | 1.072 |
| 5263.0 | 1.072 |
| 5264.0 | 1.072 |
| 5265.0 | 1.072 |
| 5266.0 | 1.072 |
| 5267.0 | 1.072 |
| 5268.0 | 1.072 |
| 5269.0 | 1.072 |
| 5270.0 | 1.072 |
| 5271.0 | 1.072 |
| 5272.0 | 1.072 |
| 5273.0 | 1.072 |
| 5274.0 | 1.072 |
| 5275.0 | 1.072 |
| 5276.0 | 1.072 |
| 5277.0 | 1.072 |
| 5278.0 | 1.072 |
| 5279.0 | 1.072 |
| 5280.0 | 1.072 |
| 5281.0 | 1.072 |
| 5282.0 | 1.072 |
| 5283.0 | 1.072 |
| 5284.0 | 1.072 |
| 5285.0 | 1.072 |
| 5286.0 | 1.072 |
| 5287.0 | 1.072 |
| 5288.0 | 1.072 |
| 5289.0 | 1.072 |
| 5290.0 | 1.072 |
| 5291.0 | 1.072 |
| 5292.0 | 1.072 |
| 5293.0 | 1.072 |
| 5294.0 | 1.072 |
| 5295.0 | 1.072 |
| 5296.0 | 1.072 |
| 5297.0 | 1.072 |
| 5298.0 | 1.072 |
| 5299.0 | 1.072 |
| 5300.0 | 1.072 |
| 5301.0 | 1.072 |
| 5302.0 | 1.072 |
| 5303.0 | 1.072 |
| 5304.0 | 1.072 |
| 5305.0 | 1.072 |
| 5306.0 | 1.072 |
| 5307.0 | 1.072 |
| 5308.0 | 1.072 |
| 5309.0 | 1.072 |
| 5310.0 | 1.072 |
| 5311.0 | 1.072 |
| 5312.0 | 1.072 |
| 5313.0 | 1.072 |
| 5314.0 | 1.072 |
| 5315.0 | 1.072 |
| 5316.0 | 1.072 |
| 5317.0 | 1.072 |
| 5318.0 | 1.072 |
| 5319.0 | 1.072 |
| 5320.0 | 1.072 |
| 5321.0 | 1.072 |
| 5322.0 | 1.072 |
| 5323.0 | 1.072 |
| 5324.0 | 1.072 |
| 5325.0 | 1.072 |
| 5326.0 | 1.072 |
| 5327.0 | 1.072 |
| 5328.0 | 1.072 |
| 5329.0 | 1.072 |
| 5330.0 | 1.072 |
| 5331.0 | 1.072 |
| 5332.0 | 1.072 |
| 5333.0 | 1.072 |
| 5334.0 | 1.072 |
| 5335.0 | 1.072 |
| 5336.0 | 1.072 |
| 5337.0 | 1.072 |
| 5338.0 | 1.072 |
| 5339.0 | 1.072 |
| 5340.0 | 1.072 |
| 5341.0 | 1.072 |
| 5342.0 | 1.072 |
| 5343.0 | 1.072 |
| 5344.0 | 1.072 |
| 5345.0 | 1.072 |
| 5346.0 | 1.072 |
| 5347.0 | 1.072 |
| 5348.0 | 1.072 |
| 5349.0 | 1.072 |
| 5350.0 | 1.072 |
| 5351.0 | 1.072 |
| 5352.0 | 1.072 |
| 5353.0 | 1.072 |
| 5354.0 | 1.072 |
| 5355.0 | 1.072 |
| 5356.0 | 1.072 |
| 5357.0 | 1.072 |
| 5358.0 | 1.072 |
| 5359.0 | 1.072 |
| 5360.0 | 1.072 |
| 5361.0 | 1.072 |
| 5362.0 | 1.072 |
| 5363.0 | 1.072 |
| 5364.0 | 1.072 |
| 5365.0 | 1.072 |
| 5366.0 | 1.072 |
| 5367.0 | 1.072 |
| 5368.0 | 1.072 |
| 5369.0 | 1.072 |
| 5370.0 | 1.072 |
| 5371.0 | 1.072 |
| 5372.0 | 1.072 |
| 5373.0 | 1.072 |
| 5374.0 | 1.072 |
| 5375.0 | 1.072 |
| 5376.0 | 1.072 |
| 5377.0 | 1.072 |
| 5378.0 | 1.072 |
| 5379.0 | 1.072 |
| 5380.0 | 1.072 |
| 5381.0 | 1.072 |
| 5382.0 | 1.072 |
| 5383.0 | 1.072 |
| 5384.0 | 1.072 |
| 5385.0 | 1.072 |
| 5386.0 | 1.072 |
| 5387.0 | 1.072 |
| 5388.0 | 1.072 |
| 5389.0 | 1.072 |
| 5390.0 | 1.072 |
| 5391.0 | 1.072 |
| 5392.0 | 1.072 |
| 5393.0 | 1.072 |
| 5394.0 | 1.072 |
| 5395.0 | 1.072 |
| 5396.0 | 1.072 |
| 5397.0 | 1.072 |
| 5398.0 | 1.072 |
| 5399.0 | 1.072 |
| 5400.0 | 1.072 |
| 5401.0 | 1.072 |
| 5402.0 | 1.072 |
| 5403.0 | 1.072 |
| 5404.0 | 1.072 |
| 5405.0 | 1.072 |
| 5406.0 | 1.072 |
| 5407.0 | 1.072 |
| 5408.0 | 1.072 |
| 5409.0 | 1.072 |
| 5410.0 | 1.072 |
| 5411.0 | 1.072 |
| 5412.0 | 1.072 |
| 5413.0 | 1.072 |
| 5414.0 | 1.072 |
| 5415.0 | 1.072 |
| 5416.0 | 1.072 |
| 5417.0 | 1.072 |
| 5418.0 | 1.072 |
| 5419.0 | 1.072 |
| 5420.0 | 1.072 |
| 5421.0 | 1.072 |
| 5422.0 | 1.072 |
| 5423.0 | 1.072 |
| 5424.0 | 1.072 |
| 5425.0 | 1.072 |
| 5426.0 | 1.072 |
| 5427.0 | 1.072 |
| 5428.0 | 1.072 |
| 5429.0 | 1.072 |
| 5430.0 | 1.072 |
| 5431.0 | 1.072 |
| 5432.0 | 1.072 |
| 5433.0 | 1.072 |
| 5434.0 | 1.072 |
| 5435.0 | 1.072 |
| 5436.0 | 1.072 |
| 5437.0 | 1.072 |
| 5438.0 | 1.072 |
| 5439.0 | 1.072 |
| 5440.0 | 1.072 |
| 5441.0 | 1.072 |
| 5442.0 | 1.072 |
| 5443.0 | 1.072 |
| 5444.0 | 1.072 |
| 5445.0 | 1.072 |
| 5446.0 | 1.072 |
| 5447.0 | 1.072 |
| 5448.0 | 1.072 |
| 5449.0 | 1.072 |
| 5450.0 | 1.072 |
| 5451.0 | 1.072 |
| 5452.0 | 1.072 |
| 5453.0 | 1.072 |
| 5454.0 | 1.072 |
| 5455.0 | 1.072 |
| 5456.0 | 1.072 |
| 5457.0 | 1.072 |
| 5458.0 | 1.072 |
| 5459.0 | 1.072 |
| 5460.0 | 1.072 |
| 5461.0 | 1.072 |
| 5462.0 | 1.072 |
| 5463.0 | 1.072 |
| 5464.0 | 1.072 |
| 5465.0 | 1.072 |
| 5466.0 | 1.072 |
| 5467.0 | 1.072 |
| 5468.0 | 1.072 |
| 5469.0 | 1.072 |
| 5470.0 | 1.072 |
| 5471.0 | 1.072 |
| 5472.0 | 1.072 |
| 5473.0 | 1.072 |
| 5474.0 | 1.072 |
| 5475.0 | 1.072 |
| 5476.0 | 1.072 |
| 5477.0 | 1.072 |
| 5478.0 | 1.072 |
| 5479.0 | 1.072 |
| 5480.0 | 1.072 |
| 5481.0 | 1.072 |
| 5482.0 | 1.072 |
| 5483.0 | 1.072 |
| 5484.0 | 1.072 |
| 5485.0 | 1.072 |
| 5486.0 | 1.072 |
| 5487.0 | 1.072 |
| 5488.0 | 1.072 |
| 5489.0 | 1.072 |
| 5490.0 | 1.072 |
| 5491.0 | 1.072 |
| 5492.0 | 1.072 |
| 5493.0 | 1.072 |
| 5494.0 | 1.072 |
| 5495.0 | 1.072 |
| 5496.0 | 1.072 |
| 5497.0 | 1.072 |
| 5498.0 | 1.072 |
| 5499.0 | 1.072 |
| 5500.0 | 1.072 |
| 5501.0 | 1.072 |
| 5502.0 | 1.072 |
| 5503.0 | 1.072 |
| 5504.0 | 1.072 |
| 5505.0 | 1.072 |
| 5506.0 | 1.072 |
| 5507.0 | 1.072 |
| 5508.0 | 1.072 |
| 5509.0 | 1.072 |
| 5510.0 | 1.072 |
| 5511.0 | 1.072 |
| 5512.0 | 1.072 |
| 5513.0 | 1.072 |
| 5514.0 | 1.072 |
| 5515.0 | 1.072 |
| 5516.0 | 1.072 |
| 5517.0 | 1.072 |
| 5518.0 | 1.072 |
| 5519.0 | 1.072 |
| 5520.0 | 1.072 |
| 5521.0 | 1.072 |
| 5522.0 | 1.072 |
| 5523.0 | 1.072 |
| 5524.0 | 1.072 |
| 5525.0 | 1.072 |
| 5526.0 | 1.072 |
| 5527.0 | 1.072 |
| 5528.0 | 1.072 |
| 5529.0 | 1.072 |
| 5530.0 | 1.072 |
| 5531.0 | 1.072 |
| 5532.0 | 1.072 |
| 5533.0 | 1.072 |
| 5534.0 | 1.072 |
| 5535.0 | 1.072 |
| 5536.0 | 1.072 |
| 5537.0 | 1.072 |
| 5538.0 | 1.072 |
| 5539.0 | 1.072 |
| 5540.0 | 1.072 |
| 5541.0 | 1.072 |
| 5542.0 | 1.072 |
| 5543.0 | 1.072 |
| 5544.0 | 1.072 |
| 5545.0 | 1.072 |
| 5546.0 | 1.072 |
| 5547.0 | 1.072 |
| 5548.0 | 1.072 |
| 5549.0 | 1.072 |
| 5550.0 | 1.072 |
| 5551.0 | 1.072 |
| 5552.0 | 1.072 |
| 5553.0 | 1.072 |
| 5554.0 | 1.072 |
| 5555.0 | 1.072 |
| 5556.0 | 1.072 |
| 5557.0 | 1.072 |
| 5558.0 | 1.072 |
| 5559.0 | 1.072 |
| 5560.0 | 1.072 |
| 5561.0 | 1.072 |
| 5562.0 | 1.072 |
| 5563.0 | 1.072 |
| 5564.0 | 1.072 |
| 5565.0 | 1.072 |
| 5566.0 | 1.072 |
| 5567.0 | 1.072 |
| 5568.0 | 1.072 |
| 5569.0 | 1.072 |
| 5570.0 | 1.072 |
| 5571.0 | 1.072 |
| 5572.0 | 1.072 |
| 5573.0 | 1.072 |
| 5574.0 | 1.072 |
| 5575.0 | 1.072 |
| 5576.0 | 1.072 |
| 5577.0 | 1.072 |
| 5578.0 | 1.072 |
| 5579.0 | 1.072 |
| 5580.0 | 1.072 |
| 5581.0 | 1.072 |
| 5582.0 | 1.072 |
| 5583.0 | 1.072 |
| 5584.0 | 1.072 |
| 5585.0 | 1.072 |
| 5586.0 | 1.072 |
| 5587.0 | 1.072 |
| 5588.0 | 1.072 |
| 5589.0 | 1.072 |
| 5590.0 | 1.072 |
| 5591.0 | 1.072 |
| 5592.0 | 1.072 |
| 5593.0 | 1.072 |
| 5594.0 | 1.072 |
| 5595.0 | 1.072 |
| 5596.0 | 1.072 |
| 5597.0 | 1.072 |
| 5598.0 | 1.072 |
| 5599.0 | 1.072 |
| 5600.0 | 1.072 |
| 5601.0 | 1.072 |
| 5602.0 | 1.072 |
| 5603.0 | 1.072 |
| 5604.0 | 1.072 |
| 5605.0 | 1.072 |
| 5606.0 | 1.072 |
| 5607.0 | 1.072 |
| 5608.0 | 1.072 |
| 5609.0 | 1.072 |
| 5610.0 | 1.072 |
| 5611.0 | 1.072 |
| 5612.0 | 1.072 |
| 5613.0 | 1.072 |
| 5614.0 | 1.072 |
| 5615.0 | 1.072 |
| 5616.0 | 1.072 |
| 5617.0 | 1.072 |
| 5618.0 | 1.072 |
| 5619.0 | 1.072 |
| 5620.0 | 1.072 |
| 5621.0 | 1.072 |
| 5622.0 | 1.072 |
| 5623.0 | 1.072 |
| 5624.0 | 1.072 |
| 5625.0 | 1.072 |
| 5626.0 | 1.072 |
| 5627.0 | 1.072 |
| 5628.0 | 1.072 |
| 5629.0 | 1.072 |
| 5630.0 | 1.072 |
| 5631.0 | 1.072 |
| 5632.0 | 1.072 |
| 5633.0 | 1.072 |
| 5634.0 | 1.072 |
| 5635.0 | 1.072 |
| 5636.0 | 1.072 |
| 5637.0 | 1.072 |
| 5638.0 | 1.072 |
| 5639.0 | 1.072 |
| 5640.0 | 1.072 |
| 5641.0 | 1.072 |
| 5642.0 | 1.072 |
| 5643.0 | 1.072 |
| 5644.0 | 1.072 |
| 5645.0 | 1.072 |
| 5646.0 | 1.072 |
| 5647.0 | 1.072 |
| 5648.0 | 1.072 |
| 5649.0 | 1.072 |
| 5650.0 | 1.072 |
| 5651.0 | 1.072 |
| 5652.0 | 1.072 |
| 5653.0 | 1.072 |
| 5654.0 | 1.072 |
| 5655.0 | 1.072 |
| 5656.0 | 1.072 |
| 5657.0 | 1.072 |
| 5658.0 | 1.072 |
| 5659.0 | 1.072 |
| 5660.0 | 1.072 |
| 5661.0 | 1.072 |
| 5662.0 | 1.072 |
| 5663.0 | 1.072 |
| 5664.0 | 1.072 |
| 5665.0 | 1.072 |
| 5666.0 | 1.072 |
| 5667.0 | 1.072 |
| 5668.0 | 1.072 |
| 5669.0 | 1.072 |
| 5670.0 | 1.072 |
| 5671.0 | 1.072 |
| 5672.0 | 1.072 |
| 5673.0 | 1.072 |
| 5674.0 | 1.072 |
| 5675.0 | 1.072 |
| 5676.0 | 1.072 |
| 5677.0 | 1.072 |
| 5678.0 | 1.072 |
| 5679.0 | 1.072 |
| 5680.0 | 1.072 |
| 5681.0 | 1.072 |
| 5682.0 | 1.072 |
| 5683.0 | 1.072 |
| 5684.0 | 1.072 |
| 5685.0 | 1.072 |
| 5686.0 | 1.072 |
| 5687.0 | 1.072 |
| 5688.0 | 1.072 |
| 5689.0 | 1.072 |
| 5690.0 | 1.072 |
| 5691.0 | 1.072 |
| 5692.0 | 1.072 |
| 5693.0 | 1.072 |
| 5694.0 | 1.072 |
| 5695.0 | 1.072 |
| 5696.0 | 1.072 |
| 5697.0 | 1.072 |
| 5698.0 | 1.072 |
| 5699.0 | 1.072 |
| 5700.0 | 1.072 |
| 5701.0 | 1.072 |
| 5702.0 | 1.072 |
| 5703.0 | 1.072 |
| 5704.0 | 1.072 |
| 5705.0 | 1.072 |
| 5706.0 | 1.072 |
| 5707.0 | 1.072 |
| 5708.0 | 1.072 |
| 5709.0 | 1.072 |
| 5710.0 | 1.072 |
| 5711.0 | 1.072 |
| 5712.0 | 1.072 |
| 5713.0 | 1.072 |
| 5714.0 | 1.072 |
| 5715.0 | 1.072 |
| 5716.0 | 1.072 |
| 5717.0 | 1.072 |
| 5718.0 | 1.072 |
| 5719.0 | 1.072 |
| 5720.0 | 1.072 |
| 5721.0 | 1.072 |
| 5722.0 | 1.072 |
| 5723.0 | 1.072 |
| 5724.0 | 1.072 |
| 5725.0 | 1.072 |
| 5726.0 | 1.072 |
| 5727.0 | 1.072 |
| 5728.0 | 1.072 |
| 5729.0 | 1.072 |
| 5730.0 | 1.072 |
| 5731.0 | 1.072 |
| 5732.0 | 1.072 |
| 5733.0 | 1.072 |
| 5734.0 | 1.072 |
| 5735.0 | 1.072 |
| 5736.0 | 1.072 |
| 5737.0 | 1.072 |
| 5738.0 | 1.072 |
| 5739.0 | 1.072 |
| 5740.0 | 1.072 |
| 5741.0 | 1.072 |
| 5742.0 | 1.072 |
| 5743.0 | 1.072 |
| 5744.0 | 1.072 |
| 5745.0 | 1.072 |
| 5746.0 | 1.072 |
| 5747.0 | 1.072 |
| 5748.0 | 1.072 |
| 5749.0 | 1.072 |
| 5750.0 | 1.072 |
| 5751.0 | 1.072 |
| 5752.0 | 1.072 |
| 5753.0 | 1.072 |
| 5754.0 | 1.072 |
| 5755.0 | 1.072 |
| 5756.0 | 1.072 |
| 5757.0 | 1.072 |
| 5758.0 | 1.072 |
| 5759.0 | 1.072 |
| 5760.0 | 1.072 |
| 5761.0 | 1.072 |
| 5762.0 | 1.072 |
| 5763.0 | 1.072 |
| 5764.0 | 1.072 |
| 5765.0 | 1.072 |
| 5766.0 | 1.072 |
| 5767.0 | 1.072 |
| 5768.0 | 1.072 |
| 5769.0 | 1.072 |
| 5770.0 | 1.072 |
| 5771.0 | 1.072 |
| 5772.0 | 1.072 |
| 5773.0 | 1.072 |
| 5774.0 | 1.072 |
| 5775.0 | 1.072 |
| 5776.0 | 1.072 |
| 5777.0 | 1.072 |
| 5778.0 | 1.072 |
| 5779.0 | 1.072 |
| 5780.0 | 1.072 |
| 5781.0 | 1.072 |
| 5782.0 | 1.072 |
| 5783.0 | 1.072 |
| 5784.0 | 1.072 |
| 5785.0 | 1.072 |
| 5786.0 | 1.072 |
| 5787.0 | 1.072 |
| 5788.0 | 1.072 |
| 5789.0 | 1.072 |
| 5790.0 | 1.072 |
| 5791.0 | 1.072 |
| 5792.0 | 1.072 |
| 5793.0 | 1.072 |
| 5794.0 | 1.072 |
| 5795.0 | 1.072 |
| 5796.0 | 1.072 |
| 5797.0 | 1.072 |
| 5798.0 | 1.072 |
| 5799.0 | 1.072 |
| 5800.0 | 1.072 |
| 5801.0 | 1.072 |
| 5802.0 | 1.072 |
| 5803.0 | 1.072 |
| 5804.0 | 1.072 |
| 5805.0 | 1.072 |
| 5806.0 | 1.072 |
| 5807.0 | 1.072 |
| 5808.0 | 1.072 |
| 5809.0 | 1.072 |
| 5810.0 | 1.072 |
| 5811.0 | 1.072 |
| 5812.0 | 1.072 |
| 5813.0 | 1.072 |
| 5814.0 | 1.072 |
| 5815.0 | 1.072 |
| 5816.0 | 1.072 |
| 5817.0 | 1.072 |
| 5818.0 | 1.072 |
| 5819.0 | 1.072 |
| 5820.0 | 1.072 |
| 5821.0 | 1.072 |
| 5822.0 | 1.072 |
| 5823.0 | 1.072 |
| 5824.0 | 1.072 |
| 5825.0 | 1.072 |
| 5826.0 | 1.072 |
| 5827.0 | 1.072 |
| 5828.0 | 1.072 |
| 5829.0 | 1.072 |
| 5830.0 | 1.072 |
| 5831.0 | 1.072 |
| 5832.0 | 1.072 |
| 5833.0 | 1.072 |
| 5834.0 | 1.072 |
| 5835.0 | 1.072 |
| 5836.0 | 1.072 |
| 5837.0 | 1.072 |
| 5838.0 | 1.072 |
| 5839.0 | 1.072 |
| 5840.0 | 1.072 |
| 5841.0 | 1.072 |
| 5842.0 | 1.072 |
| 5843.0 | 1.072 |
| 5844.0 | 1.072 |
| 5845.0 | 1.072 |
| 5846.0 | 1.072 |
| 5847.0 | 1.072 |
| 5848.0 | 1.072 |
| 5849.0 | 1.072 |
| 5850.0 | 1.072 |
| 5851.0 | 1.072 |
| 5852.0 | 1.072 |
| 5853.0 | 1.072 |
| 5854.0 | 1.072 |
| 5855.0 | 1.072 |
| 5856.0 | 1.072 |
| 5857.0 | 1.072 |
| 5858.0 | 1.072 |
| 5859.0 | 1.072 |
| 5860.0 | 1.072 |
| 5861.0 | 1.072 |
| 5862.0 | 1.072 |
| 5863.0 | 1.072 |
| 5864.0 | 1.072 |
| 5865.0 | 1.072 |
| 5866.0 | 1.072 |
| 5867.0 | 1.072 |
| 5868.0 | 1.072 |
| 5869.0 | 1.072 |
| 5870.0 | 1.072 |
| 5871.0 | 1.072 |
| 5872.0 | 1.072 |
| 5873.0 | 1.072 |
| 5874.0 | 1.072 |
| 5875.0 | 1.072 |
| 5876.0 | 1.072 |
| 5877.0 | 1.072 |
| 5878.0 | 1.072 |
| 5879.0 | 1.072 |
| 5880.0 | 1.072 |
| 5881.0 | 1.072 |
| 5882.0 | 1.072 |
| 5883.0 | 1.072 |
| 5884.0 | 1.072 |
| 5885.0 | 1.072 |
| 5886.0 | 1.072 |
| 5887.0 | 1.072 |
| 5888.0 | 1.072 |
| 5889.0 | 1.072 |
| 5890.0 | 1.072 |
| 5891.0 | 1.072 |
| 5892.0 | 1.072 |
| 5893.0 | 1.072 |
| 5894.0 | 1.072 |
| 5895.0 | 1.072 |
| 5896.0 | 1.072 |
| 5897.0 | 1.072 |
| 5898.0 | 1.072 |
| 5899.0 | 1.072 |
| 5900.0 | 1.072 |
| 5901.0 | 1.072 |
| 5902.0 | 1.072 |
| 5903.0 | 1.072 |
| 5904.0 | 1.072 |
| 5905.0 | 1.072 |
| 5906.0 | 1.072 |
| 5907.0 | 1.072 |
| 5908.0 | 1.072 |
| 5909.0 | 1.072 |
| 5910.0 | 1.072 |
| 5911.0 | 1.072 |
| 5912.0 | 1.072 |
| 5913.0 | 1.072 |
| 5914.0 | 1.072 |
| 5915.0 | 1.072 |
| 5916.0 | 1.072 |
| 5917.0 | 1.072 |
| 5918.0 | 1.072 |
| 5919.0 | 1.072 |
| 5920.0 | 1.072 |
| 5921.0 | 1.072 |
| 5922.0 | 1.072 |
| 5923.0 | 1.072 |
| 5924.0 | 1.072 |
| 5925.0 | 1.072 |
| 5926.0 | 1.072 |
| 5927.0 | 1.072 |
| 5928.0 | 1.072 |
| 5929.0 | 1.072 |
| 5930.0 | 1.072 |
| 5931.0 | 1.072 |
| 5932.0 | 1.072 |
| 5933.0 | 1.072 |
| 5934.0 | 1.072 |
| 5935.0 | 1.072 |
| 5936.0 | 1.072 |
| 5937.0 | 1.072 |
| 5938.0 | 1.072 |
| 5939.0 | 1.072 |
| 5940.0 | 1.072 |
| 5941.0 | 1.072 |
| 5942.0 | 1.072 |
| 5943.0 | 1.072 |
| 5944.0 | 1.072 |
| 5945.0 | 1.072 |
| 5946.0 | 1.072 |
| 5947.0 | 1.072 |
| 5948.0 | 1.072 |
| 5949.0 | 1.072 |
| 5950.0 | 1.072 |
| 5951.0 | 1.072 |
| 5952.0 | 1.072 |
| 5953.0 | 1.072 |
| 5954.0 | 1.072 |
| 5955.0 | 1.072 |
| 5956.0 | 1.072 |
| 5957.0 | 1.072 |
| 5958.0 | 1.072 |
| 5959.0 | 1.072 |
| 5960.0 | 1.072 |
| 5961.0 | 1.072 |
| 5962.0 | 1.072 |
| 5963.0 | 1.072 |
| 5964.0 | 1.072 |
| 5965.0 | 1.072 |
| 5966.0 | 1.072 |
| 5967.0 | 1.072 |
| 5968.0 | 1.072 |
| 5969.0 | 1.072 |
| 5970.0 | 1.072 |
| 5971.0 | 1.072 |
| 5972.0 | 1.072 |
| 5973.0 | 1.072 |
| 5974.0 | 1.072 |
| 5975.0 | 1.072 |
| 5976.0 | 1.072 |
| 5977.0 | 1.072 |
| 5978.0 | 1.072 |
| 5979.0 | 1.072 |
| 5980.0 | 1.072 |
| 5981.0 | 1.072 |
| 5982.0 | 1.072 |
| 5983.0 | 1.072 |
| 5984.0 | 1.072 |
| 5985.0 | 1.072 |
| 5986.0 | 1.072 |
| 5987.0 | 1.072 |
| 5988.0 | 1.072 |
| 5989.0 | 1.072 |
| 5990.0 | 1.072 |
| 5991.0 | 1.072 |
| 5992.0 | 1.072 |
| 5993.0 | 1.072 |
| 5994.0 | 1.072 |
| 5995.0 | 1.072 |
| 5996.0 | 1.072 |
| 5997.0 | 1.072 |
| 5998.0 | 1.072 |
| 5999.0 | 1.072 |
| 6000.0 | 1.072 |
| 6001.0 | 1.072 |
| 6002.0 | 1.072 |
| 6003.0 | 1.072 |
| 6004.0 | 1.072 |
| 6005.0 | 1.072 |
| 6006.0 | 1.072 |
| 6007.0 | 1.072 |
| 6008.0 | 1.072 |
| 6009.0 | 1.072 |
| 6010.0 | 1.072 |
| 6011.0 | 1.072 |
| 6012.0 | 1.072 |
| 6013.0 | 1.072 |
| 6014.0 | 1.072 |
| 6015.0 | 1.072 |
| 6016.0 | 1.072 |
| 6017.0 | 1.072 |
| 6018.0 | 1.072 |
| 6019.0 | 1.072 |
| 6020.0 | 1.072 |
| 6021.0 | 1.072 |
| 6022.0 | 1.072 |
| 6023.0 | 1.072 |
| 6024.0 | 1.072 |
| 6025.0 | 1.072 |
| 6026.0 | 1.072 |
| 6027.0 | 1.072 |
| 6028.0 | 1.072 |
| 6029.0 | 1.072 |
| 6030.0 | 1.072 |
| 6031.0 | 1.072 |
| 6032.0 | 1.072 |
| 6033.0 | 1.072 |
| 6034.0 | 1.072 |
| 6035.0 | 1.072 |
| 6036.0 | 1.072 |
| 6037.0 | 1.072 |
| 6038.0 | 1.072 |
| 6039.0 | 1.072 |
| 6040.0 | 1.072 |
| 6041.0 | 1.072 |
| 6042.0 | 1.072 |
| 6043.0 | 1.072 |
| 6044.0 | 1.072 |
| 6045.0 | 1.072 |
| 6046.0 | 1.072 |
| 6047.0 | 1.072 |
| 6048.0 | 1.072 |
| 6049.0 | 1.072 |
| 6050.0 | 1.072 |
| 6051.0 | 1.072 |
| 6052.0 | 1.072 |
| 6053.0 | 1.072 |
| 6054.0 | 1.072 |
| 6055.0 | 1.072 |
| 6056.0 | 1.072 |
| 6057.0 | 1.072 |
| 6058.0 | 1.072 |
| 6059.0 | 1.072 |
| 6060.0 | 1.072 |
| 6061.0 | 1.072 |
| 6062.0 | 1.072 |
| 6063.0 | 1.072 |
| 6064.0 | 1.072 |
| 6065.0 | 1.072 |
| 6066.0 | 1.072 |
| 6067.0 | 1.072 |
| 6068.0 | 1.072 |
| 6069.0 | 1.072 |
| 6070.0 | 1.072 |
| 6071.0 | 1.072 |
| 6072.0 | 1.072 |
| 6073.0 | 1.072 |
| 6074.0 | 1.072 |
| 6075.0 | 1.072 |
| 6076.0 | 1.072 |
| 6077.0 | 1.072 |
| 6078.0 | 1.072 |
| 6079.0 | 1.072 |
| 6080.0 | 1.072 |
| 6081.0 | 1.072 |
| 6082.0 | 1.072 |
| 6083.0 | 1.072 |
| 6084.0 | 1.072 |
| 6085.0 | 1.072 |
| 6086.0 | 1.072 |
| 6087.0 | 1.072 |
| 6088.0 | 1.072 |
| 6089.0 | 1.072 |
| 6090.0 | 1.072 |
| 6091.0 | 1.072 |
| 6092.0 | 1.072 |
| 6093.0 | 1.072 |
| 6094.0 | 1.072 |
| 6095.0 | 1.072 |
| 6096.0 | 1.072 |
| 6097.0 | 1.072 |
| 6098.0 | 1.072 |
| 6099.0 | 1.072 |
| 6100.0 | 1.072 |
| 6101.0 | 1.072 |
| 6102.0 | 1.072 |
| 6103.0 | 1.072 |
| 6104.0 | 1.072 |
| 6105.0 | 1.072 |
| 6106.0 | 1.072 |
| 6107.0 | 1.072 |
| 6108.0 | 1.072 |
| 6109.0 | 1.072 |
| 6110.0 | 1.072 |
| 6111.0 | 1.072 |
| 6112.0 | 1.072 |
| 6113.0 | 1.072 |
| 6114.0 | 1.072 |
| 6115.0 | 1.072 |
| 6116.0 | 1.072 |
| 6117.0 | 1.072 |
| 6118.0 | 1.072 |
| 6119.0 | 1.072 |
| 6120.0 | 1.072 |
| 6121.0 | 1.072 |
| 6122.0 | 1.072 |
| 6123.0 | 1.072 |
| 6124.0 | 1.072 |
| 6125.0 | 1.072 |
| 6126.0 | 1.072 |
| 6127.0 | 1.072 |
| 6128.0 | 1.072 |
| 6129.0 | 1.072 |
| 6130.0 | 1.072 |
| 6131.0 | 1.072 |
| 6132.0 | 1.072 |
| 6133.0 | 1.072 |
| 6134.0 | 1.072 |
| 6135.0 | 1.072 |
| 6136.0 | 1.072 |
| 6137.0 | 1.072 |
| 6138.0 | 1.072 |
| 6139.0 | 1.072 |
| 6140.0 | 1.072 |
| 6141.0 | 1.072 |
| 6142.0 | 1.072 |
| 6143.0 | 1.072 |
| 6144.0 | 1.072 |
| 6145.0 | 1.072 |
| 6146.0 | 1.072 |
| 6147.0 | 1.072 |
| 6148.0 | 1.072 |
| 6149.0 | 1.072 |
| 6150.0 | 1.072 |
| 6151.0 | 1.072 |
| 6152.0 | 1.072 |
| 6153.0 | 1.072 |
| 6154.0 | 1.072 |
| 6155.0 | 1.072 |
| 6156.0 | 1.072 |
| 6157.0 | 1.072 |
| 6158.0 | 1.072 |
| 6159.0 | 1.072 |
| 6160.0 | 1.072 |
| 6161.0 | 1.072 |
| 6162.0 | 1.072 |
| 6163.0 | 1.072 |
| 6164.0 | 1.072 |
| 6165.0 | 1.072 |
| 6166.0 | 1.072 |
| 6167.0 | 1.072 |
| 6168.0 | 1.072 |
| 6169.0 | 1.072 |
| 6170.0 | 1.072 |
| 6171.0 | 1.072 |
| 6172.0 | 1.072 |
| 6173.0 | 1.072 |
| 6174.0 | 1.072 |
| 6175.0 | 1.072 |
| 6176.0 | 1.072 |
| 6177.0 | 1.072 |
| 6178.0 | 1.072 |
| 6179.0 | 1.072 |
| 6180.0 | 1.072 |
| 6181.0 | 1.072 |
| 6182.0 | 1.072 |
| 6183.0 | 1.072 |
| 6184.0 | 1.072 |
| 6185.0 | 1.072 |
| 6186.0 | 1.072 |
| 6187.0 | 1.072 |
| 6188.0 | 1.072 |
| 6189.0 | 1.072 |
| 6190.0 | 1.072 |
| 6191.0 | 1.072 |
| 6192.0 | 1.072 |
| 6193.0 | 1.072 |
| 6194.0 | 1.072 |
| 6195.0 | 1.072 |
| 6196.0 | 1.072 |
| 6197.0 | 1.072 |
| 6198.0 | 1.072 |
| 6199.0 | 1.072 |
| 6200.0 | 1.072 |
| 6201.0 | 1.072 |
| 6202.0 | 1.072 |
| 6203.0 | 1.072 |
| 6204.0 | 1.072 |
| 6205.0 | 1.072 |
| 6206.0 | 1.072 |
| 6207.0 | 1.072 |
| 6208.0 | 1.072 |
| 6209.0 | 1.072 |
| 6210.0 | 1.072 |
| 6211.0 | 1.072 |
| 6212.0 | 1.072 |
| 6213.0 | 1.072 |
| 6214.0 | 1.072 |
| 6215.0 | 1.072 |
| 6216.0 | 1.072 |
| 6217.0 | 1.072 |
| 6218.0 | 1.072 |
| 6219.0 | 1.072 |
| 6220.0 | 1.072 |
| 6221.0 | 1.072 |
| 6222.0 | 1.072 |
| 6223.0 | 1.072 |
| 6224.0 | 1.072 |
| 6225.0 | 1.072 |
| 6226.0 | 1.072 |
| 6227.0 | 1.072 |
| 6228.0 | 1.072 |
| 6229.0 | 1.072 |
| 6230.0 | 1.072 |
| 6231.0 | 1.072 |
| 6232.0 | 1.072 |
| 6233.0 | 1.072 |
| 6234.0 | 1.072 |
| 6235.0 | 1.072 |
| 6236.0 | 1.072 |
| 6237.0 | 1.072 |
| 6238.0 | 1.072 |
| 6239.0 | 1.072 |
| 6240.0 | 1.072 |
| 6241.0 | 1.072 |
| 6242.0 | 1.072 |
| 6243.0 | 1.072 |
| 6244.0 | 1.072 |
| 6245.0 | 1.072 |
| 6246.0 | 1.072 |
| 6247.0 | 1.072 |
| 6248.0 | 1.072 |
| 6249.0 | 1.072 |
| 6250.0 | 1.072 |
| 6251.0 | 1.072 |
| 6252.0 | 1.072 |
| 6253.0 | 1.072 |
| 6254.0 | 1.072 |
| 6255.0 | 1.072 |
| 6256.0 | 1.072 |
| 6257.0 | 1.072 |
| 6258.0 | 1.072 |
| 6259.0 | 1.072 |
| 6260.0 | 1.072 |
| 6261.0 | 1.072 |
| 6262.0 | 1.072 |
| 6263.0 | 1.072 |
| 6264.0 | 1.072 |
| 6265.0 | 1.072 |
| 6266.0 | 1.072 |
| 6267.0 | 1.072 |
| 6268.0 | 1.072 |
| 6269.0 | 1.072 |
| 6270.0 | 1.072 |
| 6271.0 | 1.072 |
| 6272.0 | 1.072 |
| 6273.0 | 1.072 |
| 6274.0 | 1.072 |
| 6275.0 | 1.072 |
| 6276.0 | 1.072 |
| 6277.0 | 1.072 |
| 6278.0 | 1.072 |
| 6279.0 | 1.072 |
| 6280.0 | 1.072 |
| 6281.0 | 1.073 |
| 6282.0 | 1.073 |
| 6283.0 | 1.073 |
| 6284.0 | 1.073 |
| 6285.0 | 1.073 |
| 6286.0 | 1.073 |
| 6287.0 | 1.073 |
| 6288.0 | 1.073 |
| 6289.0 | 1.073 |
| 6290.0 | 1.073 |
| 6291.0 | 1.073 |
| 6292.0 | 1.073 |
| 6293.0 | 1.073 |
| 6294.0 | 1.073 |
| 6295.0 | 1.073 |
| 6296.0 | 1.073 |
| 6297.0 | 1.073 |
| 6298.0 | 1.073 |
| 6299.0 | 1.073 |
| 6300.0 | 1.073 |
| 6301.0 | 1.073 |
| 6302.0 | 1.073 |
| 6303.0 | 1.073 |
| 6304.0 | 1.073 |
| 6305.0 | 1.073 |
| 6306.0 | 1.073 |
| 6307.0 | 1.073 |
| 6308.0 | 1.073 |
| 6309.0 | 1.073 |
| 6310.0 | 1.073 |
| 6311.0 | 1.073 |
| 6312.0 | 1.073 |
| 6313.0 | 1.073 |
| 6314.0 | 1.073 |
| 6315.0 | 1.073 |
| 6316.0 | 1.073 |
| 6317.0 | 1.073 |
| 6318.0 | 1.073 |
| 6319.0 | 1.073 |
| 6320.0 | 1.073 |
| 6321.0 | 1.073 |
| 6322.0 | 1.073 |
| 6323.0 | 1.073 |
| 6324.0 | 1.073 |
| 6325.0 | 1.073 |
| 6326.0 | 1.073 |
| 6327.0 | 1.073 |
| 6328.0 | 1.073 |
| 6329.0 | 1.073 |
| 6330.0 | 1.073 |
| 6331.0 | 1.073 |
| 6332.0 | 1.073 |
| 6333.0 | 1.073 |
| 6334.0 | 1.073 |
| 6335.0 | 1.073 |
| 6336.0 | 1.073 |
| 6337.0 | 1.073 |
| 6338.0 | 1.073 |
| 6339.0 | 1.073 |
| 6340.0 | 1.073 |
| 6341.0 | 1.073 |
| 6342.0 | 1.073 |
| 6343.0 | 1.073 |
| 6344.0 | 1.073 |
| 6345.0 | 1.073 |
| 6346.0 | 1.073 |
| 6347.0 | 1.073 |
| 6348.0 | 1.073 |
| 6349.0 | 1.073 |
| 6350.0 | 1.073 |
| 6351.0 | 1.073 |
| 6352.0 | 1.073 |
| 6353.0 | 1.073 |
| 6354.0 | 1.073 |
| 6355.0 | 1.073 |
| 6356.0 | 1.073 |
| 6357.0 | 1.073 |
| 6358.0 | 1.073 |
| 6359.0 | 1.073 |
| 6360.0 | 1.073 |
| 6361.0 | 1.073 |
| 6362.0 | 1.073 |
| 6363.0 | 1.073 |
| 6364.0 | 1.073 |
| 6365.0 | 1.073 |
| 6366.0 | 1.073 |
| 6367.0 | 1.073 |
| 6368.0 | 1.073 |
| 6369.0 | 1.073 |
| 6370.0 | 1.073 |
| 6371.0 | 1.073 |
| 6372.0 | 1.073 |
| 6373.0 | 1.073 |
| 6374.0 | 1.073 |
| 6375.0 | 1.073 |
| 6376.0 | 1.073 |
| 6377.0 | 1.073 |
| 6378.0 | 1.073 |
| 6379.0 | 1.073 |
| 6380.0 | 1.073 |
| 6381.0 | 1.073 |
| 6382.0 | 1.073 |
| 6383.0 | 1.073 |
| 6384.0 | 1.073 |
| 6385.0 | 1.073 |
| 6386.0 | 1.073 |
| 6387.0 | 1.073 |
| 6388.0 | 1.073 |
| 6389.0 | 1.073 |
| 6390.0 | 1.073 |
| 6391.0 | 1.073 |
| 6392.0 | 1.073 |
| 6393.0 | 1.073 |
| 6394.0 | 1.073 |
| 6395.0 | 1.073 |
| 6396.0 | 1.073 |
| 6397.0 | 1.073 |
| 6398.0 | 1.073 |
| 6399.0 | 1.073 |
| 6400.0 | 1.073 |
| 6401.0 | 1.073 |
| 6402.0 | 1.073 |
| 6403.0 | 1.073 |
| 6404.0 | 1.073 |
| 6405.0 | 1.073 |
| 6406.0 | 1.073 |
| 6407.0 | 1.073 |
| 6408.0 | 1.073 |
| 6409.0 | 1.073 |
| 6410.0 | 1.073 |
| 6411.0 | 1.073 |
| 6412.0 | 1.073 |
| 6413.0 | 1.073 |
| 6414.0 | 1.073 |
| 6415.0 | 1.073 |
| 6416.0 | 1.073 |
| 6417.0 | 1.073 |
| 6418.0 | 1.073 |
| 6419.0 | 1.073 |
| 6420.0 | 1.073 |
| 6421.0 | 1.073 |
| 6422.0 | 1.073 |
| 6423.0 | 1.073 |
| 6424.0 | 1.073 |
| 6425.0 | 1.073 |
| 6426.0 | 1.073 |
| 6427.0 | 1.073 |
| 6428.0 | 1.073 |
| 6429.0 | 1.073 |
| 6430.0 | 1.073 |
| 6431.0 | 1.073 |
| 6432.0 | 1.073 |
| 6433.0 | 1.073 |
| 6434.0 | 1.073 |
| 6435.0 | 1.073 |
| 6436.0 | 1.073 |
| 6437.0 | 1.073 |
| 6438.0 | 1.073 |
| 6439.0 | 1.073 |
| 6440.0 | 1.073 |
| 6441.0 | 1.073 |
| 6442.0 | 1.073 |
| 6443.0 | 1.073 |
| 6444.0 | 1.073 |
| 6445.0 | 1.073 |
| 6446.0 | 1.073 |
| 6447.0 | 1.073 |
| 6448.0 | 1.073 |
| 6449.0 | 1.073 |
| 6450.0 | 1.073 |
| 6451.0 | 1.073 |
| 6452.0 | 1.073 |
| 6453.0 | 1.073 |
| 6454.0 | 1.073 |
| 6455.0 | 1.073 |
| 6456.0 | 1.073 |
| 6457.0 | 1.073 |
| 6458.0 | 1.073 |
| 6459.0 | 1.073 |
| 6460.0 | 1.073 |
| 6461.0 | 1.073 |
| 6462.0 | 1.073 |
| 6463.0 | 1.073 |
| 6464.0 | 1.073 |
| 6465.0 | 1.073 |
| 6466.0 | 1.073 |
| 6467.0 | 1.073 |
| 6468.0 | 1.073 |
| 6469.0 | 1.073 |
| 6470.0 | 1.073 |
| 6471.0 | 1.073 |
| 6472.0 | 1.073 |
| 6473.0 | 1.073 |
| 6474.0 | 1.073 |
| 6475.0 | 1.073 |
| 6476.0 | 1.073 |
| 6477.0 | 1.073 |
| 6478.0 | 1.073 |
| 6479.0 | 1.073 |
| 6480.0 | 1.073 |
| 6481.0 | 1.073 |
| 6482.0 | 1.073 |
| 6483.0 | 1.073 |
| 6484.0 | 1.073 |
| 6485.0 | 1.073 |
| 6486.0 | 1.073 |
| 6487.0 | 1.073 |
| 6488.0 | 1.073 |
| 6489.0 | 1.073 |
| 6490.0 | 1.073 |
| 6491.0 | 1.073 |
| 6492.0 | 1.073 |
| 6493.0 | 1.073 |
| 6494.0 | 1.073 |
| 6495.0 | 1.073 |
| 6496.0 | 1.073 |
| 6497.0 | 1.073 |
| 6498.0 | 1.073 |
| 6499.0 | 1.073 |
| 6500.0 | 1.073 |
| 6501.0 | 1.073 |
| 6502.0 | 1.073 |
| 6503.0 | 1.073 |
| 6504.0 | 1.073 |
| 6505.0 | 1.073 |
| 6506.0 | 1.073 |
| 6507.0 | 1.073 |
| 6508.0 | 1.073 |
| 6509.0 | 1.073 |
| 6510.0 | 1.073 |
| 6511.0 | 1.073 |
| 6512.0 | 1.073 |
| 6513.0 | 1.073 |
| 6514.0 | 1.073 |
| 6515.0 | 1.073 |
| 6516.0 | 1.073 |
| 6517.0 | 1.073 |
| 6518.0 | 1.073 |
| 6519.0 | 1.073 |
| 6520.0 | 1.073 |
| 6521.0 | 1.073 |
| 6522.0 | 1.073 |
| 6523.0 | 1.073 |
| 6524.0 | 1.073 |
| 6525.0 | 1.073 |
| 6526.0 | 1.073 |
| 6527.0 | 1.073 |
| 6528.0 | 1.073 |
| 6529.0 | 1.073 |
| 6530.0 | 1.073 |
| 6531.0 | 1.073 |
| 6532.0 | 1.073 |
| 6533.0 | 1.073 |
| 6534.0 | 1.073 |
| 6535.0 | 1.073 |
| 6536.0 | 1.073 |
| 6537.0 | 1.073 |
| 6538.0 | 1.073 |
| 6539.0 | 1.073 |
| 6540.0 | 1.073 |
| 6541.0 | 1.073 |
| 6542.0 | 1.073 |
| 6543.0 | 1.073 |
| 6544.0 | 1.073 |
| 6545.0 | 1.073 |
| 6546.0 | 1.073 |
| 6547.0 | 1.073 |
| 6548.0 | 1.073 |
| 6549.0 | 1.073 |
| 6550.0 | 1.073 |
| 6551.0 | 1.073 |
| 6552.0 | 1.073 |
| 6553.0 | 1.073 |
| 6554.0 | 1.073 |
| 6555.0 | 1.073 |
| 6556.0 | 1.073 |
| 6557.0 | 1.073 |
| 6558.0 | 1.073 |
| 6559.0 | 1.073 |
| 6560.0 | 1.073 |
| 6561.0 | 1.073 |
| 6562.0 | 1.073 |
| 6563.0 | 1.073 |
| 6564.0 | 1.073 |
| 6565.0 | 1.073 |
| 6566.0 | 1.073 |
| 6567.0 | 1.073 |
| 6568.0 | 1.073 |
| 6569.0 | 1.073 |
| 6570.0 | 1.073 |
| 6571.0 | 1.073 |
| 6572.0 | 1.073 |
| 6573.0 | 1.073 |
| 6574.0 | 1.073 |
| 6575.0 | 1.073 |
| 6576.0 | 1.073 |
| 6577.0 | 1.073 |
| 6578.0 | 1.073 |
| 6579.0 | 1.073 |
| 6580.0 | 1.073 |
| 6581.0 | 1.073 |
| 6582.0 | 1.073 |
| 6583.0 | 1.073 |
| 6584.0 | 1.073 |
| 6585.0 | 1.073 |
| 6586.0 | 1.073 |
| 6587.0 | 1.073 |
| 6588.0 | 1.073 |
| 6589.0 | 1.073 |
| 6590.0 | 1.073 |
| 6591.0 | 1.073 |
| 6592.0 | 1.073 |
| 6593.0 | 1.073 |
| 6594.0 | 1.073 |
| 6595.0 | 1.073 |
| 6596.0 | 1.073 |
| 6597.0 | 1.073 |
| 6598.0 | 1.073 |
| 6599.0 | 1.073 |
| 6600.0 | 1.073 |
| 6601.0 | 1.073 |
| 6602.0 | 1.073 |
| 6603.0 | 1.073 |
| 6604.0 | 1.073 |
| 6605.0 | 1.073 |
| 6606.0 | 1.073 |
| 6607.0 | 1.073 |
| 6608.0 | 1.073 |
| 6609.0 | 1.073 |
| 6610.0 | 1.073 |
| 6611.0 | 1.073 |
| 6612.0 | 1.073 |
| 6613.0 | 1.073 |
| 6614.0 | 1.073 |
| 6615.0 | 1.073 |
| 6616.0 | 1.073 |
| 6617.0 | 1.073 |
| 6618.0 | 1.073 |
| 6619.0 | 1.073 |
| 6620.0 | 1.073 |
| 6621.0 | 1.073 |
| 6622.0 | 1.073 |
| 6623.0 | 1.073 |
| 6624.0 | 1.073 |
| 6625.0 | 1.073 |
| 6626.0 | 1.073 |
| 6627.0 | 1.073 |
| 6628.0 | 1.073 |
| 6629.0 | 1.073 |
| 6630.0 | 1.073 |
| 6631.0 | 1.073 |
| 6632.0 | 1.073 |
| 6633.0 | 1.073 |
| 6634.0 | 1.073 |
| 6635.0 | 1.073 |
| 6636.0 | 1.073 |
| 6637.0 | 1.073 |
| 6638.0 | 1.073 |
| 6639.0 | 1.073 |
| 6640.0 | 1.073 |
| 6641.0 | 1.073 |
| 6642.0 | 1.073 |
| 6643.0 | 1.073 |
| 6644.0 | 1.073 |
| 6645.0 | 1.073 |
| 6646.0 | 1.073 |
| 6647.0 | 1.073 |
| 6648.0 | 1.073 |
| 6649.0 | 1.073 |
| 6650.0 | 1.073 |
| 6651.0 | 1.073 |
| 6652.0 | 1.073 |
| 6653.0 | 1.073 |
| 6654.0 | 1.073 |
| 6655.0 | 1.073 |
| 6656.0 | 1.073 |
| 6657.0 | 1.073 |
| 6658.0 | 1.073 |
| 6659.0 | 1.073 |
| 6660.0 | 1.073 |
| 6661.0 | 1.073 |
| 6662.0 | 1.073 |
| 6663.0 | 1.073 |
| 6664.0 | 1.073 |
| 6665.0 | 1.073 |
| 6666.0 | 1.073 |
| 6667.0 | 1.073 |
| 6668.0 | 1.073 |
| 6669.0 | 1.073 |
| 6670.0 | 1.073 |
| 6671.0 | 1.073 |
| 6672.0 | 1.073 |
| 6673.0 | 1.073 |
| 6674.0 | 1.073 |
| 6675.0 | 1.073 |
| 6676.0 | 1.073 |
| 6677.0 | 1.073 |
| 6678.0 | 1.073 |
| 6679.0 | 1.073 |
| 6680.0 | 1.073 |
| 6681.0 | 1.073 |
| 6682.0 | 1.073 |
| 6683.0 | 1.073 |
| 6684.0 | 1.073 |
| 6685.0 | 1.073 |
| 6686.0 | 1.073 |
| 6687.0 | 1.073 |
| 6688.0 | 1.073 |
| 6689.0 | 1.073 |
| 6690.0 | 1.073 |
| 6691.0 | 1.073 |
| 6692.0 | 1.073 |
| 6693.0 | 1.073 |
| 6694.0 | 1.073 |
| 6695.0 | 1.073 |
| 6696.0 | 1.073 |
| 6697.0 | 1.073 |
| 6698.0 | 1.073 |
| 6699.0 | 1.073 |
| 6700.0 | 1.073 |
| 6701.0 | 1.073 |
| 6702.0 | 1.073 |
| 6703.0 | 1.073 |
| 6704.0 | 1.073 |
| 6705.0 | 1.073 |
| 6706.0 | 1.073 |
| 6707.0 | 1.073 |
| 6708.0 | 1.073 |
| 6709.0 | 1.073 |
| 6710.0 | 1.073 |
| 6711.0 | 1.073 |
| 6712.0 | 1.073 |
| 6713.0 | 1.073 |
| 6714.0 | 1.073 |
| 6715.0 | 1.073 |
| 6716.0 | 1.073 |
| 6717.0 | 1.073 |
| 6718.0 | 1.073 |
| 6719.0 | 1.073 |
| 6720.0 | 1.073 |
| 6721.0 | 1.073 |
| 6722.0 | 1.073 |
| 6723.0 | 1.073 |
| 6724.0 | 1.073 |
| 6725.0 | 1.073 |
| 6726.0 | 1.073 |
| 6727.0 | 1.073 |
| 6728.0 | 1.073 |
| 6729.0 | 1.073 |
| 6730.0 | 1.073 |
| 6731.0 | 1.073 |
| 6732.0 | 1.073 |
| 6733.0 | 1.073 |
| 6734.0 | 1.073 |
| 6735.0 | 1.073 |
| 6736.0 | 1.073 |
| 6737.0 | 1.073 |
| 6738.0 | 1.073 |
| 6739.0 | 1.073 |
| 6740.0 | 1.073 |
| 6741.0 | 1.073 |
| 6742.0 | 1.073 |
| 6743.0 | 1.073 |
| 6744.0 | 1.073 |
| 6745.0 | 1.073 |
| 6746.0 | 1.073 |
| 6747.0 | 1.073 |
| 6748.0 | 1.073 |
| 6749.0 | 1.073 |
| 6750.0 | 1.073 |
| 6751.0 | 1.073 |
| 6752.0 | 1.073 |
| 6753.0 | 1.073 |
| 6754.0 | 1.073 |
| 6755.0 | 1.073 |
| 6756.0 | 1.073 |
| 6757.0 | 1.073 |
| 6758.0 | 1.073 |
| 6759.0 | 1.073 |
| 6760.0 | 1.073 |
| 6761.0 | 1.073 |
| 6762.0 | 1.073 |
| 6763.0 | 1.073 |
| 6764.0 | 1.073 |
| 6765.0 | 1.073 |
| 6766.0 | 1.073 |
| 6767.0 | 1.073 |
| 6768.0 | 1.073 |
| 6769.0 | 1.073 |
| 6770.0 | 1.073 |
| 6771.0 | 1.073 |
| 6772.0 | 1.073 |
| 6773.0 | 1.073 |
| 6774.0 | 1.073 |
| 6775.0 | 1.073 |
| 6776.0 | 1.073 |
| 6777.0 | 1.073 |
| 6778.0 | 1.073 |
| 6779.0 | 1.073 |
| 6780.0 | 1.073 |
| 6781.0 | 1.073 |
| 6782.0 | 1.073 |
| 6783.0 | 1.073 |
| 6784.0 | 1.073 |
| 6785.0 | 1.073 |
| 6786.0 | 1.073 |
| 6787.0 | 1.073 |
| 6788.0 | 1.073 |
| 6789.0 | 1.073 |
| 6790.0 | 1.073 |
| 6791.0 | 1.073 |
| 6792.0 | 1.073 |
| 6793.0 | 1.073 |
| 6794.0 | 1.073 |
| 6795.0 | 1.073 |
| 6796.0 | 1.073 |
| 6797.0 | 1.073 |
| 6798.0 | 1.073 |
| 6799.0 | 1.073 |
| 6800.0 | 1.073 |
| 6801.0 | 1.073 |
| 6802.0 | 1.073 |
| 6803.0 | 1.073 |
| 6804.0 | 1.073 |
| 6805.0 | 1.073 |
| 6806.0 | 1.073 |
| 6807.0 | 1.073 |
| 6808.0 | 1.073 |
| 6809.0 | 1.073 |
| 6810.0 | 1.073 |
| 6811.0 | 1.073 |
| 6812.0 | 1.073 |
| 6813.0 | 1.073 |
| 6814.0 | 1.073 |
| 6815.0 | 1.073 |
| 6816.0 | 1.073 |
| 6817.0 | 1.073 |
| 6818.0 | 1.073 |
| 6819.0 | 1.073 |
| 6820.0 | 1.073 |
| 6821.0 | 1.073 |
| 6822.0 | 1.073 |
| 6823.0 | 1.073 |
| 6824.0 | 1.073 |
| 6825.0 | 1.073 |
| 6826.0 | 1.073 |
| 6827.0 | 1.073 |
| 6828.0 | 1.073 |
| 6829.0 | 1.073 |
| 6830.0 | 1.073 |
| 6831.0 | 1.073 |
| 6832.0 | 1.073 |
| 6833.0 | 1.073 |
| 6834.0 | 1.073 |
| 6835.0 | 1.073 |
| 6836.0 | 1.073 |
| 6837.0 | 1.073 |
| 6838.0 | 1.073 |
| 6839.0 | 1.073 |
| 6840.0 | 1.073 |
| 6841.0 | 1.073 |
| 6842.0 | 1.073 |
| 6843.0 | 1.073 |
| 6844.0 | 1.073 |
| 6845.0 | 1.073 |
| 6846.0 | 1.073 |
| 6847.0 | 1.073 |
| 6848.0 | 1.073 |
| 6849.0 | 1.073 |
| 6850.0 | 1.073 |
| 6851.0 | 1.073 |
| 6852.0 | 1.073 |
| 6853.0 | 1.073 |
| 6854.0 | 1.073 |
| 6855.0 | 1.073 |
| 6856.0 | 1.073 |
| 6857.0 | 1.073 |
| 6858.0 | 1.073 |
| 6859.0 | 1.073 |
| 6860.0 | 1.073 |
| 6861.0 | 1.073 |
| 6862.0 | 1.073 |
| 6863.0 | 1.073 |
| 6864.0 | 1.073 |
| 6865.0 | 1.073 |
| 6866.0 | 1.073 |
| 6867.0 | 1.073 |
| 6868.0 | 1.073 |
| 6869.0 | 1.073 |
| 6870.0 | 1.073 |
| 6871.0 | 1.073 |
| 6872.0 | 1.073 |
| 6873.0 | 1.073 |
| 6874.0 | 1.073 |
| 6875.0 | 1.073 |
| 6876.0 | 1.073 |
| 6877.0 | 1.073 |
| 6878.0 | 1.073 |
| 6879.0 | 1.073 |
| 6880.0 | 1.073 |
| 6881.0 | 1.073 |
| 6882.0 | 1.073 |
| 6883.0 | 1.073 |
| 6884.0 | 1.073 |
| 6885.0 | 1.073 |
| 6886.0 | 1.073 |
| 6887.0 | 1.073 |
| 6888.0 | 1.073 |
| 6889.0 | 1.073 |
| 6890.0 | 1.073 |
| 6891.0 | 1.073 |
| 6892.0 | 1.073 |
| 6893.0 | 1.073 |
| 6894.0 | 1.073 |
| 6895.0 | 1.073 |
| 6896.0 | 1.073 |
| 6897.0 | 1.073 |
| 6898.0 | 1.073 |
| 6899.0 | 1.073 |
| 6900.0 | 1.073 |
| 6901.0 | 1.073 |
| 6902.0 | 1.073 |
| 6903.0 | 1.073 |
| 6904.0 | 1.073 |
| 6905.0 | 1.073 |
| 6906.0 | 1.073 |
| 6907.0 | 1.073 |
| 6908.0 | 1.073 |
| 6909.0 | 1.073 |
| 6910.0 | 1.073 |
| 6911.0 | 1.073 |
| 6912.0 | 1.073 |
| 6913.0 | 1.073 |
| 6914.0 | 1.073 |
| 6915.0 | 1.073 |
| 6916.0 | 1.073 |
| 6917.0 | 1.073 |
| 6918.0 | 1.073 |
| 6919.0 | 1.073 |
| 6920.0 | 1.073 |
| 6921.0 | 1.073 |
| 6922.0 | 1.073 |
| 6923.0 | 1.073 |
| 6924.0 | 1.073 |
| 6925.0 | 1.073 |
| 6926.0 | 1.073 |
| 6927.0 | 1.073 |
| 6928.0 | 1.073 |
| 6929.0 | 1.073 |
| 6930.0 | 1.073 |
| 6931.0 | 1.073 |
| 6932.0 | 1.073 |
| 6933.0 | 1.073 |
| 6934.0 | 1.073 |
| 6935.0 | 1.073 |
| 6936.0 | 1.073 |
| 6937.0 | 1.073 |
| 6938.0 | 1.073 |
| 6939.0 | 1.073 |
| 6940.0 | 1.073 |
| 6941.0 | 1.073 |
| 6942.0 | 1.073 |
| 6943.0 | 1.073 |
| 6944.0 | 1.073 |
| 6945.0 | 1.073 |
| 6946.0 | 1.073 |
| 6947.0 | 1.073 |
| 6948.0 | 1.073 |
| 6949.0 | 1.073 |
| 6950.0 | 1.073 |
| 6951.0 | 1.073 |
| 6952.0 | 1.073 |
| 6953.0 | 1.073 |
| 6954.0 | 1.073 |
| 6955.0 | 1.073 |
| 6956.0 | 1.073 |
| 6957.0 | 1.073 |
| 6958.0 | 1.073 |
| 6959.0 | 1.073 |
| 6960.0 | 1.073 |
| 6961.0 | 1.073 |
| 6962.0 | 1.073 |
| 6963.0 | 1.073 |
| 6964.0 | 1.073 |
| 6965.0 | 1.073 |
| 6966.0 | 1.073 |
| 6967.0 | 1.073 |
| 6968.0 | 1.073 |
| 6969.0 | 1.073 |
| 6970.0 | 1.073 |
| 6971.0 | 1.073 |
| 6972.0 | 1.073 |
| 6973.0 | 1.073 |
| 6974.0 | 1.073 |
| 6975.0 | 1.073 |
| 6976.0 | 1.073 |
| 6977.0 | 1.073 |
| 6978.0 | 1.073 |
| 6979.0 | 1.073 |
| 6980.0 | 1.073 |
| 6981.0 | 1.073 |
| 6982.0 | 1.073 |
| 6983.0 | 1.073 |
| 6984.0 | 1.073 |
| 6985.0 | 1.073 |
| 6986.0 | 1.073 |
| 6987.0 | 1.073 |
| 6988.0 | 1.073 |
| 6989.0 | 1.073 |
| 6990.0 | 1.073 |
| 6991.0 | 1.073 |
| 6992.0 | 1.073 |
| 6993.0 | 1.073 |
| 6994.0 | 1.073 |
| 6995.0 | 1.073 |
| 6996.0 | 1.073 |
| 6997.0 | 1.073 |
| 6998.0 | 1.073 |
| 6999.0 | 1.073 |
| 7000.0 | 1.073 |
| 7001.0 | 1.073 |
| 7002.0 | 1.073 |
| 7003.0 | 1.073 |
| 7004.0 | 1.073 |
| 7005.0 | 1.073 |
| 7006.0 | 1.073 |
| 7007.0 | 1.073 |
| 7008.0 | 1.073 |
| 7009.0 | 1.073 |
| 7010.0 | 1.073 |
| 7011.0 | 1.073 |
| 7012.0 | 1.073 |
| 7013.0 | 1.073 |
| 7014.0 | 1.073 |
| 7015.0 | 1.073 |
| 7016.0 | 1.073 |
| 7017.0 | 1.073 |
| 7018.0 | 1.073 |
| 7019.0 | 1.073 |
| 7020.0 | 1.073 |
| 7021.0 | 1.073 |
| 7022.0 | 1.073 |
| 7023.0 | 1.073 |
| 7024.0 | 1.073 |
| 7025.0 | 1.073 |
| 7026.0 | 1.073 |
| 7027.0 | 1.073 |
| 7028.0 | 1.073 |
| 7029.0 | 1.073 |
| 7030.0 | 1.073 |
| 7031.0 | 1.073 |
| 7032.0 | 1.073 |
| 7033.0 | 1.073 |
| 7034.0 | 1.073 |
| 7035.0 | 1.073 |
| 7036.0 | 1.073 |
| 7037.0 | 1.073 |
| 7038.0 | 1.073 |
| 7039.0 | 1.073 |
| 7040.0 | 1.073 |
| 7041.0 | 1.073 |
| 7042.0 | 1.073 |
| 7043.0 | 1.073 |
| 7044.0 | 1.073 |
| 7045.0 | 1.073 |
| 7046.0 | 1.073 |
| 7047.0 | 1.073 |
| 7048.0 | 1.073 |
| 7049.0 | 1.073 |
| 7050.0 | 1.073 |
| 7051.0 | 1.073 |
| 7052.0 | 1.073 |
| 7053.0 | 1.073 |
| 7054.0 | 1.073 |
| 7055.0 | 1.073 |
| 7056.0 | 1.073 |
| 7057.0 | 1.073 |
| 7058.0 | 1.073 |
| 7059.0 | 1.073 |
| 7060.0 | 1.073 |
| 7061.0 | 1.073 |
| 7062.0 | 1.073 |
| 7063.0 | 1.073 |
| 7064.0 | 1.073 |
| 7065.0 | 1.073 |
| 7066.0 | 1.073 |
| 7067.0 | 1.073 |
| 7068.0 | 1.073 |
| 7069.0 | 1.073 |
| 7070.0 | 1.073 |
| 7071.0 | 1.073 |
| 7072.0 | 1.073 |
| 7073.0 | 1.073 |
| 7074.0 | 1.073 |
| 7075.0 | 1.073 |
| 7076.0 | 1.073 |
| 7077.0 | 1.073 |
| 7078.0 | 1.073 |
| 7079.0 | 1.073 |
| 7080.0 | 1.073 |
| 7081.0 | 1.073 |
| 7082.0 | 1.073 |
| 7083.0 | 1.073 |
| 7084.0 | 1.073 |
| 7085.0 | 1.073 |
| 7086.0 | 1.073 |
| 7087.0 | 1.073 |
| 7088.0 | 1.073 |
| 7089.0 | 1.073 |
| 7090.0 | 1.073 |
| 7091.0 | 1.073 |
| 7092.0 | 1.073 |
| 7093.0 | 1.073 |
| 7094.0 | 1.073 |
| 7095.0 | 1.073 |
| 7096.0 | 1.073 |
| 7097.0 | 1.073 |
| 7098.0 | 1.073 |
| 7099.0 | 1.073 |
| 7100.0 | 1.073 |
| 7101.0 | 1.073 |
| 7102.0 | 1.073 |
| 7103.0 | 1.073 |
| 7104.0 | 1.073 |
| 7105.0 | 1.073 |
| 7106.0 | 1.073 |
| 7107.0 | 1.073 |
| 7108.0 | 1.073 |
| 7109.0 | 1.073 |
| 7110.0 | 1.073 |
| 7111.0 | 1.073 |
| 7112.0 | 1.073 |
| 7113.0 | 1.073 |
| 7114.0 | 1.073 |
| 7115.0 | 1.073 |
| 7116.0 | 1.073 |
| 7117.0 | 1.073 |
| 7118.0 | 1.073 |
| 7119.0 | 1.073 |
| 7120.0 | 1.073 |
| 7121.0 | 1.073 |
| 7122.0 | 1.073 |
| 7123.0 | 1.073 |
| 7124.0 | 1.073 |
| 7125.0 | 1.073 |
| 7126.0 | 1.073 |
| 7127.0 | 1.073 |
| 7128.0 | 1.073 |
| 7129.0 | 1.073 |
| 7130.0 | 1.073 |
| 7131.0 | 1.073 |
| 7132.0 | 1.073 |
| 7133.0 | 1.073 |
| 7134.0 | 1.073 |
| 7135.0 | 1.073 |
| 7136.0 | 1.073 |
| 7137.0 | 1.073 |
| 7138.0 | 1.073 |
| 7139.0 | 1.073 |
| 7140.0 | 1.073 |
| 7141.0 | 1.073 |
| 7142.0 | 1.073 |
| 7143.0 | 1.073 |
| 7144.0 | 1.073 |
| 7145.0 | 1.073 |
| 7146.0 | 1.073 |
| 7147.0 | 1.073 |
| 7148.0 | 1.073 |
| 7149.0 | 1.073 |
| 7150.0 | 1.073 |
| 7151.0 | 1.073 |
| 7152.0 | 1.073 |
| 7153.0 | 1.073 |
| 7154.0 | 1.073 |
| 7155.0 | 1.073 |
| 7156.0 | 1.073 |
| 7157.0 | 1.073 |
| 7158.0 | 1.073 |
| 7159.0 | 1.073 |
| 7160.0 | 1.073 |
| 7161.0 | 1.073 |
| 7162.0 | 1.073 |
| 7163.0 | 1.073 |
| 7164.0 | 1.073 |
| 7165.0 | 1.073 |
| 7166.0 | 1.073 |
| 7167.0 | 1.073 |
| 7168.0 | 1.073 |
| 7169.0 | 1.073 |
| 7170.0 | 1.073 |
| 7171.0 | 1.073 |
| 7172.0 | 1.073 |
| 7173.0 | 1.073 |
| 7174.0 | 1.073 |
| 7175.0 | 1.073 |
| 7176.0 | 1.073 |
| 7177.0 | 1.073 |
| 7178.0 | 1.073 |
| 7179.0 | 1.073 |
| 7180.0 | 1.073 |
| 7181.0 | 1.073 |
| 7182.0 | 1.073 |
| 7183.0 | 1.073 |
| 7184.0 | 1.073 |
| 7185.0 | 1.073 |
| 7186.0 | 1.073 |
| 7187.0 | 1.073 |
| 7188.0 | 1.073 |
| 7189.0 | 1.073 |
| 7190.0 | 1.073 |
| 7191.0 | 1.073 |
| 7192.0 | 1.073 |
| 7193.0 | 1.073 |
| 7194.0 | 1.073 |
| 7195.0 | 1.073 |
| 7196.0 | 1.073 |
| 7197.0 | 1.073 |
| 7198.0 | 1.073 |
| 7199.0 | 1.073 |
| 7200.0 | 1.073 |
| 7201.0 | 1.073 |
| 7202.0 | 1.073 |
| 7203.0 | 1.073 |
| 7204.0 | 1.073 |
| 7205.0 | 1.073 |
| 7206.0 | 1.073 |
| 7207.0 | 1.073 |
| 7208.0 | 1.073 |
| 7209.0 | 1.073 |
| 7210.0 | 1.073 |
| 7211.0 | 1.073 |
| 7212.0 | 1.073 |
| 7213.0 | 1.073 |
| 7214.0 | 1.073 |
| 7215.0 | 1.073 |
| 7216.0 | 1.073 |
| 7217.0 | 1.073 |
| 7218.0 | 1.073 |
| 7219.0 | 1.073 |
| 7220.0 | 1.073 |
| 7221.0 | 1.073 |
| 7222.0 | 1.073 |
| 7223.0 | 1.073 |
| 7224.0 | 1.073 |
| 7225.0 | 1.073 |
| 7226.0 | 1.073 |
| 7227.0 | 1.073 |
| 7228.0 | 1.073 |
| 7229.0 | 1.073 |
| 7230.0 | 1.073 |
| 7231.0 | 1.073 |
| 7232.0 | 1.073 |
| 7233.0 | 1.073 |
| 7234.0 | 1.073 |
| 7235.0 | 1.073 |
| 7236.0 | 1.073 |
| 7237.0 | 1.073 |
| 7238.0 | 1.073 |
| 7239.0 | 1.073 |
| 7240.0 | 1.073 |
| 7241.0 | 1.073 |
| 7242.0 | 1.073 |
| 7243.0 | 1.073 |
| 7244.0 | 1.073 |
| 7245.0 | 1.073 |
| 7246.0 | 1.073 |
| 7247.0 | 1.073 |
| 7248.0 | 1.073 |
| 7249.0 | 1.073 |
| 7250.0 | 1.073 |
| 7251.0 | 1.073 |
| 7252.0 | 1.073 |
| 7253.0 | 1.073 |
| 7254.0 | 1.073 |
| 7255.0 | 1.073 |
| 7256.0 | 1.073 |
| 7257.0 | 1.073 |
| 7258.0 | 1.073 |
| 7259.0 | 1.073 |
| 7260.0 | 1.073 |
| 7261.0 | 1.073 |
| 7262.0 | 1.073 |
| 7263.0 | 1.073 |
| 7264.0 | 1.073 |
| 7265.0 | 1.073 |
| 7266.0 | 1.073 |
| 7267.0 | 1.073 |
| 7268.0 | 1.073 |
| 7269.0 | 1.073 |
| 7270.0 | 1.073 |
| 7271.0 | 1.073 |
| 7272.0 | 1.073 |
| 7273.0 | 1.073 |
| 7274.0 | 1.073 |
| 7275.0 | 1.073 |
| 7276.0 | 1.073 |
| 7277.0 | 1.073 |
| 7278.0 | 1.073 |
| 7279.0 | 1.073 |
| 7280.0 | 1.073 |
| 7281.0 | 1.073 |
| 7282.0 | 1.073 |
| 7283.0 | 1.073 |
| 7284.0 | 1.073 |
| 7285.0 | 1.073 |
| 7286.0 | 1.073 |
| 7287.0 | 1.073 |
| 7288.0 | 1.073 |
| 7289.0 | 1.073 |
| 7290.0 | 1.073 |
| 7291.0 | 1.073 |
| 7292.0 | 1.073 |
| 7293.0 | 1.073 |
| 7294.0 | 1.073 |
| 7295.0 | 1.073 |
| 7296.0 | 1.073 |
| 7297.0 | 1.073 |
| 7298.0 | 1.073 |
| 7299.0 | 1.073 |
| 7300.0 | 1.073 |
| 7301.0 | 1.073 |
| 7302.0 | 1.073 |
| 7303.0 | 1.073 |
| 7304.0 | 1.073 |
| 7305.0 | 1.073 |
| 7306.0 | 1.073 |
| 7307.0 | 1.073 |
| 7308.0 | 1.073 |
| 7309.0 | 1.073 |
| 7310.0 | 1.073 |
| 7311.0 | 1.073 |
| 7312.0 | 1.073 |
| 7313.0 | 1.073 |
| 7314.0 | 1.073 |
| 7315.0 | 1.073 |
| 7316.0 | 1.073 |
| 7317.0 | 1.073 |
| 7318.0 | 1.073 |
| 7319.0 | 1.073 |
| 7320.0 | 1.073 |
| 7321.0 | 1.073 |
| 7322.0 | 1.073 |
| 7323.0 | 1.073 |
| 7324.0 | 1.073 |
| 7325.0 | 1.073 |
| 7326.0 | 1.073 |
| 7327.0 | 1.073 |
| 7328.0 | 1.073 |
| 7329.0 | 1.073 |
| 7330.0 | 1.073 |
| 7331.0 | 1.073 |
| 7332.0 | 1.073 |
| 7333.0 | 1.073 |
| 7334.0 | 1.073 |
| 7335.0 | 1.073 |
| 7336.0 | 1.073 |
| 7337.0 | 1.073 |
| 7338.0 | 1.073 |
| 7339.0 | 1.073 |
| 7340.0 | 1.073 |
| 7341.0 | 1.073 |
| 7342.0 | 1.073 |
| 7343.0 | 1.073 |
| 7344.0 | 1.073 |
| 7345.0 | 1.073 |
| 7346.0 | 1.073 |
| 7347.0 | 1.073 |
| 7348.0 | 1.073 |
| 7349.0 | 1.073 |
| 7350.0 | 1.073 |
| 7351.0 | 1.073 |
| 7352.0 | 1.073 |
| 7353.0 | 1.073 |
| 7354.0 | 1.073 |
| 7355.0 | 1.073 |
| 7356.0 | 1.073 |
| 7357.0 | 1.073 |
| 7358.0 | 1.073 |
| 7359.0 | 1.073 |
| 7360.0 | 1.073 |
| 7361.0 | 1.073 |
| 7362.0 | 1.073 |
| 7363.0 | 1.073 |
| 7364.0 | 1.073 |
| 7365.0 | 1.073 |
| 7366.0 | 1.073 |
| 7367.0 | 1.073 |
| 7368.0 | 1.073 |
| 7369.0 | 1.073 |
| 7370.0 | 1.073 |
| 7371.0 | 1.073 |
| 7372.0 | 1.073 |
| 7373.0 | 1.073 |
| 7374.0 | 1.073 |
| 7375.0 | 1.073 |
| 7376.0 | 1.073 |
| 7377.0 | 1.073 |
| 7378.0 | 1.073 |
| 7379.0 | 1.073 |
| 7380.0 | 1.073 |
| 7381.0 | 1.073 |
| 7382.0 | 1.073 |
| 7383.0 | 1.073 |
| 7384.0 | 1.073 |
| 7385.0 | 1.073 |
| 7386.0 | 1.073 |
| 7387.0 | 1.073 |
| 7388.0 | 1.073 |
| 7389.0 | 1.073 |
| 7390.0 | 1.073 |
| 7391.0 | 1.073 |
| 7392.0 | 1.073 |
| 7393.0 | 1.073 |
| 7394.0 | 1.073 |
| 7395.0 | 1.073 |
| 7396.0 | 1.073 |
| 7397.0 | 1.073 |
| 7398.0 | 1.073 |
| 7399.0 | 1.073 |
| 7400.0 | 1.073 |
| 7401.0 | 1.073 |
| 7402.0 | 1.073 |
| 7403.0 | 1.073 |
| 7404.0 | 1.073 |
| 7405.0 | 1.073 |
| 7406.0 | 1.073 |
| 7407.0 | 1.073 |
| 7408.0 | 1.073 |
| 7409.0 | 1.073 |
| 7410.0 | 1.073 |
| 7411.0 | 1.073 |
| 7412.0 | 1.073 |
| 7413.0 | 1.073 |
| 7414.0 | 1.073 |
| 7415.0 | 1.073 |
| 7416.0 | 1.073 |
| 7417.0 | 1.073 |
| 7418.0 | 1.073 |
| 7419.0 | 1.073 |
| 7420.0 | 1.073 |
| 7421.0 | 1.073 |
| 7422.0 | 1.073 |
| 7423.0 | 1.073 |
| 7424.0 | 1.073 |
| 7425.0 | 1.073 |
| 7426.0 | 1.073 |
| 7427.0 | 1.073 |
| 7428.0 | 1.073 |
| 7429.0 | 1.073 |
| 7430.0 | 1.073 |
| 7431.0 | 1.073 |
| 7432.0 | 1.073 |
| 7433.0 | 1.073 |
| 7434.0 | 1.073 |
| 7435.0 | 1.073 |
| 7436.0 | 1.073 |
| 7437.0 | 1.073 |
| 7438.0 | 1.073 |
| 7439.0 | 1.073 |
| 7440.0 | 1.073 |
| 7441.0 | 1.073 |
| 7442.0 | 1.073 |
| 7443.0 | 1.073 |
| 7444.0 | 1.073 |
| 7445.0 | 1.073 |
| 7446.0 | 1.073 |
| 7447.0 | 1.073 |
| 7448.0 | 1.073 |
| 7449.0 | 1.073 |
| 7450.0 | 1.073 |
| 7451.0 | 1.073 |
| 7452.0 | 1.073 |
| 7453.0 | 1.073 |
| 7454.0 | 1.073 |
| 7455.0 | 1.073 |
| 7456.0 | 1.073 |
| 7457.0 | 1.073 |
| 7458.0 | 1.073 |
| 7459.0 | 1.073 |
| 7460.0 | 1.073 |
| 7461.0 | 1.073 |
| 7462.0 | 1.073 |
| 7463.0 | 1.073 |
| 7464.0 | 1.073 |
| 7465.0 | 1.073 |
| 7466.0 | 1.073 |
| 7467.0 | 1.073 |
| 7468.0 | 1.073 |
| 7469.0 | 1.073 |
| 7470.0 | 1.073 |
| 7471.0 | 1.073 |
| 7472.0 | 1.073 |
| 7473.0 | 1.073 |
| 7474.0 | 1.073 |
| 7475.0 | 1.073 |
| 7476.0 | 1.073 |
| 7477.0 | 1.073 |
| 7478.0 | 1.073 |
| 7479.0 | 1.073 |
| 7480.0 | 1.073 |
| 7481.0 | 1.073 |
| 7482.0 | 1.073 |
| 7483.0 | 1.073 |
| 7484.0 | 1.073 |
| 7485.0 | 1.073 |
| 7486.0 | 1.073 |
| 7487.0 | 1.073 |
| 7488.0 | 1.073 |
| 7489.0 | 1.073 |
| 7490.0 | 1.073 |
| 7491.0 | 1.073 |
| 7492.0 | 1.073 |
| 7493.0 | 1.073 |
| 7494.0 | 1.073 |
| 7495.0 | 1.073 |
| 7496.0 | 1.073 |
| 7497.0 | 1.073 |
| 7498.0 | 1.073 |
| 7499.0 | 1.073 |
| 7500.0 | 1.073 |
| 7501.0 | 1.073 |
| 7502.0 | 1.073 |
| 7503.0 | 1.073 |
| 7504.0 | 1.073 |
| 7505.0 | 1.073 |
| 7506.0 | 1.073 |
| 7507.0 | 1.073 |
| 7508.0 | 1.073 |
| 7509.0 | 1.073 |
| 7510.0 | 1.073 |
| 7511.0 | 1.073 |
| 7512.0 | 1.073 |
| 7513.0 | 1.073 |
| 7514.0 | 1.073 |
| 7515.0 | 1.073 |
| 7516.0 | 1.073 |
| 7517.0 | 1.073 |
| 7518.0 | 1.073 |
| 7519.0 | 1.073 |
| 7520.0 | 1.073 |
| 7521.0 | 1.073 |
| 7522.0 | 1.073 |
| 7523.0 | 1.073 |
| 7524.0 | 1.073 |
| 7525.0 | 1.073 |
| 7526.0 | 1.073 |
| 7527.0 | 1.073 |
| 7528.0 | 1.073 |
| 7529.0 | 1.073 |
| 7530.0 | 1.073 |
| 7531.0 | 1.073 |
| 7532.0 | 1.073 |
| 7533.0 | 1.073 |
| 7534.0 | 1.073 |
| 7535.0 | 1.073 |
| 7536.0 | 1.073 |
| 7537.0 | 1.073 |
| 7538.0 | 1.073 |
| 7539.0 | 1.073 |
| 7540.0 | 1.073 |
| 7541.0 | 1.073 |
| 7542.0 | 1.073 |
| 7543.0 | 1.073 |
| 7544.0 | 1.073 |
| 7545.0 | 1.073 |
| 7546.0 | 1.073 |
| 7547.0 | 1.073 |
| 7548.0 | 1.073 |
| 7549.0 | 1.073 |
| 7550.0 | 1.073 |
| 7551.0 | 1.073 |
| 7552.0 | 1.073 |
| 7553.0 | 1.073 |
| 7554.0 | 1.073 |
| 7555.0 | 1.073 |
| 7556.0 | 1.073 |
| 7557.0 | 1.073 |
| 7558.0 | 1.073 |
| 7559.0 | 1.073 |
| 7560.0 | 1.073 |
| 7561.0 | 1.073 |
| 7562.0 | 1.073 |
| 7563.0 | 1.073 |
| 7564.0 | 1.073 |
| 7565.0 | 1.073 |
| 7566.0 | 1.073 |
| 7567.0 | 1.073 |
| 7568.0 | 1.073 |
| 7569.0 | 1.073 |
| 7570.0 | 1.073 |
| 7571.0 | 1.073 |
| 7572.0 | 1.073 |
| 7573.0 | 1.073 |
| 7574.0 | 1.073 |
| 7575.0 | 1.073 |
| 7576.0 | 1.073 |
| 7577.0 | 1.073 |
| 7578.0 | 1.073 |
| 7579.0 | 1.073 |
| 7580.0 | 1.073 |
| 7581.0 | 1.073 |
| 7582.0 | 1.073 |
| 7583.0 | 1.073 |
| 7584.0 | 1.073 |
| 7585.0 | 1.073 |
| 7586.0 | 1.073 |
| 7587.0 | 1.073 |
| 7588.0 | 1.073 |
| 7589.0 | 1.073 |
| 7590.0 | 1.073 |
| 7591.0 | 1.073 |
| 7592.0 | 1.073 |
| 7593.0 | 1.073 |
| 7594.0 | 1.073 |
| 7595.0 | 1.073 |
| 7596.0 | 1.073 |
| 7597.0 | 1.073 |
| 7598.0 | 1.073 |
| 7599.0 | 1.073 |
| 7600.0 | 1.073 |
| 7601.0 | 1.073 |
| 7602.0 | 1.073 |
| 7603.0 | 1.073 |
| 7604.0 | 1.073 |
| 7605.0 | 1.073 |
| 7606.0 | 1.073 |
| 7607.0 | 1.073 |
| 7608.0 | 1.073 |
| 7609.0 | 1.073 |
| 7610.0 | 1.073 |
| 7611.0 | 1.073 |
| 7612.0 | 1.073 |
| 7613.0 | 1.073 |
| 7614.0 | 1.073 |
| 7615.0 | 1.073 |
| 7616.0 | 1.073 |
| 7617.0 | 1.073 |
| 7618.0 | 1.073 |
| 7619.0 | 1.073 |
| 7620.0 | 1.073 |
| 7621.0 | 1.073 |
| 7622.0 | 1.073 |
| 7623.0 | 1.073 |
| 7624.0 | 1.073 |
| 7625.0 | 1.073 |
| 7626.0 | 1.073 |
| 7627.0 | 1.073 |
| 7628.0 | 1.073 |
| 7629.0 | 1.073 |
| 7630.0 | 1.073 |
| 7631.0 | 1.073 |
| 7632.0 | 1.073 |
| 7633.0 | 1.073 |
| 7634.0 | 1.073 |
| 7635.0 | 1.073 |
| 7636.0 | 1.073 |
| 7637.0 | 1.073 |
| 7638.0 | 1.073 |
| 7639.0 | 1.073 |
| 7640.0 | 1.073 |
| 7641.0 | 1.073 |
| 7642.0 | 1.073 |
| 7643.0 | 1.073 |
| 7644.0 | 1.073 |
| 7645.0 | 1.073 |
| 7646.0 | 1.073 |
| 7647.0 | 1.073 |
| 7648.0 | 1.073 |
| 7649.0 | 1.073 |
| 7650.0 | 1.073 |
| 7651.0 | 1.073 |
| 7652.0 | 1.073 |
| 7653.0 | 1.073 |
| 7654.0 | 1.073 |
| 7655.0 | 1.073 |
| 7656.0 | 1.073 |
| 7657.0 | 1.073 |
| 7658.0 | 1.073 |
| 7659.0 | 1.073 |
| 7660.0 | 1.073 |
| 7661.0 | 1.073 |
| 7662.0 | 1.073 |
| 7663.0 | 1.073 |
| 7664.0 | 1.073 |
| 7665.0 | 1.073 |
| 7666.0 | 1.073 |
| 7667.0 | 1.073 |
| 7668.0 | 1.073 |
| 7669.0 | 1.073 |
| 7670.0 | 1.073 |
| 7671.0 | 1.073 |
| 7672.0 | 1.073 |
| 7673.0 | 1.073 |
| 7674.0 | 1.073 |
| 7675.0 | 1.073 |
| 7676.0 | 1.073 |
| 7677.0 | 1.073 |
| 7678.0 | 1.073 |
| 7679.0 | 1.073 |
| 7680.0 | 1.073 |
| 7681.0 | 1.073 |
| 7682.0 | 1.073 |
| 7683.0 | 1.073 |
| 7684.0 | 1.073 |
| 7685.0 | 1.073 |
| 7686.0 | 1.073 |
| 7687.0 | 1.073 |
| 7688.0 | 1.073 |
| 7689.0 | 1.073 |
| 7690.0 | 1.073 |
| 7691.0 | 1.073 |
| 7692.0 | 1.073 |
| 7693.0 | 1.073 |
| 7694.0 | 1.073 |
| 7695.0 | 1.073 |
| 7696.0 | 1.073 |
| 7697.0 | 1.073 |
| 7698.0 | 1.073 |
| 7699.0 | 1.073 |
| 7700.0 | 1.073 |
| 7701.0 | 1.073 |
| 7702.0 | 1.073 |
| 7703.0 | 1.073 |
| 7704.0 | 1.073 |
| 7705.0 | 1.073 |
| 7706.0 | 1.073 |
| 7707.0 | 1.073 |
| 7708.0 | 1.073 |
| 7709.0 | 1.073 |
| 7710.0 | 1.073 |
| 7711.0 | 1.073 |
| 7712.0 | 1.073 |
| 7713.0 | 1.073 |
| 7714.0 | 1.073 |
| 7715.0 | 1.073 |
| 7716.0 | 1.073 |
| 7717.0 | 1.073 |
| 7718.0 | 1.073 |
| 7719.0 | 1.073 |
| 7720.0 | 1.073 |
| 7721.0 | 1.073 |
| 7722.0 | 1.073 |
| 7723.0 | 1.073 |
| 7724.0 | 1.073 |
| 7725.0 | 1.073 |
| 7726.0 | 1.073 |
| 7727.0 | 1.073 |
| 7728.0 | 1.073 |
| 7729.0 | 1.073 |
| 7730.0 | 1.073 |
| 7731.0 | 1.073 |
| 7732.0 | 1.073 |
| 7733.0 | 1.073 |
| 7734.0 | 1.073 |
| 7735.0 | 1.073 |
| 7736.0 | 1.073 |
| 7737.0 | 1.073 |
| 7738.0 | 1.073 |
| 7739.0 | 1.073 |
| 7740.0 | 1.073 |
| 7741.0 | 1.073 |
| 7742.0 | 1.073 |
| 7743.0 | 1.073 |
| 7744.0 | 1.073 |
| 7745.0 | 1.073 |
| 7746.0 | 1.073 |
| 7747.0 | 1.073 |
| 7748.0 | 1.073 |
| 7749.0 | 1.073 |
| 7750.0 | 1.073 |
| 7751.0 | 1.073 |
| 7752.0 | 1.073 |
| 7753.0 | 1.073 |
| 7754.0 | 1.073 |
| 7755.0 | 1.073 |
| 7756.0 | 1.073 |
| 7757.0 | 1.073 |
| 7758.0 | 1.073 |
| 7759.0 | 1.073 |
| 7760.0 | 1.073 |
| 7761.0 | 1.073 |
| 7762.0 | 1.073 |
| 7763.0 | 1.073 |
| 7764.0 | 1.073 |
| 7765.0 | 1.073 |
| 7766.0 | 1.073 |
| 7767.0 | 1.073 |
| 7768.0 | 1.073 |
| 7769.0 | 1.073 |
| 7770.0 | 1.073 |
| 7771.0 | 1.073 |
| 7772.0 | 1.073 |
| 7773.0 | 1.073 |
| 7774.0 | 1.073 |
| 7775.0 | 1.073 |
| 7776.0 | 1.073 |
| 7777.0 | 1.073 |
| 7778.0 | 1.073 |
| 7779.0 | 1.073 |
| 7780.0 | 1.073 |
| 7781.0 | 1.073 |
| 7782.0 | 1.073 |
| 7783.0 | 1.073 |
| 7784.0 | 1.073 |
| 7785.0 | 1.073 |
| 7786.0 | 1.073 |
| 7787.0 | 1.073 |
| 7788.0 | 1.073 |
| 7789.0 | 1.073 |
| 7790.0 | 1.073 |
| 7791.0 | 1.073 |
| 7792.0 | 1.073 |
| 7793.0 | 1.073 |
| 7794.0 | 1.073 |
| 7795.0 | 1.073 |
| 7796.0 | 1.073 |
| 7797.0 | 1.073 |
| 7798.0 | 1.073 |
| 7799.0 | 1.073 |
| 7800.0 | 1.073 |
| 7801.0 | 1.073 |
| 7802.0 | 1.073 |
| 7803.0 | 1.073 |
| 7804.0 | 1.073 |
| 7805.0 | 1.073 |
| 7806.0 | 1.073 |
| 7807.0 | 1.073 |
| 7808.0 | 1.073 |
| 7809.0 | 1.073 |
| 7810.0 | 1.073 |
| 7811.0 | 1.073 |
| 7812.0 | 1.073 |
| 7813.0 | 1.073 |
| 7814.0 | 1.073 |
| 7815.0 | 1.073 |
| 7816.0 | 1.073 |
| 7817.0 | 1.073 |
| 7818.0 | 1.073 |
| 7819.0 | 1.073 |
| 7820.0 | 1.073 |
| 7821.0 | 1.073 |
| 7822.0 | 1.073 |
| 7823.0 | 1.073 |
| 7824.0 | 1.073 |
| 7825.0 | 1.073 |
| 7826.0 | 1.073 |
| 7827.0 | 1.073 |
| 7828.0 | 1.073 |
| 7829.0 | 1.073 |
| 7830.0 | 1.073 |
| 7831.0 | 1.073 |
| 7832.0 | 1.073 |
| 7833.0 | 1.073 |
| 7834.0 | 1.073 |
| 7835.0 | 1.073 |
| 7836.0 | 1.073 |
| 7837.0 | 1.073 |
| 7838.0 | 1.073 |
| 7839.0 | 1.073 |
| 7840.0 | 1.073 |
| 7841.0 | 1.073 |
| 7842.0 | 1.073 |
| 7843.0 | 1.073 |
| 7844.0 | 1.073 |
| 7845.0 | 1.073 |
| 7846.0 | 1.073 |
| 7847.0 | 1.073 |
| 7848.0 | 1.073 |
| 7849.0 | 1.073 |
| 7850.0 | 1.073 |
| 7851.0 | 1.073 |
| 7852.0 | 1.073 |
| 7853.0 | 1.073 |
| 7854.0 | 1.073 |
| 7855.0 | 1.073 |
| 7856.0 | 1.073 |
| 7857.0 | 1.073 |
| 7858.0 | 1.073 |
| 7859.0 | 1.073 |
| 7860.0 | 1.073 |
| 7861.0 | 1.073 |
| 7862.0 | 1.073 |
| 7863.0 | 1.073 |
| 7864.0 | 1.073 |
| 7865.0 | 1.073 |
| 7866.0 | 1.073 |
| 7867.0 | 1.073 |
| 7868.0 | 1.073 |
| 7869.0 | 1.073 |
| 7870.0 | 1.073 |
| 7871.0 | 1.073 |
| 7872.0 | 1.073 |
| 7873.0 | 1.073 |
| 7874.0 | 1.073 |
| 7875.0 | 1.073 |
| 7876.0 | 1.073 |
| 7877.0 | 1.073 |
| 7878.0 | 1.073 |
| 7879.0 | 1.073 |
| 7880.0 | 1.073 |
| 7881.0 | 1.073 |
| 7882.0 | 1.073 |
| 7883.0 | 1.073 |
| 7884.0 | 1.073 |
| 7885.0 | 1.073 |
| 7886.0 | 1.073 |
| 7887.0 | 1.073 |
| 7888.0 | 1.073 |
| 7889.0 | 1.073 |
| 7890.0 | 1.073 |
| 7891.0 | 1.073 |
| 7892.0 | 1.073 |
| 7893.0 | 1.073 |
| 7894.0 | 1.073 |
| 7895.0 | 1.073 |
| 7896.0 | 1.073 |
| 7897.0 | 1.073 |
| 7898.0 | 1.073 |
| 7899.0 | 1.073 |
| 7900.0 | 1.073 |
| 7901.0 | 1.073 |
| 7902.0 | 1.073 |
| 7903.0 | 1.073 |
| 7904.0 | 1.073 |
| 7905.0 | 1.073 |
| 7906.0 | 1.073 |
| 7907.0 | 1.073 |
| 7908.0 | 1.073 |
| 7909.0 | 1.073 |
| 7910.0 | 1.073 |
| 7911.0 | 1.073 |
| 7912.0 | 1.073 |
| 7913.0 | 1.073 |
| 7914.0 | 1.073 |
| 7915.0 | 1.073 |
| 7916.0 | 1.073 |
| 7917.0 | 1.073 |
| 7918.0 | 1.073 |
| 7919.0 | 1.073 |
| 7920.0 | 1.073 |
| 7921.0 | 1.073 |
| 7922.0 | 1.073 |
| 7923.0 | 1.073 |
| 7924.0 | 1.073 |
| 7925.0 | 1.073 |
| 7926.0 | 1.073 |
| 7927.0 | 1.073 |
| 7928.0 | 1.073 |
| 7929.0 | 1.073 |
| 7930.0 | 1.073 |
| 7931.0 | 1.073 |
| 7932.0 | 1.073 |
| 7933.0 | 1.073 |
| 7934.0 | 1.073 |
| 7935.0 | 1.073 |
| 7936.0 | 1.073 |
| 7937.0 | 1.073 |
| 7938.0 | 1.073 |
| 7939.0 | 1.073 |
| 7940.0 | 1.073 |
| 7941.0 | 1.073 |
| 7942.0 | 1.073 |
| 7943.0 | 1.073 |
| 7944.0 | 1.073 |
| 7945.0 | 1.073 |
| 7946.0 | 1.073 |
| 7947.0 | 1.073 |
| 7948.0 | 1.073 |
| 7949.0 | 1.073 |
| 7950.0 | 1.073 |
| 7951.0 | 1.073 |
| 7952.0 | 1.073 |
| 7953.0 | 1.073 |
| 7954.0 | 1.073 |
| 7955.0 | 1.073 |
| 7956.0 | 1.073 |
| 7957.0 | 1.073 |
| 7958.0 | 1.073 |
| 7959.0 | 1.073 |
| 7960.0 | 1.073 |
| 7961.0 | 1.073 |
| 7962.0 | 1.073 |
| 7963.0 | 1.073 |
| 7964.0 | 1.073 |
| 7965.0 | 1.073 |
| 7966.0 | 1.073 |
| 7967.0 | 1.073 |
| 7968.0 | 1.073 |
| 7969.0 | 1.073 |
| 7970.0 | 1.073 |
| 7971.0 | 1.073 |
| 7972.0 | 1.073 |
| 7973.0 | 1.073 |
| 7974.0 | 1.073 |
| 7975.0 | 1.073 |
| 7976.0 | 1.073 |
| 7977.0 | 1.073 |
| 7978.0 | 1.073 |
| 7979.0 | 1.073 |
| 7980.0 | 1.073 |
| 7981.0 | 1.073 |
| 7982.0 | 1.073 |
| 7983.0 | 1.073 |
| 7984.0 | 1.073 |
| 7985.0 | 1.073 |
| 7986.0 | 1.073 |
| 7987.0 | 1.073 |
| 7988.0 | 1.073 |
| 7989.0 | 1.073 |
| 7990.0 | 1.073 |
| 7991.0 | 1.073 |
| 7992.0 | 1.073 |
| 7993.0 | 1.073 |
| 7994.0 | 1.073 |
| 7995.0 | 1.073 |
| 7996.0 | 1.073 |
| 7997.0 | 1.073 |
| 7998.0 | 1.073 |
| 7999.0 | 1.073 |
| 8000.0 | 1.073 |
| 8001.0 | 1.073 |
| 8002.0 | 1.073 |
| 8003.0 | 1.073 |
| 8004.0 | 1.073 |
| 8005.0 | 1.073 |
| 8006.0 | 1.073 |
| 8007.0 | 1.073 |
| 8008.0 | 1.073 |
| 8009.0 | 1.073 |
| 8010.0 | 1.073 |
| 8011.0 | 1.073 |
| 8012.0 | 1.073 |
| 8013.0 | 1.073 |
| 8014.0 | 1.073 |
| 8015.0 | 1.073 |
| 8016.0 | 1.073 |
| 8017.0 | 1.073 |
| 8018.0 | 1.073 |
| 8019.0 | 1.073 |
| 8020.0 | 1.073 |
| 8021.0 | 1.073 |
| 8022.0 | 1.073 |
| 8023.0 | 1.073 |
| 8024.0 | 1.073 |
| 8025.0 | 1.073 |
| 8026.0 | 1.073 |
| 8027.0 | 1.073 |
| 8028.0 | 1.073 |
| 8029.0 | 1.073 |
| 8030.0 | 1.073 |
| 8031.0 | 1.073 |
| 8032.0 | 1.073 |
| 8033.0 | 1.073 |
| 8034.0 | 1.073 |
| 8035.0 | 1.073 |
| 8036.0 | 1.073 |
| 8037.0 | 1.073 |
| 8038.0 | 1.073 |
| 8039.0 | 1.073 |
| 8040.0 | 1.073 |
| 8041.0 | 1.073 |
| 8042.0 | 1.073 |
| 8043.0 | 1.073 |
| 8044.0 | 1.073 |
| 8045.0 | 1.073 |
| 8046.0 | 1.073 |
| 8047.0 | 1.073 |
| 8048.0 | 1.073 |
| 8049.0 | 1.073 |
| 8050.0 | 1.073 |
| 8051.0 | 1.073 |
| 8052.0 | 1.073 |
| 8053.0 | 1.073 |
| 8054.0 | 1.073 |
| 8055.0 | 1.073 |
| 8056.0 | 1.073 |
| 8057.0 | 1.073 |
| 8058.0 | 1.073 |
| 8059.0 | 1.073 |
| 8060.0 | 1.073 |
| 8061.0 | 1.073 |
| 8062.0 | 1.073 |
| 8063.0 | 1.073 |
| 8064.0 | 1.073 |
| 8065.0 | 1.073 |
| 8066.0 | 1.073 |
| 8067.0 | 1.073 |
| 8068.0 | 1.073 |
| 8069.0 | 1.073 |
| 8070.0 | 1.073 |
| 8071.0 | 1.073 |
| 8072.0 | 1.073 |
| 8073.0 | 1.073 |
| 8074.0 | 1.073 |
| 8075.0 | 1.073 |
| 8076.0 | 1.073 |
| 8077.0 | 1.073 |
| 8078.0 | 1.073 |
| 8079.0 | 1.073 |
| 8080.0 | 1.073 |
| 8081.0 | 1.073 |
| 8082.0 | 1.073 |
| 8083.0 | 1.073 |
| 8084.0 | 1.073 |
| 8085.0 | 1.073 |
| 8086.0 | 1.073 |
| 8087.0 | 1.073 |
| 8088.0 | 1.073 |
| 8089.0 | 1.073 |
| 8090.0 | 1.073 |
| 8091.0 | 1.073 |
| 8092.0 | 1.073 |
| 8093.0 | 1.073 |
| 8094.0 | 1.073 |
| 8095.0 | 1.073 |
| 8096.0 | 1.073 |
| 8097.0 | 1.073 |
| 8098.0 | 1.073 |
| 8099.0 | 1.073 |
| 8100.0 | 1.073 |
| 8101.0 | 1.073 |
| 8102.0 | 1.073 |
| 8103.0 | 1.073 |
| 8104.0 | 1.073 |
| 8105.0 | 1.073 |
| 8106.0 | 1.073 |
| 8107.0 | 1.073 |
| 8108.0 | 1.073 |
| 8109.0 | 1.073 |
| 8110.0 | 1.073 |
| 8111.0 | 1.073 |
| 8112.0 | 1.073 |
| 8113.0 | 1.073 |
| 8114.0 | 1.073 |
| 8115.0 | 1.073 |
| 8116.0 | 1.073 |
| 8117.0 | 1.073 |
| 8118.0 | 1.073 |
| 8119.0 | 1.073 |
| 8120.0 | 1.073 |
| 8121.0 | 1.073 |
| 8122.0 | 1.073 |
| 8123.0 | 1.073 |
| 8124.0 | 1.073 |
| 8125.0 | 1.073 |
| 8126.0 | 1.073 |
| 8127.0 | 1.073 |
| 8128.0 | 1.073 |
| 8129.0 | 1.073 |
| 8130.0 | 1.073 |
| 8131.0 | 1.073 |
| 8132.0 | 1.073 |
| 8133.0 | 1.073 |
| 8134.0 | 1.073 |
| 8135.0 | 1.073 |
| 8136.0 | 1.073 |
| 8137.0 | 1.073 |
| 8138.0 | 1.073 |
| 8139.0 | 1.073 |
| 8140.0 | 1.073 |
| 8141.0 | 1.073 |
| 8142.0 | 1.073 |
| 8143.0 | 1.073 |
| 8144.0 | 1.073 |
| 8145.0 | 1.073 |
| 8146.0 | 1.073 |
| 8147.0 | 1.073 |
| 8148.0 | 1.073 |
| 8149.0 | 1.073 |
| 8150.0 | 1.073 |
| 8151.0 | 1.073 |
| 8152.0 | 1.073 |
| 8153.0 | 1.073 |
| 8154.0 | 1.073 |
| 8155.0 | 1.073 |
| 8156.0 | 1.073 |
| 8157.0 | 1.073 |
| 8158.0 | 1.073 |
| 8159.0 | 1.073 |
| 8160.0 | 1.073 |
| 8161.0 | 1.073 |
| 8162.0 | 1.073 |
| 8163.0 | 1.073 |
| 8164.0 | 1.073 |
| 8165.0 | 1.073 |
| 8166.0 | 1.073 |
| 8167.0 | 1.073 |
| 8168.0 | 1.073 |
| 8169.0 | 1.073 |
| 8170.0 | 1.073 |
| 8171.0 | 1.073 |
| 8172.0 | 1.073 |
| 8173.0 | 1.073 |
| 8174.0 | 1.073 |
| 8175.0 | 1.073 |
| 8176.0 | 1.073 |
| 8177.0 | 1.073 |
| 8178.0 | 1.073 |
| 8179.0 | 1.073 |
| 8180.0 | 1.073 |
| 8181.0 | 1.073 |
| 8182.0 | 1.073 |
| 8183.0 | 1.073 |
| 8184.0 | 1.073 |
| 8185.0 | 1.073 |
| 8186.0 | 1.073 |
| 8187.0 | 1.073 |
| 8188.0 | 1.073 |
| 8189.0 | 1.073 |
| 8190.0 | 1.073 |
| 8191.0 | 1.073 |
| 8192.0 | 1.073 |
| 8193.0 | 1.073 |
| 8194.0 | 1.073 |
| 8195.0 | 1.073 |
| 8196.0 | 1.073 |
| 8197.0 | 1.073 |
| 8198.0 | 1.073 |
| 8199.0 | 1.073 |
| 8200.0 | 1.073 |
| 8201.0 | 1.073 |
| 8202.0 | 1.073 |
| 8203.0 | 1.073 |
| 8204.0 | 1.073 |
| 8205.0 | 1.073 |
| 8206.0 | 1.073 |
| 8207.0 | 1.073 |
| 8208.0 | 1.073 |
| 8209.0 | 1.073 |
| 8210.0 | 1.073 |
| 8211.0 | 1.073 |
| 8212.0 | 1.073 |
| 8213.0 | 1.073 |
| 8214.0 | 1.073 |
| 8215.0 | 1.073 |
| 8216.0 | 1.073 |
| 8217.0 | 1.073 |
| 8218.0 | 1.073 |
| 8219.0 | 1.073 |
| 8220.0 | 1.073 |
| 8221.0 | 1.073 |
| 8222.0 | 1.073 |
| 8223.0 | 1.073 |
| 8224.0 | 1.073 |
| 8225.0 | 1.073 |
| 8226.0 | 1.073 |
| 8227.0 | 1.073 |
| 8228.0 | 1.073 |
| 8229.0 | 1.073 |
| 8230.0 | 1.073 |
| 8231.0 | 1.073 |
| 8232.0 | 1.073 |
| 8233.0 | 1.073 |
| 8234.0 | 1.073 |
| 8235.0 | 1.073 |
| 8236.0 | 1.073 |
| 8237.0 | 1.073 |
| 8238.0 | 1.073 |
| 8239.0 | 1.073 |
| 8240.0 | 1.073 |
| 8241.0 | 1.073 |
| 8242.0 | 1.073 |
| 8243.0 | 1.073 |
| 8244.0 | 1.073 |
| 8245.0 | 1.073 |
| 8246.0 | 1.073 |
| 8247.0 | 1.073 |
| 8248.0 | 1.073 |
| 8249.0 | 1.073 |
| 8250.0 | 1.073 |
| 8251.0 | 1.073 |
| 8252.0 | 1.073 |
| 8253.0 | 1.073 |
| 8254.0 | 1.073 |
| 8255.0 | 1.073 |
| 8256.0 | 1.073 |
| 8257.0 | 1.073 |
| 8258.0 | 1.073 |
| 8259.0 | 1.073 |
| 8260.0 | 1.073 |
| 8261.0 | 1.073 |
| 8262.0 | 1.073 |
| 8263.0 | 1.073 |
| 8264.0 | 1.073 |
| 8265.0 | 1.073 |
| 8266.0 | 1.073 |
| 8267.0 | 1.073 |
| 8268.0 | 1.073 |
| 8269.0 | 1.073 |
| 8270.0 | 1.073 |
| 8271.0 | 1.073 |
| 8272.0 | 1.073 |
| 8273.0 | 1.073 |
| 8274.0 | 1.073 |
| 8275.0 | 1.073 |
| 8276.0 | 1.073 |
| 8277.0 | 1.073 |
| 8278.0 | 1.073 |
| 8279.0 | 1.073 |
| 8280.0 | 1.073 |
| 8281.0 | 1.073 |
| 8282.0 | 1.073 |
| 8283.0 | 1.073 |
| 8284.0 | 1.073 |
| 8285.0 | 1.073 |
| 8286.0 | 1.073 |
| 8287.0 | 1.073 |
| 8288.0 | 1.073 |
| 8289.0 | 1.073 |
| 8290.0 | 1.073 |
| 8291.0 | 1.073 |
| 8292.0 | 1.073 |
| 8293.0 | 1.073 |
| 8294.0 | 1.073 |
| 8295.0 | 1.073 |
| 8296.0 | 1.073 |
| 8297.0 | 1.073 |
| 8298.0 | 1.073 |
| 8299.0 | 1.073 |
| 8300.0 | 1.073 |
| 8301.0 | 1.073 |
| 8302.0 | 1.073 |
| 8303.0 | 1.073 |
| 8304.0 | 1.073 |
| 8305.0 | 1.073 |
| 8306.0 | 1.073 |
| 8307.0 | 1.073 |
| 8308.0 | 1.073 |
| 8309.0 | 1.073 |
| 8310.0 | 1.073 |
| 8311.0 | 1.073 |
| 8312.0 | 1.073 |
| 8313.0 | 1.073 |
| 8314.0 | 1.073 |
| 8315.0 | 1.073 |
| 8316.0 | 1.073 |
| 8317.0 | 1.073 |
| 8318.0 | 1.073 |
| 8319.0 | 1.073 |
| 8320.0 | 1.073 |
| 8321.0 | 1.073 |
| 8322.0 | 1.073 |
| 8323.0 | 1.073 |
| 8324.0 | 1.073 |
| 8325.0 | 1.073 |
| 8326.0 | 1.073 |
| 8327.0 | 1.073 |
| 8328.0 | 1.073 |
| 8329.0 | 1.073 |
| 8330.0 | 1.073 |
| 8331.0 | 1.073 |
| 8332.0 | 1.073 |
| 8333.0 | 1.073 |
| 8334.0 | 1.073 |
| 8335.0 | 1.073 |
| 8336.0 | 1.073 |
| 8337.0 | 1.073 |
| 8338.0 | 1.073 |
| 8339.0 | 1.073 |
| 8340.0 | 1.073 |
| 8341.0 | 1.073 |
| 8342.0 | 1.073 |
| 8343.0 | 1.073 |
| 8344.0 | 1.073 |
| 8345.0 | 1.073 |
| 8346.0 | 1.073 |
| 8347.0 | 1.073 |
| 8348.0 | 1.073 |
| 8349.0 | 1.073 |
| 8350.0 | 1.073 |
| 8351.0 | 1.073 |
| 8352.0 | 1.073 |
| 8353.0 | 1.073 |
| 8354.0 | 1.073 |
| 8355.0 | 1.073 |
| 8356.0 | 1.073 |
| 8357.0 | 1.073 |
| 8358.0 | 1.073 |
| 8359.0 | 1.073 |
| 8360.0 | 1.073 |
| 8361.0 | 1.073 |
| 8362.0 | 1.073 |
| 8363.0 | 1.073 |
| 8364.0 | 1.073 |
| 8365.0 | 1.073 |
| 8366.0 | 1.073 |
| 8367.0 | 1.073 |
| 8368.0 | 1.073 |
| 8369.0 | 1.073 |
| 8370.0 | 1.073 |
| 8371.0 | 1.073 |
| 8372.0 | 1.073 |
| 8373.0 | 1.073 |
| 8374.0 | 1.073 |
| 8375.0 | 1.073 |
| 8376.0 | 1.073 |
| 8377.0 | 1.073 |
| 8378.0 | 1.073 |
| 8379.0 | 1.073 |
| 8380.0 | 1.073 |
| 8381.0 | 1.073 |
| 8382.0 | 1.073 |
| 8383.0 | 1.073 |
| 8384.0 | 1.073 |
| 8385.0 | 1.073 |
| 8386.0 | 1.073 |
| 8387.0 | 1.073 |
| 8388.0 | 1.073 |
| 8389.0 | 1.073 |
| 8390.0 | 1.073 |
| 8391.0 | 1.073 |
| 8392.0 | 1.073 |
| 8393.0 | 1.073 |
| 8394.0 | 1.073 |
| 8395.0 | 1.073 |
| 8396.0 | 1.073 |
| 8397.0 | 1.073 |
| 8398.0 | 1.073 |
| 8399.0 | 1.073 |
| 8400.0 | 1.073 |
| 8401.0 | 1.073 |
| 8402.0 | 1.073 |
| 8403.0 | 1.073 |
| 8404.0 | 1.073 |
| 8405.0 | 1.073 |
| 8406.0 | 1.073 |
| 8407.0 | 1.073 |
| 8408.0 | 1.073 |
| 8409.0 | 1.073 |
| 8410.0 | 1.073 |
| 8411.0 | 1.073 |
| 8412.0 | 1.073 |
| 8413.0 | 1.073 |
| 8414.0 | 1.073 |
| 8415.0 | 1.073 |
| 8416.0 | 1.073 |
| 8417.0 | 1.073 |
| 8418.0 | 1.073 |
| 8419.0 | 1.073 |
| 8420.0 | 1.073 |
| 8421.0 | 1.073 |
| 8422.0 | 1.073 |
| 8423.0 | 1.073 |
| 8424.0 | 1.073 |
| 8425.0 | 1.073 |
| 8426.0 | 1.073 |
| 8427.0 | 1.073 |
| 8428.0 | 1.073 |
| 8429.0 | 1.073 |
| 8430.0 | 1.073 |
| 8431.0 | 1.073 |
| 8432.0 | 1.073 |
| 8433.0 | 1.073 |
| 8434.0 | 1.073 |
| 8435.0 | 1.073 |
| 8436.0 | 1.073 |
| 8437.0 | 1.073 |
| 8438.0 | 1.073 |
| 8439.0 | 1.073 |
| 8440.0 | 1.073 |
| 8441.0 | 1.073 |
| 8442.0 | 1.073 |
| 8443.0 | 1.073 |
| 8444.0 | 1.073 |
| 8445.0 | 1.073 |
| 8446.0 | 1.073 |
| 8447.0 | 1.073 |
| 8448.0 | 1.073 |
| 8449.0 | 1.073 |
| 8450.0 | 1.073 |
| 8451.0 | 1.073 |
| 8452.0 | 1.073 |
| 8453.0 | 1.073 |
| 8454.0 | 1.073 |
| 8455.0 | 1.073 |
| 8456.0 | 1.073 |
| 8457.0 | 1.073 |
| 8458.0 | 1.073 |
| 8459.0 | 1.073 |
| 8460.0 | 1.073 |
| 8461.0 | 1.073 |
| 8462.0 | 1.073 |
| 8463.0 | 1.073 |
| 8464.0 | 1.073 |
| 8465.0 | 1.073 |
| 8466.0 | 1.073 |
| 8467.0 | 1.073 |
| 8468.0 | 1.073 |
| 8469.0 | 1.073 |
| 8470.0 | 1.073 |
| 8471.0 | 1.073 |
| 8472.0 | 1.073 |
| 8473.0 | 1.073 |
| 8474.0 | 1.073 |
| 8475.0 | 1.073 |
| 8476.0 | 1.073 |
| 8477.0 | 1.073 |
| 8478.0 | 1.073 |
| 8479.0 | 1.073 |
| 8480.0 | 1.073 |
| 8481.0 | 1.073 |
| 8482.0 | 1.073 |
| 8483.0 | 1.073 |
| 8484.0 | 1.073 |
| 8485.0 | 1.073 |
| 8486.0 | 1.073 |
| 8487.0 | 1.073 |
| 8488.0 | 1.073 |
| 8489.0 | 1.073 |
| 8490.0 | 1.073 |
| 8491.0 | 1.073 |
| 8492.0 | 1.073 |
| 8493.0 | 1.073 |
| 8494.0 | 1.073 |
| 8495.0 | 1.073 |
| 8496.0 | 1.073 |
| 8497.0 | 1.073 |
| 8498.0 | 1.073 |
| 8499.0 | 1.073 |
| 8500.0 | 1.073 |
| 8501.0 | 1.073 |
| 8502.0 | 1.073 |
| 8503.0 | 1.073 |
| 8504.0 | 1.073 |
| 8505.0 | 1.073 |
| 8506.0 | 1.073 |
| 8507.0 | 1.073 |
| 8508.0 | 1.073 |
| 8509.0 | 1.073 |
| 8510.0 | 1.073 |
| 8511.0 | 1.073 |
| 8512.0 | 1.073 |
| 8513.0 | 1.073 |
| 8514.0 | 1.073 |
| 8515.0 | 1.073 |
| 8516.0 | 1.073 |
| 8517.0 | 1.073 |
| 8518.0 | 1.073 |
| 8519.0 | 1.073 |
| 8520.0 | 1.073 |
| 8521.0 | 1.073 |
| 8522.0 | 1.073 |
| 8523.0 | 1.073 |
| 8524.0 | 1.073 |
| 8525.0 | 1.073 |
| 8526.0 | 1.073 |
| 8527.0 | 1.073 |
| 8528.0 | 1.073 |
| 8529.0 | 1.073 |
| 8530.0 | 1.073 |
| 8531.0 | 1.073 |
| 8532.0 | 1.073 |
| 8533.0 | 1.073 |
| 8534.0 | 1.073 |
| 8535.0 | 1.073 |
| 8536.0 | 1.073 |
| 8537.0 | 1.073 |
| 8538.0 | 1.073 |
| 8539.0 | 1.073 |
| 8540.0 | 1.073 |
| 8541.0 | 1.073 |
| 8542.0 | 1.073 |
| 8543.0 | 1.073 |
| 8544.0 | 1.073 |
| 8545.0 | 1.073 |
| 8546.0 | 1.073 |
| 8547.0 | 1.073 |
| 8548.0 | 1.073 |
| 8549.0 | 1.073 |
| 8550.0 | 1.073 |
| 8551.0 | 1.073 |
| 8552.0 | 1.073 |
| 8553.0 | 1.073 |
| 8554.0 | 1.073 |
| 8555.0 | 1.073 |
| 8556.0 | 1.073 |
| 8557.0 | 1.073 |
| 8558.0 | 1.073 |
| 8559.0 | 1.073 |
| 8560.0 | 1.073 |
| 8561.0 | 1.073 |
| 8562.0 | 1.073 |
| 8563.0 | 1.073 |
| 8564.0 | 1.073 |
| 8565.0 | 1.073 |
| 8566.0 | 1.073 |
| 8567.0 | 1.073 |
| 8568.0 | 1.073 |
| 8569.0 | 1.073 |
| 8570.0 | 1.073 |
| 8571.0 | 1.073 |
| 8572.0 | 1.073 |
| 8573.0 | 1.073 |
| 8574.0 | 1.073 |
| 8575.0 | 1.073 |
| 8576.0 | 1.073 |
| 8577.0 | 1.073 |
| 8578.0 | 1.073 |
| 8579.0 | 1.073 |
| 8580.0 | 1.073 |
| 8581.0 | 1.073 |
| 8582.0 | 1.073 |
| 8583.0 | 1.073 |
| 8584.0 | 1.073 |
| 8585.0 | 1.073 |
| 8586.0 | 1.073 |
| 8587.0 | 1.073 |
| 8588.0 | 1.073 |
| 8589.0 | 1.073 |
| 8590.0 | 1.073 |
| 8591.0 | 1.073 |
| 8592.0 | 1.073 |
| 8593.0 | 1.073 |
| 8594.0 | 1.073 |
| 8595.0 | 1.073 |
| 8596.0 | 1.073 |
| 8597.0 | 1.073 |
| 8598.0 | 1.073 |
| 8599.0 | 1.073 |
| 8600.0 | 1.073 |
| 8601.0 | 1.073 |
| 8602.0 | 1.073 |
| 8603.0 | 1.073 |
| 8604.0 | 1.073 |
| 8605.0 | 1.073 |
| 8606.0 | 1.073 |
| 8607.0 | 1.073 |
| 8608.0 | 1.073 |
| 8609.0 | 1.073 |
| 8610.0 | 1.073 |
| 8611.0 | 1.073 |
| 8612.0 | 1.073 |
| 8613.0 | 1.073 |
| 8614.0 | 1.073 |
| 8615.0 | 1.073 |
| 8616.0 | 1.073 |
| 8617.0 | 1.073 |
| 8618.0 | 1.073 |
| 8619.0 | 1.073 |
| 8620.0 | 1.073 |
| 8621.0 | 1.073 |
| 8622.0 | 1.073 |
| 8623.0 | 1.073 |
| 8624.0 | 1.073 |
| 8625.0 | 1.073 |
| 8626.0 | 1.073 |
| 8627.0 | 1.073 |
| 8628.0 | 1.073 |
| 8629.0 | 1.073 |
| 8630.0 | 1.073 |
| 8631.0 | 1.073 |
| 8632.0 | 1.073 |
| 8633.0 | 1.073 |
| 8634.0 | 1.073 |
| 8635.0 | 1.073 |
| 8636.0 | 1.073 |
| 8637.0 | 1.073 |
| 8638.0 | 1.073 |
| 8639.0 | 1.073 |
| 8640.0 | 1.073 |
| 8641.0 | 1.073 |
| 8642.0 | 1.073 |
| 8643.0 | 1.073 |
| 8644.0 | 1.073 |
| 8645.0 | 1.073 |
| 8646.0 | 1.073 |
| 8647.0 | 1.073 |
| 8648.0 | 1.073 |
| 8649.0 | 1.073 |
| 8650.0 | 1.073 |
| 8651.0 | 1.073 |
| 8652.0 | 1.073 |
| 8653.0 | 1.073 |
| 8654.0 | 1.073 |
| 8655.0 | 1.073 |
| 8656.0 | 1.073 |
| 8657.0 | 1.073 |
| 8658.0 | 1.073 |
| 8659.0 | 1.073 |
| 8660.0 | 1.073 |
| 8661.0 | 1.073 |
| 8662.0 | 1.073 |
| 8663.0 | 1.073 |
| 8664.0 | 1.073 |
| 8665.0 | 1.073 |
| 8666.0 | 1.073 |
| 8667.0 | 1.073 |
| 8668.0 | 1.073 |
| 8669.0 | 1.073 |
| 8670.0 | 1.073 |
| 8671.0 | 1.073 |
| 8672.0 | 1.073 |
| 8673.0 | 1.073 |
| 8674.0 | 1.073 |
| 8675.0 | 1.073 |
| 8676.0 | 1.073 |
| 8677.0 | 1.073 |
| 8678.0 | 1.073 |
| 8679.0 | 1.073 |
| 8680.0 | 1.073 |
| 8681.0 | 1.073 |
| 8682.0 | 1.073 |
| 8683.0 | 1.073 |
| 8684.0 | 1.073 |
| 8685.0 | 1.073 |
| 8686.0 | 1.073 |
| 8687.0 | 1.073 |
| 8688.0 | 1.073 |
| 8689.0 | 1.073 |
| 8690.0 | 1.073 |
| 8691.0 | 1.073 |
| 8692.0 | 1.073 |
| 8693.0 | 1.073 |
| 8694.0 | 1.073 |
| 8695.0 | 1.073 |
| 8696.0 | 1.073 |
| 8697.0 | 1.073 |
| 8698.0 | 1.073 |
| 8699.0 | 1.073 |
| 8700.0 | 1.073 |
| 8701.0 | 1.073 |
| 8702.0 | 1.073 |
| 8703.0 | 1.073 |
| 8704.0 | 1.073 |
| 8705.0 | 1.073 |
| 8706.0 | 1.073 |
| 8707.0 | 1.073 |
| 8708.0 | 1.073 |
| 8709.0 | 1.073 |
| 8710.0 | 1.073 |
| 8711.0 | 1.073 |
| 8712.0 | 1.073 |
| 8713.0 | 1.073 |
| 8714.0 | 1.073 |
| 8715.0 | 1.073 |
| 8716.0 | 1.073 |
| 8717.0 | 1.073 |
| 8718.0 | 1.073 |
| 8719.0 | 1.073 |
| 8720.0 | 1.073 |
| 8721.0 | 1.073 |
| 8722.0 | 1.073 |
| 8723.0 | 1.073 |
| 8724.0 | 1.073 |
| 8725.0 | 1.073 |
| 8726.0 | 1.073 |
| 8727.0 | 1.073 |
| 8728.0 | 1.073 |
| 8729.0 | 1.073 |
| 8730.0 | 1.073 |
| 8731.0 | 1.073 |
| 8732.0 | 1.073 |
| 8733.0 | 1.073 |
| 8734.0 | 1.073 |
| 8735.0 | 1.073 |
| 8736.0 | 1.073 |
| 8737.0 | 1.073 |
| 8738.0 | 1.073 |
| 8739.0 | 1.073 |
| 8740.0 | 1.073 |
| 8741.0 | 1.073 |
| 8742.0 | 1.073 |
| 8743.0 | 1.073 |
| 8744.0 | 1.073 |
| 8745.0 | 1.073 |
| 8746.0 | 1.073 |
| 8747.0 | 1.073 |
| 8748.0 | 1.073 |
| 8749.0 | 1.073 |
| 8750.0 | 1.073 |
| 8751.0 | 1.073 |
| 8752.0 | 1.073 |
| 8753.0 | 1.073 |
| 8754.0 | 1.073 |
| 8755.0 | 1.073 |
| 8756.0 | 1.073 |
| 8757.0 | 1.073 |
| 8758.0 | 1.073 |
| 8759.0 | 1.073 |
| 8760.0 | 1.073 |
| 8761.0 | 1.073 |
| 8762.0 | 1.073 |
| 8763.0 | 1.073 |
| 8764.0 | 1.073 |
| 8765.0 | 1.073 |
| 8766.0 | 1.073 |
| 8767.0 | 1.073 |
| 8768.0 | 1.073 |
| 8769.0 | 1.073 |
| 8770.0 | 1.073 |
| 8771.0 | 1.073 |
| 8772.0 | 1.073 |
| 8773.0 | 1.073 |
| 8774.0 | 1.073 |
| 8775.0 | 1.073 |
| 8776.0 | 1.073 |
| 8777.0 | 1.073 |
| 8778.0 | 1.073 |
| 8779.0 | 1.073 |
| 8780.0 | 1.073 |
| 8781.0 | 1.073 |
| 8782.0 | 1.073 |
| 8783.0 | 1.073 |
| 8784.0 | 1.073 |
| 8785.0 | 1.073 |
| 8786.0 | 1.073 |
| 8787.0 | 1.073 |
| 8788.0 | 1.073 |
| 8789.0 | 1.073 |
| 8790.0 | 1.073 |
| 8791.0 | 1.073 |
| 8792.0 | 1.073 |
| 8793.0 | 1.073 |
| 8794.0 | 1.073 |
| 8795.0 | 1.073 |
| 8796.0 | 1.073 |
| 8797.0 | 1.073 |
| 8798.0 | 1.073 |
| 8799.0 | 1.073 |
| 8800.0 | 1.073 |
| 8801.0 | 1.073 |
| 8802.0 | 1.073 |
| 8803.0 | 1.073 |
| 8804.0 | 1.073 |
| 8805.0 | 1.073 |
| 8806.0 | 1.073 |
| 8807.0 | 1.073 |
| 8808.0 | 1.073 |
| 8809.0 | 1.073 |
| 8810.0 | 1.073 |
| 8811.0 | 1.073 |
| 8812.0 | 1.073 |
| 8813.0 | 1.073 |
| 8814.0 | 1.073 |
| 8815.0 | 1.073 |
| 8816.0 | 1.073 |
| 8817.0 | 1.073 |
| 8818.0 | 1.073 |
| 8819.0 | 1.073 |
| 8820.0 | 1.073 |
| 8821.0 | 1.073 |
| 8822.0 | 1.073 |
| 8823.0 | 1.073 |
| 8824.0 | 1.073 |
| 8825.0 | 1.073 |
| 8826.0 | 1.073 |
| 8827.0 | 1.073 |
| 8828.0 | 1.073 |
| 8829.0 | 1.073 |
| 8830.0 | 1.073 |
| 8831.0 | 1.073 |
| 8832.0 | 1.073 |
| 8833.0 | 1.073 |
| 8834.0 | 1.073 |
| 8835.0 | 1.073 |
| 8836.0 | 1.073 |
| 8837.0 | 1.073 |
| 8838.0 | 1.073 |
| 8839.0 | 1.073 |
| 8840.0 | 1.073 |
| 8841.0 | 1.073 |
| 8842.0 | 1.073 |
| 8843.0 | 1.073 |
| 8844.0 | 1.073 |
| 8845.0 | 1.073 |
| 8846.0 | 1.073 |
| 8847.0 | 1.073 |
| 8848.0 | 1.073 |
| 8849.0 | 1.073 |
| 8850.0 | 1.073 |
| 8851.0 | 1.073 |
| 8852.0 | 1.073 |
| 8853.0 | 1.073 |
| 8854.0 | 1.073 |
| 8855.0 | 1.073 |
| 8856.0 | 1.073 |
| 8857.0 | 1.073 |
| 8858.0 | 1.073 |
| 8859.0 | 1.073 |
| 8860.0 | 1.073 |
| 8861.0 | 1.073 |
| 8862.0 | 1.073 |
| 8863.0 | 1.073 |
| 8864.0 | 1.073 |
| 8865.0 | 1.073 |
| 8866.0 | 1.073 |
| 8867.0 | 1.073 |
| 8868.0 | 1.073 |
| 8869.0 | 1.073 |
| 8870.0 | 1.073 |
| 8871.0 | 1.073 |
| 8872.0 | 1.073 |
| 8873.0 | 1.073 |
| 8874.0 | 1.073 |
| 8875.0 | 1.073 |
| 8876.0 | 1.073 |
| 8877.0 | 1.073 |
| 8878.0 | 1.073 |
| 8879.0 | 1.073 |
| 8880.0 | 1.073 |
| 8881.0 | 1.073 |
| 8882.0 | 1.073 |
| 8883.0 | 1.073 |
| 8884.0 | 1.073 |
| 8885.0 | 1.073 |
| 8886.0 | 1.073 |
| 8887.0 | 1.073 |
| 8888.0 | 1.073 |
| 8889.0 | 1.073 |
| 8890.0 | 1.073 |
| 8891.0 | 1.073 |
| 8892.0 | 1.073 |
| 8893.0 | 1.073 |
| 8894.0 | 1.073 |
| 8895.0 | 1.073 |
| 8896.0 | 1.073 |
| 8897.0 | 1.073 |
| 8898.0 | 1.073 |
| 8899.0 | 1.073 |
| 8900.0 | 1.073 |
| 8901.0 | 1.073 |
| 8902.0 | 1.073 |
| 8903.0 | 1.073 |
| 8904.0 | 1.073 |
| 8905.0 | 1.073 |
| 8906.0 | 1.073 |
| 8907.0 | 1.073 |
| 8908.0 | 1.073 |
| 8909.0 | 1.073 |
| 8910.0 | 1.073 |
| 8911.0 | 1.073 |
| 8912.0 | 1.073 |
| 8913.0 | 1.073 |
| 8914.0 | 1.073 |
| 8915.0 | 1.073 |
| 8916.0 | 1.073 |
| 8917.0 | 1.073 |
| 8918.0 | 1.073 |
| 8919.0 | 1.073 |
| 8920.0 | 1.073 |
| 8921.0 | 1.073 |
| 8922.0 | 1.073 |
| 8923.0 | 1.073 |
| 8924.0 | 1.073 |
| 8925.0 | 1.073 |
| 8926.0 | 1.073 |
| 8927.0 | 1.073 |
| 8928.0 | 1.073 |
| 8929.0 | 1.073 |
| 8930.0 | 1.073 |
| 8931.0 | 1.073 |
| 8932.0 | 1.073 |
| 8933.0 | 1.073 |
| 8934.0 | 1.073 |
| 8935.0 | 1.073 |
| 8936.0 | 1.073 |
| 8937.0 | 1.073 |
| 8938.0 | 1.073 |
| 8939.0 | 1.073 |
| 8940.0 | 1.073 |
| 8941.0 | 1.073 |
| 8942.0 | 1.073 |
| 8943.0 | 1.073 |
| 8944.0 | 1.073 |
| 8945.0 | 1.073 |
| 8946.0 | 1.073 |
| 8947.0 | 1.073 |
| 8948.0 | 1.073 |
| 8949.0 | 1.073 |
| 8950.0 | 1.073 |
| 8951.0 | 1.073 |
| 8952.0 | 1.073 |
| 8953.0 | 1.073 |
| 8954.0 | 1.073 |
| 8955.0 | 1.073 |
| 8956.0 | 1.073 |
| 8957.0 | 1.073 |
| 8958.0 | 1.073 |
| 8959.0 | 1.073 |
| 8960.0 | 1.073 |
| 8961.0 | 1.073 |
| 8962.0 | 1.073 |
| 8963.0 | 1.073 |
| 8964.0 | 1.073 |
| 8965.0 | 1.073 |
| 8966.0 | 1.073 |
| 8967.0 | 1.073 |
| 8968.0 | 1.073 |
| 8969.0 | 1.073 |
| 8970.0 | 1.073 |
| 8971.0 | 1.073 |
| 8972.0 | 1.073 |
| 8973.0 | 1.073 |
| 8974.0 | 1.073 |
| 8975.0 | 1.073 |
| 8976.0 | 1.073 |
| 8977.0 | 1.073 |
| 8978.0 | 1.073 |
| 8979.0 | 1.073 |
| 8980.0 | 1.073 |
| 8981.0 | 1.073 |
| 8982.0 | 1.073 |
| 8983.0 | 1.073 |
| 8984.0 | 1.073 |
| 8985.0 | 1.073 |
| 8986.0 | 1.073 |
| 8987.0 | 1.073 |
| 8988.0 | 1.073 |
| 8989.0 | 1.073 |
| 8990.0 | 1.073 |
| 8991.0 | 1.073 |
| 8992.0 | 1.073 |
| 8993.0 | 1.073 |
| 8994.0 | 1.073 |
| 8995.0 | 1.073 |
| 8996.0 | 1.073 |
| 8997.0 | 1.073 |
| 8998.0 | 1.073 |
| 8999.0 | 1.073 |
| 9000.0 | 1.073 |
| 9001.0 | 1.073 |
| 9002.0 | 1.073 |
| 9003.0 | 1.073 |
| 9004.0 | 1.073 |
| 9005.0 | 1.073 |
| 9006.0 | 1.073 |
| 9007.0 | 1.073 |
| 9008.0 | 1.073 |
| 9009.0 | 1.073 |
| 9010.0 | 1.073 |
| 9011.0 | 1.073 |
| 9012.0 | 1.073 |
| 9013.0 | 1.073 |
| 9014.0 | 1.073 |
| 9015.0 | 1.073 |
| 9016.0 | 1.073 |
| 9017.0 | 1.073 |
| 9018.0 | 1.073 |
| 9019.0 | 1.073 |
| 9020.0 | 1.073 |
| 9021.0 | 1.073 |
| 9022.0 | 1.073 |
| 9023.0 | 1.073 |
| 9024.0 | 1.073 |
| 9025.0 | 1.073 |
| 9026.0 | 1.073 |
| 9027.0 | 1.073 |
| 9028.0 | 1.073 |
| 9029.0 | 1.073 |
| 9030.0 | 1.073 |
| 9031.0 | 1.073 |
| 9032.0 | 1.073 |
| 9033.0 | 1.073 |
| 9034.0 | 1.073 |
| 9035.0 | 1.073 |
| 9036.0 | 1.073 |
| 9037.0 | 1.073 |
| 9038.0 | 1.073 |
| 9039.0 | 1.073 |
| 9040.0 | 1.073 |
| 9041.0 | 1.073 |
| 9042.0 | 1.073 |
| 9043.0 | 1.073 |
| 9044.0 | 1.073 |
| 9045.0 | 1.073 |
| 9046.0 | 1.073 |
| 9047.0 | 1.073 |
| 9048.0 | 1.073 |
| 9049.0 | 1.073 |
| 9050.0 | 1.073 |
| 9051.0 | 1.073 |
| 9052.0 | 1.073 |
| 9053.0 | 1.073 |
| 9054.0 | 1.073 |
| 9055.0 | 1.073 |
| 9056.0 | 1.073 |
| 9057.0 | 1.073 |
| 9058.0 | 1.073 |
| 9059.0 | 1.073 |
| 9060.0 | 1.073 |
| 9061.0 | 1.073 |
| 9062.0 | 1.073 |
| 9063.0 | 1.073 |
| 9064.0 | 1.073 |
| 9065.0 | 1.073 |
| 9066.0 | 1.073 |
| 9067.0 | 1.073 |
| 9068.0 | 1.073 |
| 9069.0 | 1.073 |
| 9070.0 | 1.073 |
| 9071.0 | 1.073 |
| 9072.0 | 1.073 |
| 9073.0 | 1.073 |
| 9074.0 | 1.073 |
| 9075.0 | 1.073 |
| 9076.0 | 1.073 |
| 9077.0 | 1.073 |
| 9078.0 | 1.073 |
| 9079.0 | 1.073 |
| 9080.0 | 1.073 |
| 9081.0 | 1.073 |
| 9082.0 | 1.073 |
| 9083.0 | 1.073 |
| 9084.0 | 1.073 |
| 9085.0 | 1.073 |
| 9086.0 | 1.073 |
| 9087.0 | 1.073 |
| 9088.0 | 1.073 |
| 9089.0 | 1.073 |
| 9090.0 | 1.073 |
| 9091.0 | 1.073 |
| 9092.0 | 1.073 |
| 9093.0 | 1.073 |
| 9094.0 | 1.073 |
| 9095.0 | 1.073 |
| 9096.0 | 1.073 |
| 9097.0 | 1.073 |
| 9098.0 | 1.073 |
| 9099.0 | 1.073 |
| 9100.0 | 1.073 |
| 9101.0 | 1.073 |
| 9102.0 | 1.073 |
| 9103.0 | 1.073 |
| 9104.0 | 1.073 |
| 9105.0 | 1.073 |
| 9106.0 | 1.073 |
| 9107.0 | 1.073 |
| 9108.0 | 1.073 |
| 9109.0 | 1.073 |
| 9110.0 | 1.073 |
| 9111.0 | 1.073 |
| 9112.0 | 1.073 |
| 9113.0 | 1.073 |
| 9114.0 | 1.073 |
| 9115.0 | 1.073 |
| 9116.0 | 1.073 |
| 9117.0 | 1.073 |
| 9118.0 | 1.073 |
| 9119.0 | 1.073 |
| 9120.0 | 1.073 |
| 9121.0 | 1.073 |
| 9122.0 | 1.073 |
| 9123.0 | 1.073 |
| 9124.0 | 1.073 |
| 9125.0 | 1.073 |
| 9126.0 | 1.073 |
| 9127.0 | 1.073 |
| 9128.0 | 1.073 |
| 9129.0 | 1.073 |
| 9130.0 | 1.073 |
| 9131.0 | 1.073 |
| 9132.0 | 1.073 |
| 9133.0 | 1.073 |
| 9134.0 | 1.073 |
| 9135.0 | 1.073 |
| 9136.0 | 1.073 |
| 9137.0 | 1.073 |
| 9138.0 | 1.073 |
| 9139.0 | 1.073 |
| 9140.0 | 1.073 |
| 9141.0 | 1.073 |
| 9142.0 | 1.073 |
| 9143.0 | 1.073 |
| 9144.0 | 1.073 |
| 9145.0 | 1.073 |
| 9146.0 | 1.073 |
| 9147.0 | 1.073 |
| 9148.0 | 1.073 |
| 9149.0 | 1.073 |
| 9150.0 | 1.073 |
| 9151.0 | 1.073 |
| 9152.0 | 1.073 |
| 9153.0 | 1.073 |
| 9154.0 | 1.073 |
| 9155.0 | 1.073 |
| 9156.0 | 1.073 |
| 9157.0 | 1.073 |
| 9158.0 | 1.073 |
| 9159.0 | 1.073 |
| 9160.0 | 1.073 |
| 9161.0 | 1.073 |
| 9162.0 | 1.073 |
| 9163.0 | 1.073 |
| 9164.0 | 1.073 |
| 9165.0 | 1.073 |
| 9166.0 | 1.073 |
| 9167.0 | 1.073 |
| 9168.0 | 1.073 |
| 9169.0 | 1.073 |
| 9170.0 | 1.073 |
| 9171.0 | 1.073 |
| 9172.0 | 1.073 |
| 9173.0 | 1.073 |
| 9174.0 | 1.073 |
| 9175.0 | 1.073 |
| 9176.0 | 1.073 |
| 9177.0 | 1.073 |
| 9178.0 | 1.073 |
| 9179.0 | 1.073 |
| 9180.0 | 1.073 |
| 9181.0 | 1.073 |
| 9182.0 | 1.073 |
| 9183.0 | 1.073 |
| 9184.0 | 1.073 |
| 9185.0 | 1.073 |
| 9186.0 | 1.073 |
| 9187.0 | 1.073 |
| 9188.0 | 1.073 |
| 9189.0 | 1.073 |
| 9190.0 | 1.073 |
| 9191.0 | 1.073 |
| 9192.0 | 1.073 |
| 9193.0 | 1.073 |
| 9194.0 | 1.073 |
| 9195.0 | 1.073 |
| 9196.0 | 1.073 |
| 9197.0 | 1.073 |
| 9198.0 | 1.073 |
| 9199.0 | 1.073 |
| 9200.0 | 1.073 |
| 9201.0 | 1.073 |
| 9202.0 | 1.073 |
| 9203.0 | 1.073 |
| 9204.0 | 1.073 |
| 9205.0 | 1.073 |
| 9206.0 | 1.073 |
| 9207.0 | 1.073 |
| 9208.0 | 1.073 |
| 9209.0 | 1.073 |
| 9210.0 | 1.073 |
| 9211.0 | 1.073 |
| 9212.0 | 1.073 |
| 9213.0 | 1.073 |
| 9214.0 | 1.073 |
| 9215.0 | 1.073 |
| 9216.0 | 1.073 |
| 9217.0 | 1.073 |
| 9218.0 | 1.073 |
| 9219.0 | 1.073 |
| 9220.0 | 1.073 |
| 9221.0 | 1.073 |
| 9222.0 | 1.073 |
| 9223.0 | 1.073 |
| 9224.0 | 1.073 |
| 9225.0 | 1.073 |
| 9226.0 | 1.073 |
| 9227.0 | 1.073 |
| 9228.0 | 1.073 |
| 9229.0 | 1.073 |
| 9230.0 | 1.073 |
| 9231.0 | 1.073 |
| 9232.0 | 1.073 |
| 9233.0 | 1.073 |
| 9234.0 | 1.073 |
| 9235.0 | 1.073 |
| 9236.0 | 1.073 |
| 9237.0 | 1.073 |
| 9238.0 | 1.073 |
| 9239.0 | 1.073 |
| 9240.0 | 1.073 |
| 9241.0 | 1.073 |
| 9242.0 | 1.073 |
| 9243.0 | 1.073 |
| 9244.0 | 1.073 |
| 9245.0 | 1.073 |
| 9246.0 | 1.073 |
| 9247.0 | 1.073 |
| 9248.0 | 1.073 |
| 9249.0 | 1.073 |
| 9250.0 | 1.073 |
| 9251.0 | 1.073 |
| 9252.0 | 1.073 |
| 9253.0 | 1.073 |
| 9254.0 | 1.073 |
| 9255.0 | 1.073 |
| 9256.0 | 1.073 |
| 9257.0 | 1.073 |
| 9258.0 | 1.073 |
| 9259.0 | 1.073 |
| 9260.0 | 1.073 |
| 9261.0 | 1.073 |
| 9262.0 | 1.073 |
| 9263.0 | 1.073 |
| 9264.0 | 1.073 |
| 9265.0 | 1.073 |
| 9266.0 | 1.073 |
| 9267.0 | 1.073 |
| 9268.0 | 1.073 |
| 9269.0 | 1.073 |
| 9270.0 | 1.073 |
| 9271.0 | 1.073 |
| 9272.0 | 1.073 |
| 9273.0 | 1.073 |
| 9274.0 | 1.073 |
| 9275.0 | 1.073 |
| 9276.0 | 1.073 |
| 9277.0 | 1.073 |
| 9278.0 | 1.073 |
| 9279.0 | 1.073 |
| 9280.0 | 1.073 |
| 9281.0 | 1.073 |
| 9282.0 | 1.073 |
| 9283.0 | 1.073 |
| 9284.0 | 1.073 |
| 9285.0 | 1.073 |
| 9286.0 | 1.073 |
| 9287.0 | 1.073 |
| 9288.0 | 1.073 |
| 9289.0 | 1.073 |
| 9290.0 | 1.073 |
| 9291.0 | 1.073 |
| 9292.0 | 1.073 |
| 9293.0 | 1.073 |
| 9294.0 | 1.073 |
| 9295.0 | 1.073 |
| 9296.0 | 1.073 |
| 9297.0 | 1.073 |
| 9298.0 | 1.073 |
| 9299.0 | 1.073 |
| 9300.0 | 1.073 |
| 9301.0 | 1.073 |
| 9302.0 | 1.073 |
| 9303.0 | 1.073 |
| 9304.0 | 1.073 |
| 9305.0 | 1.073 |
| 9306.0 | 1.073 |
| 9307.0 | 1.073 |
| 9308.0 | 1.073 |
| 9309.0 | 1.073 |
| 9310.0 | 1.073 |
| 9311.0 | 1.073 |
| 9312.0 | 1.073 |
| 9313.0 | 1.073 |
| 9314.0 | 1.073 |
| 9315.0 | 1.073 |
| 9316.0 | 1.073 |
| 9317.0 | 1.073 |
| 9318.0 | 1.073 |
| 9319.0 | 1.073 |
| 9320.0 | 1.073 |
| 9321.0 | 1.073 |
| 9322.0 | 1.073 |
| 9323.0 | 1.073 |
| 9324.0 | 1.073 |
| 9325.0 | 1.073 |
| 9326.0 | 1.073 |
| 9327.0 | 1.073 |
| 9328.0 | 1.073 |
| 9329.0 | 1.073 |
| 9330.0 | 1.073 |
| 9331.0 | 1.073 |
| 9332.0 | 1.073 |
| 9333.0 | 1.073 |
| 9334.0 | 1.073 |
| 9335.0 | 1.073 |
| 9336.0 | 1.073 |
| 9337.0 | 1.073 |
| 9338.0 | 1.073 |
| 9339.0 | 1.073 |
| 9340.0 | 1.073 |
| 9341.0 | 1.073 |
| 9342.0 | 1.073 |
| 9343.0 | 1.073 |
| 9344.0 | 1.073 |
| 9345.0 | 1.073 |
| 9346.0 | 1.073 |
| 9347.0 | 1.073 |
| 9348.0 | 1.073 |
| 9349.0 | 1.073 |
| 9350.0 | 1.073 |
| 9351.0 | 1.073 |
| 9352.0 | 1.073 |
| 9353.0 | 1.073 |
| 9354.0 | 1.073 |
| 9355.0 | 1.073 |
| 9356.0 | 1.073 |
| 9357.0 | 1.073 |
| 9358.0 | 1.073 |
| 9359.0 | 1.073 |
| 9360.0 | 1.073 |
| 9361.0 | 1.073 |
| 9362.0 | 1.073 |
| 9363.0 | 1.073 |
| 9364.0 | 1.073 |
| 9365.0 | 1.073 |
| 9366.0 | 1.073 |
| 9367.0 | 1.073 |
| 9368.0 | 1.073 |
| 9369.0 | 1.073 |
| 9370.0 | 1.073 |
| 9371.0 | 1.073 |
| 9372.0 | 1.073 |
| 9373.0 | 1.073 |
| 9374.0 | 1.073 |
| 9375.0 | 1.073 |
| 9376.0 | 1.073 |
| 9377.0 | 1.073 |
| 9378.0 | 1.073 |
| 9379.0 | 1.073 |
| 9380.0 | 1.073 |
| 9381.0 | 1.073 |
| 9382.0 | 1.073 |
| 9383.0 | 1.073 |
| 9384.0 | 1.073 |
| 9385.0 | 1.073 |
| 9386.0 | 1.073 |
| 9387.0 | 1.073 |
| 9388.0 | 1.073 |
| 9389.0 | 1.073 |
| 9390.0 | 1.073 |
| 9391.0 | 1.073 |
| 9392.0 | 1.073 |
| 9393.0 | 1.073 |
| 9394.0 | 1.073 |
| 9395.0 | 1.073 |
| 9396.0 | 1.073 |
| 9397.0 | 1.073 |
| 9398.0 | 1.073 |
| 9399.0 | 1.073 |
| 9400.0 | 1.073 |
| 9401.0 | 1.073 |
| 9402.0 | 1.073 |
| 9403.0 | 1.073 |
| 9404.0 | 1.073 |
| 9405.0 | 1.073 |
| 9406.0 | 1.073 |
| 9407.0 | 1.073 |
| 9408.0 | 1.073 |
| 9409.0 | 1.073 |
| 9410.0 | 1.073 |
| 9411.0 | 1.073 |
| 9412.0 | 1.073 |
| 9413.0 | 1.073 |
| 9414.0 | 1.073 |
| 9415.0 | 1.073 |
| 9416.0 | 1.073 |
| 9417.0 | 1.073 |
| 9418.0 | 1.073 |
| 9419.0 | 1.073 |
| 9420.0 | 1.073 |
| 9421.0 | 1.073 |
| 9422.0 | 1.073 |
| 9423.0 | 1.073 |
| 9424.0 | 1.073 |
| 9425.0 | 1.073 |
| 9426.0 | 1.073 |
| 9427.0 | 1.073 |
| 9428.0 | 1.073 |
| 9429.0 | 1.073 |
| 9430.0 | 1.073 |
| 9431.0 | 1.073 |
| 9432.0 | 1.073 |
| 9433.0 | 1.073 |
| 9434.0 | 1.073 |
| 9435.0 | 1.073 |
| 9436.0 | 1.073 |
| 9437.0 | 1.073 |
| 9438.0 | 1.073 |
| 9439.0 | 1.073 |
| 9440.0 | 1.073 |
| 9441.0 | 1.073 |
| 9442.0 | 1.073 |
| 9443.0 | 1.073 |
| 9444.0 | 1.073 |
| 9445.0 | 1.073 |
| 9446.0 | 1.073 |
| 9447.0 | 1.073 |
| 9448.0 | 1.073 |
| 9449.0 | 1.073 |
| 9450.0 | 1.073 |
| 9451.0 | 1.073 |
| 9452.0 | 1.073 |
| 9453.0 | 1.073 |
| 9454.0 | 1.073 |
| 9455.0 | 1.073 |
| 9456.0 | 1.073 |
| 9457.0 | 1.073 |
| 9458.0 | 1.073 |
| 9459.0 | 1.073 |
| 9460.0 | 1.073 |
| 9461.0 | 1.073 |
| 9462.0 | 1.073 |
| 9463.0 | 1.073 |
| 9464.0 | 1.073 |
| 9465.0 | 1.073 |
| 9466.0 | 1.073 |
| 9467.0 | 1.073 |
| 9468.0 | 1.073 |
| 9469.0 | 1.073 |
| 9470.0 | 1.073 |
| 9471.0 | 1.073 |
| 9472.0 | 1.073 |
| 9473.0 | 1.073 |
| 9474.0 | 1.073 |
| 9475.0 | 1.073 |
| 9476.0 | 1.073 |
| 9477.0 | 1.073 |
| 9478.0 | 1.073 |
| 9479.0 | 1.073 |
| 9480.0 | 1.073 |
| 9481.0 | 1.073 |
| 9482.0 | 1.074 |
| 9483.0 | 1.074 |
| 9484.0 | 1.074 |
| 9485.0 | 1.074 |
| 9486.0 | 1.074 |
| 9487.0 | 1.074 |
| 9488.0 | 1.074 |
| 9489.0 | 1.074 |
| 9490.0 | 1.074 |
| 9491.0 | 1.074 |
| 9492.0 | 1.074 |
| 9493.0 | 1.074 |
| 9494.0 | 1.074 |
| 9495.0 | 1.074 |
| 9496.0 | 1.074 |
| 9497.0 | 1.074 |
| 9498.0 | 1.074 |
| 9499.0 | 1.074 |
| 9500.0 | 1.074 |
| 9501.0 | 1.074 |
| 9502.0 | 1.074 |
| 9503.0 | 1.074 |
| 9504.0 | 1.074 |
| 9505.0 | 1.074 |
| 9506.0 | 1.074 |
| 9507.0 | 1.074 |
| 9508.0 | 1.074 |
| 9509.0 | 1.074 |
| 9510.0 | 1.074 |
| 9511.0 | 1.074 |
| 9512.0 | 1.074 |
| 9513.0 | 1.074 |
| 9514.0 | 1.074 |
| 9515.0 | 1.074 |
| 9516.0 | 1.074 |
| 9517.0 | 1.074 |
| 9518.0 | 1.074 |
| 9519.0 | 1.074 |
| 9520.0 | 1.074 |
| 9521.0 | 1.074 |
| 9522.0 | 1.074 |
| 9523.0 | 1.074 |
| 9524.0 | 1.074 |
| 9525.0 | 1.074 |
| 9526.0 | 1.074 |
| 9527.0 | 1.074 |
| 9528.0 | 1.074 |
| 9529.0 | 1.074 |
| 9530.0 | 1.074 |
| 9531.0 | 1.074 |
| 9532.0 | 1.074 |
| 9533.0 | 1.074 |
| 9534.0 | 1.074 |
| 9535.0 | 1.074 |
| 9536.0 | 1.074 |
| 9537.0 | 1.074 |
| 9538.0 | 1.074 |
| 9539.0 | 1.074 |
| 9540.0 | 1.074 |
| 9541.0 | 1.074 |
| 9542.0 | 1.074 |
| 9543.0 | 1.074 |
| 9544.0 | 1.074 |
| 9545.0 | 1.074 |
| 9546.0 | 1.074 |
| 9547.0 | 1.074 |
| 9548.0 | 1.074 |
| 9549.0 | 1.074 |
| 9550.0 | 1.074 |
| 9551.0 | 1.074 |
| 9552.0 | 1.074 |
| 9553.0 | 1.074 |
| 9554.0 | 1.074 |
| 9555.0 | 1.074 |
| 9556.0 | 1.074 |
| 9557.0 | 1.074 |
| 9558.0 | 1.074 |
| 9559.0 | 1.074 |
| 9560.0 | 1.074 |
| 9561.0 | 1.074 |
| 9562.0 | 1.074 |
| 9563.0 | 1.074 |
| 9564.0 | 1.074 |
| 9565.0 | 1.074 |
| 9566.0 | 1.074 |
| 9567.0 | 1.074 |
| 9568.0 | 1.074 |
| 9569.0 | 1.074 |
| 9570.0 | 1.074 |
| 9571.0 | 1.074 |
| 9572.0 | 1.074 |
| 9573.0 | 1.074 |
| 9574.0 | 1.074 |
| 9575.0 | 1.074 |
| 9576.0 | 1.074 |
| 9577.0 | 1.074 |
| 9578.0 | 1.074 |
| 9579.0 | 1.074 |
| 9580.0 | 1.074 |
| 9581.0 | 1.074 |
| 9582.0 | 1.074 |
| 9583.0 | 1.074 |
| 9584.0 | 1.074 |
| 9585.0 | 1.074 |
| 9586.0 | 1.074 |
| 9587.0 | 1.074 |
| 9588.0 | 1.074 |
| 9589.0 | 1.074 |
| 9590.0 | 1.074 |
| 9591.0 | 1.074 |
| 9592.0 | 1.074 |
| 9593.0 | 1.074 |
| 9594.0 | 1.074 |
| 9595.0 | 1.074 |
| 9596.0 | 1.074 |
| 9597.0 | 1.074 |
| 9598.0 | 1.074 |
| 9599.0 | 1.074 |
| 9600.0 | 1.074 |
| 9601.0 | 1.074 |
| 9602.0 | 1.074 |
| 9603.0 | 1.074 |
| 9604.0 | 1.074 |
| 9605.0 | 1.074 |
| 9606.0 | 1.074 |
| 9607.0 | 1.074 |
| 9608.0 | 1.074 |
| 9609.0 | 1.074 |
| 9610.0 | 1.074 |
| 9611.0 | 1.074 |
| 9612.0 | 1.074 |
| 9613.0 | 1.074 |
| 9614.0 | 1.074 |
| 9615.0 | 1.074 |
| 9616.0 | 1.074 |
| 9617.0 | 1.074 |
| 9618.0 | 1.074 |
| 9619.0 | 1.074 |
| 9620.0 | 1.074 |
| 9621.0 | 1.074 |
| 9622.0 | 1.074 |
| 9623.0 | 1.074 |
| 9624.0 | 1.074 |
| 9625.0 | 1.074 |
| 9626.0 | 1.074 |
| 9627.0 | 1.074 |
| 9628.0 | 1.074 |
| 9629.0 | 1.074 |
| 9630.0 | 1.074 |
| 9631.0 | 1.074 |
| 9632.0 | 1.074 |
| 9633.0 | 1.074 |
| 9634.0 | 1.074 |
| 9635.0 | 1.074 |
| 9636.0 | 1.074 |
| 9637.0 | 1.074 |
| 9638.0 | 1.074 |
| 9639.0 | 1.074 |
| 9640.0 | 1.074 |
| 9641.0 | 1.074 |
| 9642.0 | 1.074 |
| 9643.0 | 1.074 |
| 9644.0 | 1.074 |
| 9645.0 | 1.074 |
| 9646.0 | 1.074 |
| 9647.0 | 1.074 |
| 9648.0 | 1.074 |
| 9649.0 | 1.074 |
| 9650.0 | 1.074 |
| 9651.0 | 1.074 |
| 9652.0 | 1.074 |
| 9653.0 | 1.074 |
| 9654.0 | 1.074 |
| 9655.0 | 1.074 |
| 9656.0 | 1.074 |
| 9657.0 | 1.074 |
| 9658.0 | 1.074 |
| 9659.0 | 1.074 |
| 9660.0 | 1.074 |
| 9661.0 | 1.074 |
| 9662.0 | 1.074 |
| 9663.0 | 1.074 |
| 9664.0 | 1.074 |
| 9665.0 | 1.074 |
| 9666.0 | 1.074 |
| 9667.0 | 1.074 |
| 9668.0 | 1.074 |
| 9669.0 | 1.074 |
| 9670.0 | 1.074 |
| 9671.0 | 1.074 |
| 9672.0 | 1.074 |
| 9673.0 | 1.074 |
| 9674.0 | 1.074 |
| 9675.0 | 1.074 |
| 9676.0 | 1.074 |
| 9677.0 | 1.074 |
| 9678.0 | 1.074 |
| 9679.0 | 1.074 |
| 9680.0 | 1.074 |
| 9681.0 | 1.074 |
| 9682.0 | 1.074 |
| 9683.0 | 1.074 |
| 9684.0 | 1.074 |
| 9685.0 | 1.074 |
| 9686.0 | 1.074 |
| 9687.0 | 1.074 |
| 9688.0 | 1.074 |
| 9689.0 | 1.074 |
| 9690.0 | 1.074 |
| 9691.0 | 1.074 |
| 9692.0 | 1.074 |
| 9693.0 | 1.074 |
| 9694.0 | 1.074 |
| 9695.0 | 1.074 |
| 9696.0 | 1.074 |
| 9697.0 | 1.074 |
| 9698.0 | 1.074 |
| 9699.0 | 1.074 |
| 9700.0 | 1.074 |
| 9701.0 | 1.074 |
| 9702.0 | 1.074 |
| 9703.0 | 1.074 |
| 9704.0 | 1.074 |
| 9705.0 | 1.074 |
| 9706.0 | 1.074 |
| 9707.0 | 1.074 |
| 9708.0 | 1.074 |
| 9709.0 | 1.074 |
| 9710.0 | 1.074 |
| 9711.0 | 1.074 |
| 9712.0 | 1.074 |
| 9713.0 | 1.074 |
| 9714.0 | 1.074 |
| 9715.0 | 1.074 |
| 9716.0 | 1.074 |
| 9717.0 | 1.074 |
| 9718.0 | 1.074 |
| 9719.0 | 1.074 |
| 9720.0 | 1.074 |
| 9721.0 | 1.074 |
| 9722.0 | 1.074 |
| 9723.0 | 1.074 |
| 9724.0 | 1.074 |
| 9725.0 | 1.074 |
| 9726.0 | 1.074 |
| 9727.0 | 1.074 |
| 9728.0 | 1.074 |
| 9729.0 | 1.074 |
| 9730.0 | 1.074 |
| 9731.0 | 1.074 |
| 9732.0 | 1.074 |
| 9733.0 | 1.074 |
| 9734.0 | 1.074 |
| 9735.0 | 1.074 |
| 9736.0 | 1.074 |
| 9737.0 | 1.074 |
| 9738.0 | 1.074 |
| 9739.0 | 1.074 |
| 9740.0 | 1.074 |
| 9741.0 | 1.074 |
| 9742.0 | 1.074 |
| 9743.0 | 1.074 |
| 9744.0 | 1.074 |
| 9745.0 | 1.074 |
| 9746.0 | 1.074 |
| 9747.0 | 1.074 |
| 9748.0 | 1.074 |
| 9749.0 | 1.074 |
| 9750.0 | 1.074 |
| 9751.0 | 1.074 |
| 9752.0 | 1.074 |
| 9753.0 | 1.074 |
| 9754.0 | 1.074 |
| 9755.0 | 1.074 |
| 9756.0 | 1.074 |
| 9757.0 | 1.074 |
| 9758.0 | 1.074 |
| 9759.0 | 1.074 |
| 9760.0 | 1.074 |
| 9761.0 | 1.074 |
| 9762.0 | 1.074 |
| 9763.0 | 1.074 |
| 9764.0 | 1.074 |
| 9765.0 | 1.074 |
| 9766.0 | 1.074 |
| 9767.0 | 1.074 |
| 9768.0 | 1.074 |
| 9769.0 | 1.074 |
| 9770.0 | 1.074 |
| 9771.0 | 1.074 |
| 9772.0 | 1.074 |
| 9773.0 | 1.074 |
| 9774.0 | 1.074 |
| 9775.0 | 1.074 |
| 9776.0 | 1.074 |
| 9777.0 | 1.074 |
| 9778.0 | 1.074 |
| 9779.0 | 1.074 |
| 9780.0 | 1.074 |
| 9781.0 | 1.074 |
| 9782.0 | 1.074 |
| 9783.0 | 1.074 |
| 9784.0 | 1.074 |
| 9785.0 | 1.074 |
| 9786.0 | 1.074 |
| 9787.0 | 1.074 |
| 9788.0 | 1.074 |
| 9789.0 | 1.074 |
| 9790.0 | 1.074 |
| 9791.0 | 1.074 |
| 9792.0 | 1.074 |
| 9793.0 | 1.074 |
| 9794.0 | 1.074 |
| 9795.0 | 1.074 |
| 9796.0 | 1.074 |
| 9797.0 | 1.074 |
| 9798.0 | 1.074 |
| 9799.0 | 1.074 |
| 9800.0 | 1.074 |
| 9801.0 | 1.074 |
| 9802.0 | 1.074 |
| 9803.0 | 1.074 |
| 9804.0 | 1.074 |
| 9805.0 | 1.074 |
| 9806.0 | 1.074 |
| 9807.0 | 1.074 |
| 9808.0 | 1.074 |
| 9809.0 | 1.074 |
| 9810.0 | 1.074 |
| 9811.0 | 1.074 |
| 9812.0 | 1.074 |
| 9813.0 | 1.074 |
| 9814.0 | 1.074 |
| 9815.0 | 1.074 |
| 9816.0 | 1.074 |
| 9817.0 | 1.074 |
| 9818.0 | 1.074 |
| 9819.0 | 1.074 |
| 9820.0 | 1.074 |
| 9821.0 | 1.074 |
| 9822.0 | 1.074 |
| 9823.0 | 1.074 |
| 9824.0 | 1.074 |
| 9825.0 | 1.074 |
| 9826.0 | 1.074 |
| 9827.0 | 1.074 |
| 9828.0 | 1.074 |
| 9829.0 | 1.074 |
| 9830.0 | 1.074 |
| 9831.0 | 1.074 |
| 9832.0 | 1.074 |
| 9833.0 | 1.074 |
| 9834.0 | 1.074 |
| 9835.0 | 1.074 |
| 9836.0 | 1.074 |
| 9837.0 | 1.074 |
| 9838.0 | 1.074 |
| 9839.0 | 1.074 |
| 9840.0 | 1.074 |
| 9841.0 | 1.074 |
| 9842.0 | 1.074 |
| 9843.0 | 1.074 |
| 9844.0 | 1.074 |
| 9845.0 | 1.074 |
| 9846.0 | 1.074 |
| 9847.0 | 1.074 |
| 9848.0 | 1.074 |
| 9849.0 | 1.074 |
| 9850.0 | 1.074 |
| 9851.0 | 1.074 |
| 9852.0 | 1.074 |
| 9853.0 | 1.074 |
| 9854.0 | 1.074 |
| 9855.0 | 1.074 |
| 9856.0 | 1.074 |
| 9857.0 | 1.074 |
| 9858.0 | 1.074 |
| 9859.0 | 1.074 |
| 9860.0 | 1.074 |
| 9861.0 | 1.074 |
| 9862.0 | 1.074 |
| 9863.0 | 1.074 |
| 9864.0 | 1.074 |
| 9865.0 | 1.074 |
| 9866.0 | 1.074 |
| 9867.0 | 1.074 |
| 9868.0 | 1.074 |
| 9869.0 | 1.074 |
| 9870.0 | 1.074 |
| 9871.0 | 1.074 |
| 9872.0 | 1.074 |
| 9873.0 | 1.074 |
| 9874.0 | 1.074 |
| 9875.0 | 1.074 |
| 9876.0 | 1.074 |
| 9877.0 | 1.074 |
| 9878.0 | 1.074 |
| 9879.0 | 1.074 |
| 9880.0 | 1.074 |
| 9881.0 | 1.074 |
| 9882.0 | 1.074 |
| 9883.0 | 1.074 |
| 9884.0 | 1.074 |
| 9885.0 | 1.074 |
| 9886.0 | 1.074 |
| 9887.0 | 1.074 |
| 9888.0 | 1.074 |
| 9889.0 | 1.074 |
| 9890.0 | 1.074 |
| 9891.0 | 1.074 |
| 9892.0 | 1.074 |
| 9893.0 | 1.074 |
| 9894.0 | 1.074 |
| 9895.0 | 1.074 |
| 9896.0 | 1.074 |
| 9897.0 | 1.074 |
| 9898.0 | 1.074 |
| 9899.0 | 1.074 |
| 9900.0 | 1.074 |
| 9901.0 | 1.074 |
| 9902.0 | 1.074 |
| 9903.0 | 1.074 |
| 9904.0 | 1.074 |
| 9905.0 | 1.074 |
| 9906.0 | 1.074 |
| 9907.0 | 1.074 |
| 9908.0 | 1.074 |
| 9909.0 | 1.074 |
| 9910.0 | 1.074 |
| 9911.0 | 1.074 |
| 9912.0 | 1.074 |
| 9913.0 | 1.074 |
| 9914.0 | 1.074 |
| 9915.0 | 1.074 |
| 9916.0 | 1.074 |
| 9917.0 | 1.074 |
| 9918.0 | 1.074 |
| 9919.0 | 1.074 |
| 9920.0 | 1.074 |
| 9921.0 | 1.074 |
| 9922.0 | 1.074 |
| 9923.0 | 1.074 |
| 9924.0 | 1.074 |
| 9925.0 | 1.074 |
| 9926.0 | 1.074 |
| 9927.0 | 1.074 |
| 9928.0 | 1.074 |
| 9929.0 | 1.074 |
| 9930.0 | 1.074 |
| 9931.0 | 1.074 |
| 9932.0 | 1.074 |
| 9933.0 | 1.074 |
| 9934.0 | 1.074 |
| 9935.0 | 1.074 |
| 9936.0 | 1.074 |
| 9937.0 | 1.074 |
| 9938.0 | 1.074 |
| 9939.0 | 1.074 |
| 9940.0 | 1.074 |
| 9941.0 | 1.074 |
| 9942.0 | 1.074 |
| 9943.0 | 1.074 |
| 9944.0 | 1.074 |
| 9945.0 | 1.074 |
| 9946.0 | 1.074 |
| 9947.0 | 1.074 |
| 9948.0 | 1.074 |
| 9949.0 | 1.074 |
| 9950.0 | 1.074 |
| 9951.0 | 1.074 |
| 9952.0 | 1.074 |
| 9953.0 | 1.074 |
| 9954.0 | 1.074 |
| 9955.0 | 1.074 |
| 9956.0 | 1.074 |
| 9957.0 | 1.074 |
| 9958.0 | 1.074 |
| 9959.0 | 1.074 |
| 9960.0 | 1.074 |
| 9961.0 | 1.074 |
| 9962.0 | 1.074 |
| 9963.0 | 1.074 |
| 9964.0 | 1.074 |
| 9965.0 | 1.074 |
| 9966.0 | 1.074 |
| 9967.0 | 1.074 |
| 9968.0 | 1.074 |
| 9969.0 | 1.074 |
| 9970.0 | 1.074 |
| 9971.0 | 1.074 |
| 9972.0 | 1.074 |
| 9973.0 | 1.074 |
| 9974.0 | 1.074 |
| 9975.0 | 1.074 |
| 9976.0 | 1.074 |
| 9977.0 | 1.074 |
| 9978.0 | 1.074 |
| 9979.0 | 1.074 |
| 9980.0 | 1.074 |
| 9981.0 | 1.074 |
| 9982.0 | 1.074 |
| 9983.0 | 1.074 |
| 9984.0 | 1.074 |
| 9985.0 | 1.074 |
| 9986.0 | 1.074 |
| 9987.0 | 1.074 |
| 9988.0 | 1.074 |
| 9989.0 | 1.074 |
| 9990.0 | 1.074 |
| 9991.0 | 1.074 |
| 9992.0 | 1.074 |
| 9993.0 | 1.074 |
| 9994.0 | 1.074 |
| 9995.0 | 1.074 |
| 9996.0 | 1.074 |
| 9997.0 | 1.074 |
| 9998.0 | 1.074 |
| 9999.0 | 1.074 |
| 10000.0 | 1.074 |